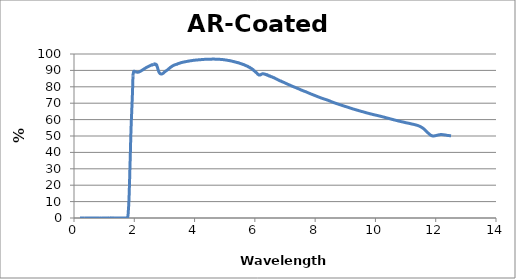
| Category | % Transmission |
|---|---|
| 0.2 | 0 |
| 0.201 | 0 |
| 0.202 | 0 |
| 0.203 | 0 |
| 0.204 | 0 |
| 0.205 | 0 |
| 0.206 | 0 |
| 0.207 | 0 |
| 0.208 | 0 |
| 0.209 | 0 |
| 0.21 | 0 |
| 0.211 | 0 |
| 0.212 | 0 |
| 0.213 | 0 |
| 0.214 | 0 |
| 0.215 | 0 |
| 0.216 | 0 |
| 0.217 | 0 |
| 0.218 | 0 |
| 0.219 | 0 |
| 0.22 | 0 |
| 0.221 | 0 |
| 0.222 | 0 |
| 0.223 | 0 |
| 0.224 | 0 |
| 0.225 | 0 |
| 0.226 | 0 |
| 0.227 | 0 |
| 0.228 | 0 |
| 0.229 | 0 |
| 0.23 | 0 |
| 0.231 | 0 |
| 0.232 | 0 |
| 0.233 | 0 |
| 0.234 | 0 |
| 0.235 | 0 |
| 0.236 | 0 |
| 0.237 | 0 |
| 0.238 | 0 |
| 0.239 | 0 |
| 0.24 | 0 |
| 0.241 | 0 |
| 0.242 | 0 |
| 0.243 | 0 |
| 0.244 | 0 |
| 0.245 | 0 |
| 0.246 | 0 |
| 0.247 | 0 |
| 0.248 | 0 |
| 0.249 | 0 |
| 0.25 | 0 |
| 0.251 | 0 |
| 0.252 | 0 |
| 0.253 | 0 |
| 0.254 | 0 |
| 0.255 | 0 |
| 0.256 | 0 |
| 0.257 | 0 |
| 0.258 | 0 |
| 0.259 | 0 |
| 0.26 | 0 |
| 0.261 | 0 |
| 0.262 | 0 |
| 0.263 | 0 |
| 0.264 | 0 |
| 0.265 | 0 |
| 0.266 | 0 |
| 0.267 | 0 |
| 0.268 | 0 |
| 0.269 | 0 |
| 0.27 | 0 |
| 0.271 | 0 |
| 0.272 | 0 |
| 0.273 | 0 |
| 0.274 | 0 |
| 0.275 | 0 |
| 0.276 | 0 |
| 0.277 | 0 |
| 0.278 | 0 |
| 0.279 | 0 |
| 0.28 | 0 |
| 0.281 | 0 |
| 0.282 | 0 |
| 0.283 | 0 |
| 0.284 | 0 |
| 0.285 | 0 |
| 0.286 | 0 |
| 0.287 | 0 |
| 0.288 | 0 |
| 0.289 | 0 |
| 0.29 | 0 |
| 0.291 | 0 |
| 0.292 | 0 |
| 0.293 | 0 |
| 0.294 | 0 |
| 0.295 | 0 |
| 0.296 | 0 |
| 0.297 | 0 |
| 0.298 | 0 |
| 0.299 | 0 |
| 0.3 | 0 |
| 0.301 | 0 |
| 0.302 | 0 |
| 0.303 | 0 |
| 0.304 | 0 |
| 0.305 | 0 |
| 0.306 | 0 |
| 0.307 | 0 |
| 0.308 | 0 |
| 0.309 | 0 |
| 0.31 | 0 |
| 0.311 | 0 |
| 0.312 | 0 |
| 0.313 | 0 |
| 0.314 | 0 |
| 0.315 | 0 |
| 0.316 | 0 |
| 0.317 | 0 |
| 0.318 | 0 |
| 0.319 | 0 |
| 0.32 | 0 |
| 0.321 | 0 |
| 0.322 | 0 |
| 0.323 | 0 |
| 0.324 | 0 |
| 0.325 | 0 |
| 0.326 | 0 |
| 0.327 | 0 |
| 0.328 | 0 |
| 0.329 | 0 |
| 0.33 | 0 |
| 0.331 | 0 |
| 0.332 | 0 |
| 0.333 | 0 |
| 0.334 | 0 |
| 0.335 | 0 |
| 0.336 | 0 |
| 0.337 | 0 |
| 0.338 | 0 |
| 0.339 | 0 |
| 0.34 | 0 |
| 0.341 | 0 |
| 0.342 | 0 |
| 0.343 | 0 |
| 0.344 | 0 |
| 0.345 | 0 |
| 0.346 | 0 |
| 0.347 | 0 |
| 0.348 | 0 |
| 0.349 | 0 |
| 0.35 | 0 |
| 0.351 | 0 |
| 0.352 | 0 |
| 0.353 | 0 |
| 0.354 | 0 |
| 0.355 | 0 |
| 0.356 | 0 |
| 0.357 | 0 |
| 0.358 | 0 |
| 0.359 | 0 |
| 0.36 | 0 |
| 0.361 | 0 |
| 0.362 | 0 |
| 0.363 | 0 |
| 0.364 | 0 |
| 0.365 | 0 |
| 0.366 | 0 |
| 0.367 | 0 |
| 0.368 | 0 |
| 0.369 | 0 |
| 0.37 | 0 |
| 0.371 | 0 |
| 0.372 | 0 |
| 0.373 | 0 |
| 0.374 | 0 |
| 0.375 | 0 |
| 0.376 | 0 |
| 0.377 | 0 |
| 0.378 | 0 |
| 0.379 | 0 |
| 0.38 | 0 |
| 0.381 | 0 |
| 0.382 | 0 |
| 0.383 | 0 |
| 0.384 | 0 |
| 0.385 | 0 |
| 0.386 | 0 |
| 0.387 | 0 |
| 0.388 | 0 |
| 0.389 | 0 |
| 0.39 | 0 |
| 0.391 | 0 |
| 0.392 | 0 |
| 0.393 | 0 |
| 0.394 | 0 |
| 0.395 | 0 |
| 0.396 | 0 |
| 0.397 | 0 |
| 0.398 | 0 |
| 0.399 | 0 |
| 0.4 | 0 |
| 0.401 | 0 |
| 0.402 | 0 |
| 0.403 | 0 |
| 0.404 | 0 |
| 0.405 | 0 |
| 0.406 | 0 |
| 0.407 | 0 |
| 0.408 | 0 |
| 0.409 | 0 |
| 0.41 | 0 |
| 0.411 | 0 |
| 0.412 | 0 |
| 0.413 | 0 |
| 0.414 | 0 |
| 0.415 | 0 |
| 0.416 | 0 |
| 0.417 | 0 |
| 0.418 | 0 |
| 0.419 | 0 |
| 0.42 | 0 |
| 0.421 | 0 |
| 0.422 | 0 |
| 0.423 | 0 |
| 0.424 | 0 |
| 0.425 | 0 |
| 0.426 | 0 |
| 0.427 | 0 |
| 0.428 | 0 |
| 0.429 | 0 |
| 0.43 | 0 |
| 0.431 | 0 |
| 0.432 | 0 |
| 0.433 | 0 |
| 0.434 | 0 |
| 0.435 | 0 |
| 0.436 | 0 |
| 0.437 | 0 |
| 0.438 | 0 |
| 0.439 | 0 |
| 0.44 | 0 |
| 0.441 | 0 |
| 0.442 | 0 |
| 0.443 | 0 |
| 0.444 | 0 |
| 0.445 | 0 |
| 0.446 | 0 |
| 0.447 | 0 |
| 0.448 | 0 |
| 0.449 | 0 |
| 0.45 | 0 |
| 0.451 | 0 |
| 0.452 | 0 |
| 0.453 | 0 |
| 0.454 | 0 |
| 0.455 | 0 |
| 0.456 | 0 |
| 0.457 | 0 |
| 0.458 | 0 |
| 0.459 | 0 |
| 0.46 | 0 |
| 0.461 | 0 |
| 0.462 | 0 |
| 0.463 | 0 |
| 0.464 | 0 |
| 0.465 | 0 |
| 0.466 | 0 |
| 0.467 | 0 |
| 0.468 | 0 |
| 0.469 | 0 |
| 0.47 | 0 |
| 0.471 | 0 |
| 0.472 | 0 |
| 0.473 | 0 |
| 0.474 | 0 |
| 0.475 | 0 |
| 0.476 | 0 |
| 0.477 | 0 |
| 0.478 | 0 |
| 0.479 | 0 |
| 0.48 | 0 |
| 0.481 | 0 |
| 0.482 | 0 |
| 0.483 | 0 |
| 0.484 | 0 |
| 0.485 | 0 |
| 0.486 | 0 |
| 0.487 | 0 |
| 0.488 | 0 |
| 0.489 | 0 |
| 0.49 | 0 |
| 0.491 | 0 |
| 0.492 | 0 |
| 0.493 | 0 |
| 0.494 | 0 |
| 0.495 | 0 |
| 0.496 | 0 |
| 0.497 | 0 |
| 0.498 | 0 |
| 0.499 | 0 |
| 0.5 | 0 |
| 0.501 | 0 |
| 0.502 | 0 |
| 0.503 | 0 |
| 0.504 | 0 |
| 0.505 | 0 |
| 0.506 | 0 |
| 0.507 | 0 |
| 0.508 | 0 |
| 0.509 | 0 |
| 0.51 | 0 |
| 0.511 | 0 |
| 0.512 | 0 |
| 0.513 | 0 |
| 0.514 | 0 |
| 0.515 | 0 |
| 0.516 | 0 |
| 0.517 | 0 |
| 0.518 | 0 |
| 0.519 | 0 |
| 0.52 | 0 |
| 0.521 | 0 |
| 0.522 | 0 |
| 0.523 | 0 |
| 0.524 | 0 |
| 0.525 | 0 |
| 0.526 | 0 |
| 0.527 | 0 |
| 0.528 | 0 |
| 0.529 | 0 |
| 0.53 | 0 |
| 0.531 | 0 |
| 0.532 | 0 |
| 0.533 | 0 |
| 0.534 | 0 |
| 0.535 | 0 |
| 0.536 | 0 |
| 0.537 | 0 |
| 0.538 | 0 |
| 0.539 | 0 |
| 0.54 | 0 |
| 0.541 | 0 |
| 0.542 | 0 |
| 0.543 | 0 |
| 0.544 | 0 |
| 0.545 | 0 |
| 0.546 | 0 |
| 0.547 | 0 |
| 0.548 | 0 |
| 0.549 | 0 |
| 0.55 | 0 |
| 0.551 | 0 |
| 0.552 | 0 |
| 0.553 | 0 |
| 0.554 | 0 |
| 0.555 | 0 |
| 0.556 | 0 |
| 0.557 | 0 |
| 0.558 | 0 |
| 0.559 | 0 |
| 0.56 | 0 |
| 0.561 | 0 |
| 0.562 | 0 |
| 0.563 | 0 |
| 0.564 | 0 |
| 0.565 | 0 |
| 0.566 | 0 |
| 0.567 | 0 |
| 0.568 | 0 |
| 0.569 | 0 |
| 0.57 | 0 |
| 0.571 | 0 |
| 0.572 | 0 |
| 0.573 | 0 |
| 0.574 | 0 |
| 0.575 | 0 |
| 0.576 | 0 |
| 0.577 | 0 |
| 0.578 | 0 |
| 0.579 | 0 |
| 0.58 | 0 |
| 0.581 | 0 |
| 0.582 | 0 |
| 0.583 | 0 |
| 0.584 | 0 |
| 0.585 | 0 |
| 0.586 | 0 |
| 0.587 | 0 |
| 0.588 | 0 |
| 0.589 | 0 |
| 0.59 | 0 |
| 0.591 | 0 |
| 0.592 | 0 |
| 0.593 | 0 |
| 0.594 | 0 |
| 0.595 | 0 |
| 0.596 | 0 |
| 0.597 | 0 |
| 0.598 | 0 |
| 0.599 | 0 |
| 0.6 | 0 |
| 0.601 | 0 |
| 0.602 | 0 |
| 0.603 | 0 |
| 0.604 | 0 |
| 0.605 | 0 |
| 0.606 | 0 |
| 0.607 | 0 |
| 0.608 | 0 |
| 0.609 | 0 |
| 0.61 | 0 |
| 0.611 | 0 |
| 0.612 | 0 |
| 0.613 | 0 |
| 0.614 | 0 |
| 0.615 | 0 |
| 0.616 | 0 |
| 0.617 | 0 |
| 0.618 | 0 |
| 0.619 | 0 |
| 0.62 | 0 |
| 0.621 | 0 |
| 0.622 | 0 |
| 0.623 | 0 |
| 0.624 | 0 |
| 0.625 | 0 |
| 0.626 | 0 |
| 0.627 | 0 |
| 0.628 | 0 |
| 0.629 | 0 |
| 0.63 | 0 |
| 0.631 | 0 |
| 0.632 | 0 |
| 0.633 | 0 |
| 0.634 | 0 |
| 0.635 | 0 |
| 0.636 | 0 |
| 0.637 | 0 |
| 0.638 | 0 |
| 0.639 | 0 |
| 0.64 | 0 |
| 0.641 | 0 |
| 0.642 | 0 |
| 0.643 | 0 |
| 0.644 | 0 |
| 0.645 | 0 |
| 0.646 | 0 |
| 0.647 | 0 |
| 0.648 | 0 |
| 0.649 | 0 |
| 0.65 | 0 |
| 0.651 | 0 |
| 0.652 | 0 |
| 0.653 | 0 |
| 0.654 | 0 |
| 0.655 | 0 |
| 0.656 | 0 |
| 0.657 | 0 |
| 0.658 | 0 |
| 0.659 | 0 |
| 0.66 | 0 |
| 0.661 | 0 |
| 0.662 | 0 |
| 0.663 | 0 |
| 0.664 | 0 |
| 0.665 | 0 |
| 0.666 | 0 |
| 0.667 | 0 |
| 0.668 | 0 |
| 0.669 | 0 |
| 0.67 | 0 |
| 0.671 | 0 |
| 0.672 | 0 |
| 0.673 | 0 |
| 0.674 | 0 |
| 0.675 | 0 |
| 0.676 | 0 |
| 0.677 | 0 |
| 0.678 | 0 |
| 0.679 | 0 |
| 0.68 | 0 |
| 0.681 | 0 |
| 0.682 | 0 |
| 0.683 | 0 |
| 0.684 | 0 |
| 0.685 | 0 |
| 0.686 | 0 |
| 0.687 | 0 |
| 0.688 | 0 |
| 0.689 | 0 |
| 0.69 | 0 |
| 0.691 | 0 |
| 0.692 | 0 |
| 0.693 | 0 |
| 0.694 | 0 |
| 0.695 | 0 |
| 0.696 | 0 |
| 0.697 | 0 |
| 0.698 | 0 |
| 0.699 | 0 |
| 0.7 | 0 |
| 0.701 | 0 |
| 0.702 | 0 |
| 0.703 | 0 |
| 0.704 | 0 |
| 0.705 | 0 |
| 0.706 | 0 |
| 0.707 | 0 |
| 0.708 | 0 |
| 0.709 | 0 |
| 0.71 | 0 |
| 0.711 | 0 |
| 0.712 | 0 |
| 0.713 | 0 |
| 0.714 | 0 |
| 0.715 | 0 |
| 0.716 | 0 |
| 0.717 | 0 |
| 0.718 | 0 |
| 0.719 | 0 |
| 0.72 | 0 |
| 0.721 | 0 |
| 0.722 | 0 |
| 0.723 | 0 |
| 0.724 | 0 |
| 0.725 | 0 |
| 0.726 | 0 |
| 0.727 | 0 |
| 0.728 | 0 |
| 0.729 | 0 |
| 0.73 | 0 |
| 0.731 | 0 |
| 0.732 | 0 |
| 0.733 | 0 |
| 0.734 | 0 |
| 0.735 | 0 |
| 0.736 | 0 |
| 0.737 | 0 |
| 0.738 | 0 |
| 0.739 | 0 |
| 0.74 | 0 |
| 0.741 | 0 |
| 0.742 | 0 |
| 0.743 | 0 |
| 0.744 | 0 |
| 0.745 | 0 |
| 0.746 | 0 |
| 0.747 | 0 |
| 0.748 | 0 |
| 0.749 | 0 |
| 0.75 | 0 |
| 0.751 | 0 |
| 0.752 | 0 |
| 0.753 | 0 |
| 0.754 | 0 |
| 0.755 | 0 |
| 0.756 | 0 |
| 0.757 | 0 |
| 0.758 | 0 |
| 0.759 | 0 |
| 0.76 | 0 |
| 0.761 | 0 |
| 0.762 | 0 |
| 0.763 | 0 |
| 0.764 | 0 |
| 0.765 | 0 |
| 0.766 | 0 |
| 0.767 | 0 |
| 0.768 | 0 |
| 0.769 | 0 |
| 0.77 | 0 |
| 0.771 | 0 |
| 0.772 | 0 |
| 0.773 | 0 |
| 0.774 | 0 |
| 0.775 | 0 |
| 0.776 | 0 |
| 0.777 | 0 |
| 0.778 | 0 |
| 0.779 | 0 |
| 0.78 | 0 |
| 0.781 | 0 |
| 0.782 | 0 |
| 0.783 | 0 |
| 0.784 | 0 |
| 0.785 | 0 |
| 0.786 | 0 |
| 0.787 | 0 |
| 0.788 | 0 |
| 0.789 | 0 |
| 0.79 | 0 |
| 0.791 | 0 |
| 0.792 | 0 |
| 0.793 | 0 |
| 0.794 | 0 |
| 0.795 | 0 |
| 0.796 | 0 |
| 0.797 | 0 |
| 0.798 | 0 |
| 0.799 | 0 |
| 0.8 | 0 |
| 0.801 | 0 |
| 0.802 | 0 |
| 0.803 | 0 |
| 0.804 | 0 |
| 0.805 | 0 |
| 0.806 | 0 |
| 0.807 | 0 |
| 0.808 | 0 |
| 0.809 | 0 |
| 0.81 | 0 |
| 0.811 | 0 |
| 0.812 | 0 |
| 0.813 | 0 |
| 0.814 | 0 |
| 0.815 | 0 |
| 0.816 | 0 |
| 0.817 | 0 |
| 0.818 | 0 |
| 0.819 | 0 |
| 0.82 | 0 |
| 0.821 | 0 |
| 0.822 | 0 |
| 0.823 | 0 |
| 0.824 | 0 |
| 0.825 | 0 |
| 0.826 | 0 |
| 0.827 | 0 |
| 0.828 | 0 |
| 0.829 | 0 |
| 0.83 | 0 |
| 0.831 | 0 |
| 0.832 | 0 |
| 0.833 | 0 |
| 0.834 | 0 |
| 0.835 | 0 |
| 0.836 | 0 |
| 0.837 | 0 |
| 0.838 | 0 |
| 0.839 | 0 |
| 0.84 | 0 |
| 0.841 | 0 |
| 0.842 | 0 |
| 0.843 | 0 |
| 0.844 | 0 |
| 0.845 | 0 |
| 0.846 | 0 |
| 0.847 | 0 |
| 0.848 | 0 |
| 0.849 | 0 |
| 0.85 | 0 |
| 0.851 | 0 |
| 0.852 | 0 |
| 0.853 | 0 |
| 0.854 | 0 |
| 0.855 | 0 |
| 0.856 | 0 |
| 0.857 | 0 |
| 0.858 | 0 |
| 0.859 | 0 |
| 0.86 | 0.018 |
| 0.861 | 0.009 |
| 0.862 | 0.022 |
| 0.863 | 0.005 |
| 0.864 | 0.008 |
| 0.865 | 0.018 |
| 0.866 | 0.008 |
| 0.867 | 0.009 |
| 0.868 | 0.015 |
| 0.869 | 0.008 |
| 0.87 | 0.009 |
| 0.871 | 0.011 |
| 0.872 | 0 |
| 0.873 | 0 |
| 0.874 | 0.002 |
| 0.875 | 0.007 |
| 0.876 | 0.006 |
| 0.877 | 0.003 |
| 0.878 | 0.002 |
| 0.879 | 0.012 |
| 0.88 | 0.001 |
| 0.881 | 0.002 |
| 0.882 | 0.004 |
| 0.883 | 0 |
| 0.884 | 0.008 |
| 0.885 | 0.001 |
| 0.886 | 0 |
| 0.887 | 0 |
| 0.888 | 0 |
| 0.889 | 0.005 |
| 0.89 | 0.006 |
| 0.891 | 0.001 |
| 0.892 | 0.003 |
| 0.893 | 0.004 |
| 0.894 | 0.008 |
| 0.895 | 0.002 |
| 0.896 | 0 |
| 0.897 | 0.008 |
| 0.898 | 0.001 |
| 0.899 | 0.003 |
| 0.9 | 0.001 |
| 0.901 | 0.001 |
| 0.902 | 0.004 |
| 0.903 | 0 |
| 0.904 | 0.003 |
| 0.905 | 0.003 |
| 0.906 | 0.002 |
| 0.907 | 0.005 |
| 0.908 | 0.003 |
| 0.909 | 0.004 |
| 0.91 | 0.002 |
| 0.911 | 0.001 |
| 0.912 | 0.008 |
| 0.913 | 0.001 |
| 0.914 | 0.002 |
| 0.915 | 0 |
| 0.916 | 0 |
| 0.917 | 0.005 |
| 0.918 | 0 |
| 0.919 | 0.003 |
| 0.92 | 0.001 |
| 0.921 | 0.002 |
| 0.922 | 0.005 |
| 0.923 | 0.004 |
| 0.924 | 0.005 |
| 0.925 | 0.002 |
| 0.926 | 0.001 |
| 0.927 | 0.006 |
| 0.928 | 0.003 |
| 0.929 | 0.002 |
| 0.93 | 0.002 |
| 0.931 | 0.001 |
| 0.932 | 0.006 |
| 0.933 | 0 |
| 0.934 | 0.004 |
| 0.935 | 0.005 |
| 0.936 | 0.003 |
| 0.937 | 0.004 |
| 0.938 | 0.001 |
| 0.939 | 0.006 |
| 0.94 | 0.006 |
| 0.941 | 0.003 |
| 0.942 | 0.005 |
| 0.943 | 0 |
| 0.944 | 0.005 |
| 0.945 | 0.001 |
| 0.946 | 0.003 |
| 0.947 | 0 |
| 0.948 | 0 |
| 0.949 | 0.008 |
| 0.95 | 0.006 |
| 0.951 | 0.003 |
| 0.952 | 0.011 |
| 0.953 | 0.005 |
| 0.954 | 0 |
| 0.955 | 0.009 |
| 0.956 | 0.006 |
| 0.957 | 0 |
| 0.958 | 0.008 |
| 0.959 | 0.008 |
| 0.96 | 0 |
| 0.961 | 0.009 |
| 0.962 | 0.006 |
| 0.963 | 0 |
| 0.964 | 0.008 |
| 0.965 | 0.005 |
| 0.966 | 0 |
| 0.967 | 0.008 |
| 0.968 | 0.006 |
| 0.969 | 0.001 |
| 0.97 | 0.004 |
| 0.971 | 0.007 |
| 0.972 | 0.003 |
| 0.973 | 0.004 |
| 0.974 | 0.007 |
| 0.975 | 0.006 |
| 0.976 | 0.006 |
| 0.977 | 0.005 |
| 0.978 | 0.008 |
| 0.979 | 0.008 |
| 0.98 | 0.002 |
| 0.981 | 0.008 |
| 0.982 | 0.009 |
| 0.983 | 0.002 |
| 0.984 | 0.006 |
| 0.985 | 0.009 |
| 0.986 | 0.004 |
| 0.987 | 0.009 |
| 0.988 | 0.011 |
| 0.989 | 0.006 |
| 0.99 | 0.009 |
| 0.991 | 0.011 |
| 0.992 | 0.004 |
| 0.993 | 0.007 |
| 0.994 | 0.01 |
| 0.995 | 0.006 |
| 0.996 | 0.008 |
| 0.997 | 0.011 |
| 0.998 | 0.004 |
| 0.999 | 0.007 |
| 1.0 | 0.011 |
| 1.001 | 0.003 |
| 1.002 | 0.008 |
| 1.003 | 0.011 |
| 1.004 | 0.003 |
| 1.005 | 0.012 |
| 1.006 | 0.008 |
| 1.007 | 0.001 |
| 1.008 | 0.01 |
| 1.009 | 0.008 |
| 1.01 | 0 |
| 1.011 | 0.01 |
| 1.012 | 0.009 |
| 1.013 | 0.002 |
| 1.014 | 0.013 |
| 1.015 | 0.009 |
| 1.016 | 0.002 |
| 1.017 | 0.012 |
| 1.018 | 0.011 |
| 1.019 | 0.001 |
| 1.02 | 0.014 |
| 1.021 | 0.008 |
| 1.022 | 0.001 |
| 1.023 | 0.012 |
| 1.024 | 0.011 |
| 1.025 | 0 |
| 1.026 | 0.014 |
| 1.027 | 0.008 |
| 1.028 | 0.002 |
| 1.029 | 0.011 |
| 1.03 | 0.012 |
| 1.031 | 0.008 |
| 1.032 | 0.011 |
| 1.033 | 0.014 |
| 1.034 | 0.006 |
| 1.035 | 0.011 |
| 1.036 | 0.012 |
| 1.037 | 0.005 |
| 1.038 | 0.01 |
| 1.039 | 0.013 |
| 1.04 | 0.005 |
| 1.041 | 0.008 |
| 1.042 | 0.011 |
| 1.043 | 0.005 |
| 1.044 | 0.007 |
| 1.045 | 0.006 |
| 1.046 | 0.001 |
| 1.047 | 0.002 |
| 1.048 | 0 |
| 1.049 | 0.023 |
| 1.05 | 0.014 |
| 1.051 | 0.019 |
| 1.052 | 0.02 |
| 1.053 | 0.012 |
| 1.054 | 0.02 |
| 1.055 | 0.019 |
| 1.056 | 0.025 |
| 1.057 | 0.021 |
| 1.058 | 0.027 |
| 1.059 | 0.061 |
| 1.06 | 0.024 |
| 1.061 | 0.005 |
| 1.062 | 0.005 |
| 1.063 | 0.008 |
| 1.064 | 0.014 |
| 1.065 | 0.016 |
| 1.066 | 0.015 |
| 1.067 | 0.017 |
| 1.068 | 0.004 |
| 1.069 | 0.028 |
| 1.07 | 0.017 |
| 1.071 | 0.002 |
| 1.072 | 0.011 |
| 1.073 | 0.008 |
| 1.074 | 0.009 |
| 1.075 | 0.012 |
| 1.076 | 0.006 |
| 1.077 | 0.002 |
| 1.078 | 0.003 |
| 1.079 | 0.011 |
| 1.08 | 0.015 |
| 1.081 | 0.006 |
| 1.082 | 0.009 |
| 1.083 | 0.006 |
| 1.084 | 0.007 |
| 1.085 | 0.034 |
| 1.086 | 0.016 |
| 1.087 | 0.008 |
| 1.088 | 0.01 |
| 1.089 | 0.003 |
| 1.09 | 0.002 |
| 1.091 | 0.002 |
| 1.092 | 0 |
| 1.093 | 0.003 |
| 1.094 | 0.006 |
| 1.095 | 0.006 |
| 1.096 | 0.008 |
| 1.097 | 0.002 |
| 1.098 | 0.006 |
| 1.099 | 0.011 |
| 1.1 | 0.007 |
| 1.101 | 0.007 |
| 1.102 | 0.044 |
| 1.103 | 0.027 |
| 1.104 | 0.003 |
| 1.105 | 0.004 |
| 1.106 | 0.001 |
| 1.107 | 0.001 |
| 1.108 | 0.008 |
| 1.109 | 0 |
| 1.11 | 0.001 |
| 1.111 | 0.002 |
| 1.112 | 0.002 |
| 1.113 | 0.011 |
| 1.114 | 0.015 |
| 1.115 | 0.014 |
| 1.116 | 0.005 |
| 1.117 | 0.006 |
| 1.118 | 0.015 |
| 1.119 | 0.014 |
| 1.12 | 0.003 |
| 1.121 | 0.011 |
| 1.122 | 0.039 |
| 1.123 | 0.004 |
| 1.124 | 0.016 |
| 1.125 | 0.016 |
| 1.126 | 0.009 |
| 1.127 | 0.004 |
| 1.128 | 0.029 |
| 1.129 | 0.044 |
| 1.13 | 0.051 |
| 1.131 | 0.024 |
| 1.132 | 0.035 |
| 1.133 | 0.06 |
| 1.134 | 0.065 |
| 1.135 | 0.008 |
| 1.136 | 0.017 |
| 1.137 | 0.011 |
| 1.138 | 0.015 |
| 1.139 | 0.015 |
| 1.14 | 0.023 |
| 1.141 | 0.018 |
| 1.142 | 0.017 |
| 1.143 | 0.019 |
| 1.144 | 0.006 |
| 1.145 | 0.041 |
| 1.146 | 0.047 |
| 1.147 | 0 |
| 1.148 | 0.017 |
| 1.149 | 0.016 |
| 1.15 | 0.031 |
| 1.151 | 0.029 |
| 1.152 | 0.024 |
| 1.153 | 0.013 |
| 1.154 | 0.049 |
| 1.155 | 0.06 |
| 1.156 | 0.061 |
| 1.157 | 0.006 |
| 1.158 | 0.015 |
| 1.159 | 0.007 |
| 1.16 | 0.009 |
| 1.161 | 0.013 |
| 1.162 | 0.014 |
| 1.163 | 0.022 |
| 1.164 | 0.018 |
| 1.165 | 0.034 |
| 1.166 | 0.033 |
| 1.167 | 0.03 |
| 1.168 | 0.021 |
| 1.169 | 0.031 |
| 1.17 | 0.045 |
| 1.171 | 0.052 |
| 1.172 | 0.05 |
| 1.173 | 0.046 |
| 1.174 | 0.004 |
| 1.175 | 0.006 |
| 1.176 | 0.003 |
| 1.177 | 0.005 |
| 1.178 | 0.001 |
| 1.179 | 0.012 |
| 1.18 | 0.001 |
| 1.181 | 0.003 |
| 1.182 | 0.004 |
| 1.183 | 0.007 |
| 1.184 | 0.012 |
| 1.185 | 0.008 |
| 1.186 | 0.009 |
| 1.187 | 0.004 |
| 1.188 | 0.012 |
| 1.189 | 0.015 |
| 1.19 | 0.033 |
| 1.191 | 0.049 |
| 1.192 | 0.044 |
| 1.193 | 0.004 |
| 1.194 | 0.015 |
| 1.195 | 0.023 |
| 1.196 | 0.026 |
| 1.197 | 0.008 |
| 1.198 | 0.026 |
| 1.199 | 0.005 |
| 1.2 | 0.009 |
| 1.201 | 0.018 |
| 1.202 | 0.02 |
| 1.203 | 0.018 |
| 1.204 | 0.01 |
| 1.205 | 0.029 |
| 1.206 | 0.028 |
| 1.207 | 0.021 |
| 1.208 | 0.046 |
| 1.209 | 0.045 |
| 1.21 | 0.013 |
| 1.211 | 0.022 |
| 1.212 | 0.01 |
| 1.213 | 0.027 |
| 1.214 | 0.001 |
| 1.215 | 0.071 |
| 1.216 | 0.04 |
| 1.217 | 0.009 |
| 1.218 | 0.014 |
| 1.219 | 0.029 |
| 1.22 | 0.022 |
| 1.221 | 0.012 |
| 1.222 | 0.061 |
| 1.223 | 0.05 |
| 1.224 | 0.003 |
| 1.225 | 0.002 |
| 1.226 | 0.005 |
| 1.227 | 0.001 |
| 1.228 | 0.006 |
| 1.229 | 0.004 |
| 1.23 | 0.01 |
| 1.231 | 0.011 |
| 1.232 | 0.009 |
| 1.233 | 0.017 |
| 1.234 | 0.009 |
| 1.235 | 0.003 |
| 1.236 | 0.017 |
| 1.237 | 0.016 |
| 1.238 | 0.018 |
| 1.239 | 0.003 |
| 1.24 | 0.052 |
| 1.241 | 0.001 |
| 1.242 | 0.006 |
| 1.243 | 0.009 |
| 1.244 | 0.004 |
| 1.245 | 0.01 |
| 1.246 | 0.016 |
| 1.247 | 0.002 |
| 1.248 | 0.005 |
| 1.249 | 0.009 |
| 1.25 | 0.014 |
| 1.251 | 0.001 |
| 1.252 | 0.005 |
| 1.253 | 0 |
| 1.254 | 0.002 |
| 1.255 | 0.004 |
| 1.256 | 0.035 |
| 1.257 | 0.09 |
| 1.258 | 0.059 |
| 1.259 | 0.034 |
| 1.26 | 0.057 |
| 1.261 | 0.025 |
| 1.262 | 0.03 |
| 1.263 | 0.013 |
| 1.264 | 0.046 |
| 1.265 | 0.042 |
| 1.266 | 0.006 |
| 1.267 | 0.007 |
| 1.268 | 0.021 |
| 1.269 | 0.013 |
| 1.27 | 0.016 |
| 1.271 | 0.007 |
| 1.272 | 0.008 |
| 1.273 | 0.009 |
| 1.274 | 0.012 |
| 1.275 | 0.012 |
| 1.276 | 0.024 |
| 1.277 | 0.026 |
| 1.278 | 0.027 |
| 1.279 | 0.001 |
| 1.28 | 0.061 |
| 1.281 | 0.061 |
| 1.282 | 0.043 |
| 1.283 | 0.003 |
| 1.284 | 0.007 |
| 1.285 | 0.008 |
| 1.286 | 0.006 |
| 1.287 | 0.003 |
| 1.288 | 0.003 |
| 1.289 | 0.018 |
| 1.29 | 0.012 |
| 1.291 | 0.014 |
| 1.292 | 0.025 |
| 1.293 | 0.014 |
| 1.294 | 0.012 |
| 1.295 | 0.02 |
| 1.296 | 0.019 |
| 1.297 | 0.03 |
| 1.298 | 0.035 |
| 1.299 | 0.019 |
| 1.3 | 0.021 |
| 1.301 | 0.022 |
| 1.302 | 0.018 |
| 1.303 | 0.011 |
| 1.304 | 0.025 |
| 1.305 | 0.026 |
| 1.306 | 0 |
| 1.307 | 0.037 |
| 1.308 | 0.011 |
| 1.309 | 0.02 |
| 1.31 | 0.021 |
| 1.311 | 0.041 |
| 1.312 | 0.038 |
| 1.313 | 0.049 |
| 1.314 | 0.016 |
| 1.315 | 0.031 |
| 1.316 | 0.041 |
| 1.317 | 0.054 |
| 1.318 | 0.068 |
| 1.319 | 0.039 |
| 1.32 | 0.01 |
| 1.321 | 0.009 |
| 1.322 | 0.015 |
| 1.323 | 0.013 |
| 1.324 | 0.011 |
| 1.325 | 0.014 |
| 1.326 | 0.007 |
| 1.327 | 0.014 |
| 1.328 | 0.015 |
| 1.329 | 0.029 |
| 1.33 | 0.024 |
| 1.331 | 0.038 |
| 1.332 | 0.032 |
| 1.333 | 0.021 |
| 1.334 | 0.017 |
| 1.335 | 0.049 |
| 1.336 | 0.023 |
| 1.337 | 0.018 |
| 1.338 | 0.015 |
| 1.339 | 0.018 |
| 1.34 | 0.028 |
| 1.341 | 0.027 |
| 1.342 | 0.024 |
| 1.343 | 0.022 |
| 1.344 | 0.011 |
| 1.345 | 0.051 |
| 1.346 | 0.008 |
| 1.347 | 0.019 |
| 1.348 | 0.009 |
| 1.349 | 0.018 |
| 1.35 | 0.03 |
| 1.351 | 0.026 |
| 1.352 | 0.006 |
| 1.353 | 0.003 |
| 1.354 | 0.02 |
| 1.355 | 0.047 |
| 1.356 | 0.007 |
| 1.357 | 0.004 |
| 1.358 | 0.009 |
| 1.359 | 0.003 |
| 1.36 | 0.002 |
| 1.361 | 0.007 |
| 1.362 | 0.006 |
| 1.363 | 0.003 |
| 1.364 | 0.006 |
| 1.365 | 0.005 |
| 1.366 | 0.003 |
| 1.367 | 0.009 |
| 1.368 | 0.006 |
| 1.369 | 0.003 |
| 1.37 | 0.008 |
| 1.371 | 0.006 |
| 1.372 | 0.002 |
| 1.373 | 0.007 |
| 1.374 | 0.005 |
| 1.375 | 0.002 |
| 1.376 | 0.006 |
| 1.377 | 0.005 |
| 1.378 | 0.001 |
| 1.379 | 0.008 |
| 1.38 | 0.007 |
| 1.381 | 0 |
| 1.382 | 0.01 |
| 1.383 | 0.008 |
| 1.384 | 0.004 |
| 1.385 | 0.012 |
| 1.386 | 0.01 |
| 1.387 | 0.001 |
| 1.388 | 0.008 |
| 1.389 | 0.01 |
| 1.39 | 0.002 |
| 1.391 | 0.007 |
| 1.392 | 0.009 |
| 1.393 | 0.001 |
| 1.394 | 0.009 |
| 1.395 | 0.009 |
| 1.396 | 0.002 |
| 1.397 | 0.009 |
| 1.398 | 0.009 |
| 1.399 | 0.002 |
| 1.4 | 0.01 |
| 1.401 | 0.01 |
| 1.402 | 0.001 |
| 1.403 | 0.008 |
| 1.404 | 0.01 |
| 1.405 | 0 |
| 1.406 | 0.011 |
| 1.407 | 0.011 |
| 1.408 | 0.002 |
| 1.409 | 0.008 |
| 1.41 | 0.013 |
| 1.411 | 0 |
| 1.412 | 0.009 |
| 1.413 | 0.01 |
| 1.414 | 0.001 |
| 1.415 | 0.009 |
| 1.416 | 0.01 |
| 1.417 | 0.002 |
| 1.418 | 0.01 |
| 1.419 | 0.009 |
| 1.42 | 0.002 |
| 1.421 | 0.007 |
| 1.422 | 0.01 |
| 1.423 | 0.001 |
| 1.424 | 0.009 |
| 1.425 | 0.009 |
| 1.426 | 0.002 |
| 1.427 | 0.001 |
| 1.428 | 0.009 |
| 1.429 | 0.01 |
| 1.43 | 0.003 |
| 1.431 | 0.008 |
| 1.432 | 0.007 |
| 1.433 | 0.002 |
| 1.434 | 0.006 |
| 1.435 | 0.007 |
| 1.436 | 0.001 |
| 1.437 | 0.006 |
| 1.438 | 0.008 |
| 1.439 | 0.003 |
| 1.44 | 0.008 |
| 1.441 | 0.006 |
| 1.442 | 0.001 |
| 1.443 | 0.008 |
| 1.444 | 0.007 |
| 1.445 | 0.002 |
| 1.446 | 0.008 |
| 1.447 | 0.004 |
| 1.448 | 0.002 |
| 1.449 | 0.005 |
| 1.45 | 0.008 |
| 1.451 | 0.002 |
| 1.452 | 0.006 |
| 1.453 | 0.007 |
| 1.454 | 0 |
| 1.455 | 0.009 |
| 1.456 | 0.008 |
| 1.457 | 0.002 |
| 1.458 | 0.007 |
| 1.459 | 0.008 |
| 1.46 | 0 |
| 1.461 | 0.007 |
| 1.462 | 0.007 |
| 1.463 | 0.001 |
| 1.464 | 0.006 |
| 1.465 | 0.004 |
| 1.466 | 0.003 |
| 1.467 | 0.006 |
| 1.468 | 0.005 |
| 1.469 | 0.002 |
| 1.47 | 0.004 |
| 1.471 | 0.005 |
| 1.472 | 0.001 |
| 1.473 | 0.004 |
| 1.474 | 0.006 |
| 1.475 | 0.002 |
| 1.476 | 0.004 |
| 1.477 | 0.006 |
| 1.478 | 0.003 |
| 1.479 | 0.006 |
| 1.48 | 0.003 |
| 1.481 | 0.001 |
| 1.482 | 0.002 |
| 1.483 | 0.003 |
| 1.484 | 0.003 |
| 1.485 | 0.005 |
| 1.486 | 0.004 |
| 1.487 | 0 |
| 1.488 | 0.003 |
| 1.489 | 0.003 |
| 1.49 | 0 |
| 1.491 | 0.003 |
| 1.492 | 0.005 |
| 1.493 | 0 |
| 1.494 | 0.005 |
| 1.495 | 0.006 |
| 1.496 | 0.001 |
| 1.497 | 0.007 |
| 1.498 | 0.006 |
| 1.499 | 0 |
| 1.5 | 0.002 |
| 1.501 | 0.007 |
| 1.502 | 0.001 |
| 1.503 | 0.007 |
| 1.504 | 0.007 |
| 1.505 | 0.001 |
| 1.506 | 0.005 |
| 1.507 | 0.006 |
| 1.508 | 0.001 |
| 1.509 | 0.005 |
| 1.51 | 0.006 |
| 1.511 | 0.001 |
| 1.512 | 0.005 |
| 1.513 | 0.005 |
| 1.514 | 0.001 |
| 1.515 | 0.004 |
| 1.516 | 0.006 |
| 1.517 | 0.001 |
| 1.518 | 0.006 |
| 1.519 | 0.007 |
| 1.52 | 0 |
| 1.521 | 0.005 |
| 1.522 | 0.005 |
| 1.523 | 0 |
| 1.524 | 0.003 |
| 1.525 | 0.007 |
| 1.526 | 0.001 |
| 1.527 | 0.005 |
| 1.528 | 0.005 |
| 1.529 | 0 |
| 1.53 | 0.003 |
| 1.531 | 0.005 |
| 1.532 | 0 |
| 1.533 | 0.004 |
| 1.534 | 0.005 |
| 1.535 | 0.001 |
| 1.536 | 0.004 |
| 1.537 | 0.004 |
| 1.538 | 0.003 |
| 1.539 | 0.001 |
| 1.54 | 0.003 |
| 1.541 | 0.001 |
| 1.542 | 0.003 |
| 1.543 | 0.005 |
| 1.544 | 0 |
| 1.545 | 0.003 |
| 1.546 | 0.005 |
| 1.547 | 0.001 |
| 1.548 | 0.003 |
| 1.549 | 0.004 |
| 1.55 | 0 |
| 1.551 | 0.003 |
| 1.552 | 0.004 |
| 1.553 | 0.001 |
| 1.554 | 0.002 |
| 1.555 | 0.004 |
| 1.556 | 0.001 |
| 1.557 | 0.003 |
| 1.558 | 0.003 |
| 1.559 | 0.003 |
| 1.56 | 0.003 |
| 1.561 | 0.004 |
| 1.562 | 0 |
| 1.563 | 0 |
| 1.564 | 0.006 |
| 1.565 | 0 |
| 1.566 | 0.002 |
| 1.567 | 0.002 |
| 1.568 | 0.002 |
| 1.569 | 0.002 |
| 1.57 | 0.004 |
| 1.571 | 0.001 |
| 1.572 | 0.001 |
| 1.573 | 0.005 |
| 1.574 | 0.001 |
| 1.575 | 0.001 |
| 1.576 | 0.002 |
| 1.577 | 0.002 |
| 1.578 | 0.001 |
| 1.579 | 0.004 |
| 1.58 | 0 |
| 1.581 | 0.002 |
| 1.582 | 0.003 |
| 1.583 | 0 |
| 1.584 | 0.001 |
| 1.585 | 0.005 |
| 1.586 | 0.001 |
| 1.587 | 0 |
| 1.588 | 0.004 |
| 1.589 | 0.001 |
| 1.59 | 0.001 |
| 1.591 | 0.003 |
| 1.592 | 0 |
| 1.593 | 0.001 |
| 1.594 | 0.003 |
| 1.595 | 0.001 |
| 1.596 | 0.001 |
| 1.597 | 0.004 |
| 1.598 | 0.002 |
| 1.599 | 0.001 |
| 1.6 | 0.002 |
| 1.601 | 0.002 |
| 1.602 | 0 |
| 1.603 | 0.004 |
| 1.604 | 0.002 |
| 1.605 | 0.002 |
| 1.606 | 0.002 |
| 1.607 | 0 |
| 1.608 | 0.001 |
| 1.609 | 0.002 |
| 1.61 | 0.001 |
| 1.611 | 0 |
| 1.612 | 0.001 |
| 1.613 | 0.001 |
| 1.614 | 0.001 |
| 1.615 | 0.004 |
| 1.616 | 0.001 |
| 1.617 | 0 |
| 1.618 | 0.003 |
| 1.619 | 0.001 |
| 1.62 | 0 |
| 1.621 | 0.003 |
| 1.622 | 0 |
| 1.623 | 0.001 |
| 1.624 | 0.002 |
| 1.625 | 0 |
| 1.626 | 0.001 |
| 1.627 | 0.003 |
| 1.628 | 0.001 |
| 1.629 | 0.001 |
| 1.63 | 0.001 |
| 1.631 | 0.002 |
| 1.632 | 0.001 |
| 1.633 | 0.001 |
| 1.634 | 0 |
| 1.635 | 0.003 |
| 1.636 | 0.003 |
| 1.637 | 0.001 |
| 1.638 | 0.001 |
| 1.639 | 0.002 |
| 1.64 | 0 |
| 1.641 | 0 |
| 1.642 | 0.001 |
| 1.643 | 0.002 |
| 1.644 | 0.001 |
| 1.645 | 0.001 |
| 1.646 | 0.001 |
| 1.647 | 0 |
| 1.648 | 0.001 |
| 1.649 | 0.002 |
| 1.65 | 0 |
| 1.651 | 0 |
| 1.652 | 0.001 |
| 1.653 | 0.001 |
| 1.654 | 0.001 |
| 1.655 | 0 |
| 1.656 | 0.001 |
| 1.657 | 0.003 |
| 1.658 | 0.002 |
| 1.659 | 0.003 |
| 1.66 | 0.001 |
| 1.661 | 0.001 |
| 1.662 | 0.002 |
| 1.663 | 0.002 |
| 1.664 | 0.001 |
| 1.665 | 0.001 |
| 1.666 | 0.004 |
| 1.667 | 0 |
| 1.668 | 0 |
| 1.669 | 0.001 |
| 1.67 | 0 |
| 1.671 | 0.003 |
| 1.672 | 0.001 |
| 1.673 | 0.001 |
| 1.674 | 0.002 |
| 1.675 | 0 |
| 1.676 | 0 |
| 1.677 | 0.003 |
| 1.678 | 0 |
| 1.679 | 0.001 |
| 1.68 | 0.001 |
| 1.681 | 0.001 |
| 1.682 | 0.002 |
| 1.683 | 0.002 |
| 1.684 | 0.001 |
| 1.685 | 0.001 |
| 1.686 | 0.001 |
| 1.687 | 0.001 |
| 1.688 | 0.001 |
| 1.689 | 0.001 |
| 1.69 | 0.001 |
| 1.691 | 0.001 |
| 1.692 | 0 |
| 1.693 | 0.001 |
| 1.694 | 0.001 |
| 1.695 | 0.001 |
| 1.696 | 0 |
| 1.697 | 0.001 |
| 1.698 | 0.001 |
| 1.699 | 0 |
| 1.7 | 0.001 |
| 1.701 | 0 |
| 1.702 | 0 |
| 1.703 | 0.002 |
| 1.704 | 0.001 |
| 1.705 | 0.001 |
| 1.706 | 0.001 |
| 1.707 | 0.002 |
| 1.708 | 0.001 |
| 1.709 | 0 |
| 1.71 | 0.002 |
| 1.711 | 0.001 |
| 1.712 | 0.001 |
| 1.713 | 0.001 |
| 1.714 | 0.002 |
| 1.715 | 0.001 |
| 1.716 | 0.001 |
| 1.717 | 0.002 |
| 1.718 | 0.001 |
| 1.719 | 0.002 |
| 1.72 | 0 |
| 1.721 | 0 |
| 1.722 | 0.002 |
| 1.723 | 0.003 |
| 1.724 | 0.002 |
| 1.725 | 0.001 |
| 1.726 | 0.003 |
| 1.727 | 0.002 |
| 1.728 | 0 |
| 1.729 | 0.002 |
| 1.73 | 0.004 |
| 1.731 | 0.002 |
| 1.732 | 0.006 |
| 1.733 | 0.004 |
| 1.734 | 0.005 |
| 1.735 | 0.005 |
| 1.736 | 0.006 |
| 1.737 | 0.005 |
| 1.738 | 0.008 |
| 1.739 | 0.008 |
| 1.74 | 0.006 |
| 1.741 | 0.007 |
| 1.742 | 0.01 |
| 1.743 | 0.011 |
| 1.744 | 0.014 |
| 1.745 | 0.016 |
| 1.746 | 0.016 |
| 1.747 | 0.018 |
| 1.748 | 0.02 |
| 1.749 | 0.023 |
| 1.75 | 0.026 |
| 1.751 | 0.03 |
| 1.752 | 0.031 |
| 1.753 | 0.038 |
| 1.754 | 0.042 |
| 1.755 | 0.045 |
| 1.756 | 0.048 |
| 1.757 | 0.057 |
| 1.758 | 0.061 |
| 1.759 | 0.066 |
| 1.76 | 0.077 |
| 1.761 | 0.083 |
| 1.762 | 0.094 |
| 1.763 | 0.105 |
| 1.764 | 0.112 |
| 1.765 | 0.125 |
| 1.766 | 0.141 |
| 1.767 | 0.152 |
| 1.768 | 0.168 |
| 1.769 | 0.188 |
| 1.77 | 0.206 |
| 1.771 | 0.226 |
| 1.772 | 0.249 |
| 1.773 | 0.273 |
| 1.774 | 0.306 |
| 1.775 | 0.339 |
| 1.776 | 0.379 |
| 1.777 | 0.425 |
| 1.778 | 0.472 |
| 1.779 | 0.524 |
| 1.78 | 0.567 |
| 1.781 | 0.62 |
| 1.782 | 0.674 |
| 1.783 | 0.733 |
| 1.784 | 0.801 |
| 1.785 | 0.885 |
| 1.786 | 0.976 |
| 1.787 | 1.074 |
| 1.788 | 1.193 |
| 1.789 | 1.294 |
| 1.79 | 1.398 |
| 1.791 | 1.523 |
| 1.792 | 1.66 |
| 1.793 | 1.819 |
| 1.794 | 2.006 |
| 1.795 | 2.238 |
| 1.796 | 2.5 |
| 1.797 | 2.786 |
| 1.798 | 3.089 |
| 1.799 | 3.393 |
| 1.8 | 3.688 |
| 1.801 | 3.963 |
| 1.802 | 4.221 |
| 1.803 | 4.478 |
| 1.804 | 4.729 |
| 1.805 | 4.979 |
| 1.806 | 5.238 |
| 1.807 | 5.499 |
| 1.808 | 5.758 |
| 1.809 | 6.033 |
| 1.81 | 6.332 |
| 1.811 | 6.638 |
| 1.812 | 6.944 |
| 1.813 | 7.254 |
| 1.814 | 7.565 |
| 1.815 | 7.9 |
| 1.816 | 8.246 |
| 1.817 | 8.589 |
| 1.818 | 8.94 |
| 1.819 | 9.299 |
| 1.82 | 9.724 |
| 1.821 | 10.166 |
| 1.822 | 10.564 |
| 1.823 | 10.975 |
| 1.824 | 11.41 |
| 1.825 | 11.859 |
| 1.826 | 12.379 |
| 1.827 | 12.915 |
| 1.828 | 13.403 |
| 1.829 | 13.89 |
| 1.83 | 14.43 |
| 1.831 | 14.971 |
| 1.832 | 15.502 |
| 1.833 | 16.033 |
| 1.834 | 16.551 |
| 1.835 | 17.114 |
| 1.836 | 17.739 |
| 1.837 | 18.386 |
| 1.838 | 19.02 |
| 1.839 | 19.644 |
| 1.84 | 20.325 |
| 1.841 | 21.052 |
| 1.842 | 21.727 |
| 1.843 | 22.305 |
| 1.844 | 22.876 |
| 1.845 | 23.479 |
| 1.846 | 24.123 |
| 1.847 | 24.862 |
| 1.848 | 25.634 |
| 1.849 | 26.336 |
| 1.85 | 26.907 |
| 1.851 | 27.477 |
| 1.852 | 28.128 |
| 1.853 | 28.787 |
| 1.854 | 29.416 |
| 1.855 | 30.013 |
| 1.856 | 30.603 |
| 1.857 | 31.21 |
| 1.858 | 31.829 |
| 1.859 | 32.491 |
| 1.86 | 33.205 |
| 1.861 | 33.915 |
| 1.862 | 34.576 |
| 1.863 | 35.165 |
| 1.864 | 35.731 |
| 1.865 | 36.345 |
| 1.866 | 37.019 |
| 1.867 | 37.679 |
| 1.868 | 38.367 |
| 1.869 | 39.101 |
| 1.87 | 39.867 |
| 1.871 | 40.595 |
| 1.872 | 41.338 |
| 1.873 | 42.105 |
| 1.874 | 42.825 |
| 1.875 | 43.52 |
| 1.876 | 44.215 |
| 1.877 | 44.92 |
| 1.878 | 45.619 |
| 1.879 | 46.266 |
| 1.88 | 46.912 |
| 1.881 | 47.562 |
| 1.882 | 48.232 |
| 1.883 | 48.887 |
| 1.884 | 49.563 |
| 1.885 | 50.212 |
| 1.886 | 50.836 |
| 1.887 | 51.422 |
| 1.888 | 51.992 |
| 1.889 | 52.577 |
| 1.89 | 53.159 |
| 1.891 | 53.752 |
| 1.892 | 54.392 |
| 1.893 | 54.947 |
| 1.894 | 55.454 |
| 1.895 | 55.918 |
| 1.896 | 56.365 |
| 1.897 | 56.811 |
| 1.898 | 57.29 |
| 1.899 | 57.73 |
| 1.9 | 58.214 |
| 1.901 | 58.666 |
| 1.902 | 59.074 |
| 1.903 | 59.485 |
| 1.904 | 59.958 |
| 1.905 | 60.46 |
| 1.906 | 60.944 |
| 1.907 | 61.371 |
| 1.908 | 61.794 |
| 1.909 | 62.187 |
| 1.91 | 62.586 |
| 1.911 | 63.031 |
| 1.912 | 63.542 |
| 1.913 | 63.991 |
| 1.914 | 64.476 |
| 1.915 | 64.937 |
| 1.916 | 65.35 |
| 1.917 | 65.756 |
| 1.918 | 66.163 |
| 1.919 | 66.652 |
| 1.92 | 67.126 |
| 1.921 | 67.615 |
| 1.922 | 68.112 |
| 1.923 | 68.591 |
| 1.924 | 69.037 |
| 1.925 | 69.441 |
| 1.926 | 69.91 |
| 1.927 | 70.381 |
| 1.928 | 70.832 |
| 1.929 | 71.313 |
| 1.93 | 71.78 |
| 1.931 | 72.236 |
| 1.932 | 72.696 |
| 1.933 | 73.16 |
| 1.934 | 73.639 |
| 1.935 | 74.092 |
| 1.936 | 74.586 |
| 1.937 | 75.028 |
| 1.938 | 75.539 |
| 1.939 | 76.055 |
| 1.94 | 76.523 |
| 1.941 | 77.049 |
| 1.942 | 77.554 |
| 1.943 | 78.042 |
| 1.944 | 78.561 |
| 1.945 | 79.089 |
| 1.946 | 79.673 |
| 1.947 | 80.256 |
| 1.948 | 80.844 |
| 1.949 | 81.424 |
| 1.95 | 82.085 |
| 1.951 | 82.807 |
| 1.952 | 83.605 |
| 1.953 | 84.373 |
| 1.954 | 85.137 |
| 1.955 | 85.786 |
| 1.956 | 86.392 |
| 1.957 | 86.759 |
| 1.958 | 87.087 |
| 1.959 | 87.301 |
| 1.96 | 87.494 |
| 1.961 | 87.632 |
| 1.962 | 87.77 |
| 1.963 | 87.911 |
| 1.964 | 88.038 |
| 1.965 | 88.13 |
| 1.966 | 88.217 |
| 1.967 | 88.322 |
| 1.968 | 88.387 |
| 1.969 | 88.459 |
| 1.97 | 88.531 |
| 1.971 | 88.625 |
| 1.972 | 88.694 |
| 1.973 | 88.763 |
| 1.974 | 88.883 |
| 1.975 | 88.955 |
| 1.976 | 89.028 |
| 1.977 | 89.1 |
| 1.978 | 89.179 |
| 1.979 | 89.274 |
| 1.98 | 89.333 |
| 1.981 | 89.373 |
| 1.982 | 89.435 |
| 1.983 | 89.465 |
| 1.984 | 89.48 |
| 1.985 | 89.477 |
| 1.986 | 89.484 |
| 1.987 | 89.505 |
| 1.988 | 89.486 |
| 1.989 | 89.505 |
| 1.99 | 89.504 |
| 1.991 | 89.493 |
| 1.992 | 89.493 |
| 1.993 | 89.502 |
| 1.994 | 89.491 |
| 1.995 | 89.514 |
| 1.996 | 89.472 |
| 1.997 | 89.519 |
| 1.998 | 89.477 |
| 1.999 | 89.485 |
| 2.0 | 89.49 |
| 2.0014000000000003 | 89.489 |
| 2.00333 | 89.479 |
| 2.00526 | 89.467 |
| 2.00719 | 89.44 |
| 2.00912 | 89.434 |
| 2.01105 | 89.414 |
| 2.01298 | 89.375 |
| 2.01491 | 89.383 |
| 2.0168399999999997 | 89.362 |
| 2.01877 | 89.342 |
| 2.0207 | 89.338 |
| 2.02263 | 89.309 |
| 2.02456 | 89.298 |
| 2.02649 | 89.265 |
| 2.02842 | 89.261 |
| 2.03035 | 89.243 |
| 2.03228 | 89.21 |
| 2.03421 | 89.224 |
| 2.03614 | 89.206 |
| 2.03807 | 89.181 |
| 2.04 | 89.157 |
| 2.0419300000000002 | 89.133 |
| 2.04386 | 89.136 |
| 2.0457899999999998 | 89.126 |
| 2.04772 | 89.106 |
| 2.04965 | 89.109 |
| 2.05158 | 89.077 |
| 2.05351 | 89.093 |
| 2.05544 | 89.067 |
| 2.0573699999999997 | 89.03 |
| 2.0593000000000004 | 89.014 |
| 2.06123 | 89.024 |
| 2.06316 | 89.009 |
| 2.06509 | 88.999 |
| 2.06702 | 89.003 |
| 2.0689499999999996 | 88.989 |
| 2.0708800000000003 | 88.993 |
| 2.0728 | 88.975 |
| 2.07473 | 88.971 |
| 2.07666 | 88.981 |
| 2.07859 | 88.952 |
| 2.08052 | 88.968 |
| 2.0824499999999997 | 88.944 |
| 2.08438 | 88.941 |
| 2.08631 | 88.941 |
| 2.08824 | 88.932 |
| 2.09017 | 88.938 |
| 2.0921 | 88.937 |
| 2.09403 | 88.897 |
| 2.09596 | 88.923 |
| 2.09789 | 88.93 |
| 2.0998200000000002 | 88.903 |
| 2.10175 | 88.91 |
| 2.1036799999999998 | 88.927 |
| 2.10561 | 88.914 |
| 2.1075399999999997 | 88.912 |
| 2.10947 | 88.887 |
| 2.1114 | 88.897 |
| 2.11333 | 88.915 |
| 2.11526 | 88.909 |
| 2.11719 | 88.915 |
| 2.1191199999999997 | 88.903 |
| 2.1210500000000003 | 88.915 |
| 2.12298 | 88.915 |
| 2.12491 | 88.938 |
| 2.12684 | 88.909 |
| 2.12877 | 88.941 |
| 2.1307 | 88.97 |
| 2.1326300000000002 | 88.968 |
| 2.13456 | 88.984 |
| 2.13649 | 88.978 |
| 2.13842 | 88.973 |
| 2.1403499999999998 | 88.997 |
| 2.1422800000000004 | 88.991 |
| 2.14421 | 88.989 |
| 2.14614 | 89.013 |
| 2.14807 | 89.034 |
| 2.15 | 89.048 |
| 2.1519299999999997 | 89.042 |
| 2.1538600000000003 | 89.052 |
| 2.15579 | 89.073 |
| 2.15772 | 89.086 |
| 2.15965 | 89.105 |
| 2.16158 | 89.093 |
| 2.16351 | 89.139 |
| 2.1654400000000003 | 89.137 |
| 2.16737 | 89.164 |
| 2.1693000000000002 | 89.167 |
| 2.17123 | 89.197 |
| 2.1731599999999998 | 89.213 |
| 2.17509 | 89.234 |
| 2.17702 | 89.236 |
| 2.17895 | 89.258 |
| 2.18088 | 89.272 |
| 2.18281 | 89.284 |
| 2.1847399999999997 | 89.294 |
| 2.18667 | 89.31 |
| 2.1886 | 89.343 |
| 2.1905300000000003 | 89.353 |
| 2.19246 | 89.372 |
| 2.19439 | 89.397 |
| 2.19632 | 89.416 |
| 2.19825 | 89.426 |
| 2.20018 | 89.455 |
| 2.2021100000000002 | 89.461 |
| 2.20404 | 89.467 |
| 2.2059699999999998 | 89.491 |
| 2.2079 | 89.533 |
| 2.2098299999999997 | 89.539 |
| 2.2117600000000004 | 89.549 |
| 2.21369 | 89.574 |
| 2.21562 | 89.604 |
| 2.21755 | 89.623 |
| 2.21948 | 89.642 |
| 2.2214099999999997 | 89.67 |
| 2.2233400000000003 | 89.681 |
| 2.22527 | 89.695 |
| 2.2272 | 89.735 |
| 2.22913 | 89.761 |
| 2.23106 | 89.788 |
| 2.2329899999999996 | 89.799 |
| 2.2349200000000002 | 89.805 |
| 2.23685 | 89.847 |
| 2.23878 | 89.863 |
| 2.24071 | 89.884 |
| 2.2426399999999997 | 89.919 |
| 2.24457 | 89.906 |
| 2.2465 | 89.941 |
| 2.24843 | 89.965 |
| 2.25036 | 89.98 |
| 2.25229 | 90.018 |
| 2.2542199999999997 | 90.037 |
| 2.25615 | 90.056 |
| 2.25808 | 90.071 |
| 2.2600100000000003 | 90.109 |
| 2.26194 | 90.136 |
| 2.26387 | 90.155 |
| 2.2658 | 90.168 |
| 2.26773 | 90.185 |
| 2.26966 | 90.212 |
| 2.27159 | 90.229 |
| 2.27352 | 90.263 |
| 2.2754499999999998 | 90.284 |
| 2.27738 | 90.319 |
| 2.2793099999999997 | 90.341 |
| 2.28124 | 90.371 |
| 2.28317 | 90.371 |
| 2.2851 | 90.403 |
| 2.28703 | 90.44 |
| 2.28896 | 90.432 |
| 2.29089 | 90.479 |
| 2.2928200000000003 | 90.505 |
| 2.29475 | 90.52 |
| 2.29668 | 90.532 |
| 2.29861 | 90.55 |
| 2.30054 | 90.583 |
| 2.30247 | 90.626 |
| 2.3044000000000002 | 90.637 |
| 2.30633 | 90.66 |
| 2.30826 | 90.673 |
| 2.31019 | 90.699 |
| 2.3121199999999997 | 90.745 |
| 2.3140500000000004 | 90.761 |
| 2.31598 | 90.779 |
| 2.31791 | 90.811 |
| 2.31984 | 90.824 |
| 2.32177 | 90.827 |
| 2.3236999999999997 | 90.861 |
| 2.3256300000000003 | 90.908 |
| 2.32756 | 90.93 |
| 2.32949 | 90.945 |
| 2.33142 | 90.979 |
| 2.33335 | 90.989 |
| 2.33528 | 91.002 |
| 2.3372100000000002 | 91.042 |
| 2.33914 | 91.036 |
| 2.34107 | 91.07 |
| 2.343 | 91.085 |
| 2.3449299999999997 | 91.121 |
| 2.34686 | 91.133 |
| 2.34879 | 91.167 |
| 2.35072 | 91.185 |
| 2.35265 | 91.199 |
| 2.35458 | 91.243 |
| 2.35651 | 91.259 |
| 2.35844 | 91.287 |
| 2.36037 | 91.311 |
| 2.3623000000000003 | 91.331 |
| 2.36423 | 91.353 |
| 2.36616 | 91.369 |
| 2.36809 | 91.385 |
| 2.37002 | 91.412 |
| 2.37195 | 91.435 |
| 2.37388 | 91.44 |
| 2.37581 | 91.479 |
| 2.3777399999999997 | 91.492 |
| 2.37967 | 91.521 |
| 2.3815999999999997 | 91.547 |
| 2.3835300000000004 | 91.563 |
| 2.38546 | 91.573 |
| 2.38739 | 91.612 |
| 2.38932 | 91.623 |
| 2.39125 | 91.635 |
| 2.3931799999999996 | 91.672 |
| 2.3951100000000003 | 91.687 |
| 2.39704 | 91.734 |
| 2.39897 | 91.74 |
| 2.4009 | 91.758 |
| 2.40283 | 91.79 |
| 2.40476 | 91.807 |
| 2.40669 | 91.814 |
| 2.40862 | 91.832 |
| 2.41055 | 91.855 |
| 2.41248 | 91.884 |
| 2.4144099999999997 | 91.887 |
| 2.41634 | 91.905 |
| 2.41827 | 91.923 |
| 2.4202 | 91.943 |
| 2.42213 | 91.964 |
| 2.42406 | 91.968 |
| 2.4259899999999996 | 92.004 |
| 2.42792 | 92.044 |
| 2.42985 | 92.061 |
| 2.4317800000000003 | 92.078 |
| 2.43371 | 92.103 |
| 2.43564 | 92.122 |
| 2.43757 | 92.141 |
| 2.4395 | 92.155 |
| 2.44143 | 92.159 |
| 2.44336 | 92.185 |
| 2.44529 | 92.198 |
| 2.4472199999999997 | 92.224 |
| 2.44915 | 92.237 |
| 2.45108 | 92.262 |
| 2.4530100000000004 | 92.286 |
| 2.45494 | 92.297 |
| 2.45687 | 92.306 |
| 2.4588 | 92.321 |
| 2.46073 | 92.334 |
| 2.46266 | 92.35 |
| 2.4645900000000003 | 92.381 |
| 2.46652 | 92.401 |
| 2.46845 | 92.41 |
| 2.47038 | 92.43 |
| 2.47231 | 92.438 |
| 2.47424 | 92.473 |
| 2.47617 | 92.478 |
| 2.4781 | 92.5 |
| 2.48003 | 92.515 |
| 2.48196 | 92.529 |
| 2.4838899999999997 | 92.548 |
| 2.4858200000000004 | 92.581 |
| 2.48775 | 92.585 |
| 2.48968 | 92.588 |
| 2.49161 | 92.608 |
| 2.49354 | 92.628 |
| 2.4954699999999996 | 92.649 |
| 2.4974000000000003 | 92.659 |
| 2.49933 | 92.671 |
| 2.5012600000000003 | 92.697 |
| 2.50319 | 92.708 |
| 2.50512 | 92.722 |
| 2.50705 | 92.745 |
| 2.50898 | 92.756 |
| 2.51091 | 92.775 |
| 2.51284 | 92.791 |
| 2.51477 | 92.791 |
| 2.5166999999999997 | 92.823 |
| 2.51863 | 92.843 |
| 2.52056 | 92.854 |
| 2.52249 | 92.846 |
| 2.52442 | 92.876 |
| 2.52635 | 92.9 |
| 2.52828 | 92.894 |
| 2.53021 | 92.911 |
| 2.53214 | 92.936 |
| 2.5340700000000003 | 92.981 |
| 2.536 | 92.944 |
| 2.53793 | 93.013 |
| 2.53986 | 93 |
| 2.5417899999999998 | 92.977 |
| 2.54372 | 93.056 |
| 2.54565 | 93.071 |
| 2.54758 | 93.021 |
| 2.54951 | 93.104 |
| 2.55144 | 93.072 |
| 2.5533699999999997 | 93.127 |
| 2.5553000000000003 | 93.119 |
| 2.55723 | 93.095 |
| 2.55916 | 93.089 |
| 2.56109 | 93.147 |
| 2.56302 | 93.258 |
| 2.5649499999999996 | 93.275 |
| 2.5668800000000003 | 93.213 |
| 2.56881 | 93.14 |
| 2.57074 | 93.303 |
| 2.57267 | 93.151 |
| 2.5745999999999998 | 93.354 |
| 2.57653 | 93.232 |
| 2.57846 | 93.374 |
| 2.58039 | 93.199 |
| 2.58232 | 93.382 |
| 2.58425 | 93.377 |
| 2.5861799999999997 | 93.385 |
| 2.58811 | 93.441 |
| 2.59004 | 93.432 |
| 2.59197 | 93.325 |
| 2.5939 | 93.264 |
| 2.59583 | 93.636 |
| 2.59776 | 93.532 |
| 2.59969 | 93.388 |
| 2.60162 | 93.369 |
| 2.6035500000000003 | 93.438 |
| 2.60548 | 93.53 |
| 2.60741 | 93.584 |
| 2.60934 | 93.483 |
| 2.61127 | 93.511 |
| 2.6132 | 93.457 |
| 2.61513 | 93.479 |
| 2.61706 | 93.483 |
| 2.6189899999999997 | 93.617 |
| 2.62092 | 93.565 |
| 2.62285 | 93.558 |
| 2.6247800000000003 | 93.475 |
| 2.62671 | 93.48 |
| 2.62864 | 93.592 |
| 2.63057 | 93.593 |
| 2.6325 | 93.702 |
| 2.63443 | 93.628 |
| 2.6363600000000003 | 93.574 |
| 2.63829 | 93.542 |
| 2.64022 | 93.543 |
| 2.64215 | 93.576 |
| 2.6440799999999998 | 93.594 |
| 2.6460100000000004 | 93.596 |
| 2.64794 | 93.636 |
| 2.64987 | 93.561 |
| 2.6518 | 93.544 |
| 2.65373 | 93.719 |
| 2.6556599999999997 | 93.637 |
| 2.6575900000000003 | 93.667 |
| 2.65952 | 93.61 |
| 2.66145 | 93.752 |
| 2.66338 | 93.698 |
| 2.66531 | 93.675 |
| 2.6672399999999996 | 93.909 |
| 2.6691700000000003 | 93.785 |
| 2.6711 | 93.858 |
| 2.6730300000000002 | 93.827 |
| 2.67496 | 93.726 |
| 2.6768899999999998 | 93.802 |
| 2.67882 | 93.955 |
| 2.68075 | 93.888 |
| 2.68268 | 93.703 |
| 2.68461 | 93.808 |
| 2.68654 | 93.783 |
| 2.6884699999999997 | 93.779 |
| 2.6904 | 93.74 |
| 2.69233 | 93.667 |
| 2.6942600000000003 | 93.787 |
| 2.69619 | 93.874 |
| 2.69812 | 93.762 |
| 2.70005 | 93.676 |
| 2.70198 | 93.717 |
| 2.70391 | 93.682 |
| 2.7058400000000002 | 93.642 |
| 2.70777 | 93.623 |
| 2.7096999999999998 | 93.673 |
| 2.71163 | 93.787 |
| 2.7135599999999998 | 93.67 |
| 2.71549 | 93.581 |
| 2.71742 | 93.535 |
| 2.71935 | 93.528 |
| 2.72128 | 93.734 |
| 2.72321 | 93.593 |
| 2.7251399999999997 | 93.615 |
| 2.7270700000000003 | 93.577 |
| 2.729 | 93.398 |
| 2.73093 | 93.349 |
| 2.73286 | 93.305 |
| 2.73479 | 93.239 |
| 2.7367199999999996 | 93.323 |
| 2.7386500000000003 | 93.105 |
| 2.74058 | 93.368 |
| 2.7425100000000002 | 93.326 |
| 2.74444 | 93.061 |
| 2.7463699999999998 | 92.931 |
| 2.7483 | 92.831 |
| 2.75023 | 92.761 |
| 2.75216 | 92.688 |
| 2.75409 | 92.569 |
| 2.75602 | 92.643 |
| 2.7579499999999997 | 92.539 |
| 2.75988 | 92.292 |
| 2.76181 | 92.139 |
| 2.76374 | 92.122 |
| 2.76567 | 91.959 |
| 2.7676 | 91.779 |
| 2.76953 | 91.691 |
| 2.7714600000000003 | 91.574 |
| 2.77339 | 91.509 |
| 2.7753200000000002 | 91.304 |
| 2.77725 | 91.225 |
| 2.7791799999999998 | 91.144 |
| 2.78111 | 90.986 |
| 2.78304 | 90.898 |
| 2.78497 | 90.724 |
| 2.7869 | 90.603 |
| 2.78883 | 90.615 |
| 2.79076 | 90.385 |
| 2.79269 | 90.234 |
| 2.79462 | 90.131 |
| 2.7965500000000003 | 90.034 |
| 2.79848 | 89.931 |
| 2.80041 | 89.811 |
| 2.80234 | 89.689 |
| 2.80427 | 89.793 |
| 2.8062 | 89.643 |
| 2.8081300000000002 | 89.471 |
| 2.81006 | 89.375 |
| 2.8119899999999998 | 89.273 |
| 2.81392 | 89.19 |
| 2.8158499999999997 | 89.155 |
| 2.8177800000000004 | 89.034 |
| 2.81971 | 88.971 |
| 2.82164 | 88.955 |
| 2.82357 | 88.853 |
| 2.8255 | 88.764 |
| 2.8274299999999997 | 88.692 |
| 2.8293600000000003 | 88.656 |
| 2.83129 | 88.581 |
| 2.83322 | 88.553 |
| 2.83515 | 88.523 |
| 2.83708 | 88.457 |
| 2.83901 | 88.42 |
| 2.8409400000000002 | 88.356 |
| 2.84287 | 88.298 |
| 2.8448 | 88.247 |
| 2.84673 | 88.201 |
| 2.8486599999999997 | 88.171 |
| 2.85059 | 88.179 |
| 2.85252 | 88.124 |
| 2.85445 | 88.103 |
| 2.85638 | 88.086 |
| 2.85831 | 88.032 |
| 2.8602399999999997 | 88.022 |
| 2.86217 | 88.027 |
| 2.8641 | 87.995 |
| 2.8660300000000003 | 87.972 |
| 2.86796 | 87.96 |
| 2.86989 | 87.939 |
| 2.87182 | 87.93 |
| 2.87375 | 87.933 |
| 2.87568 | 87.899 |
| 2.8776100000000002 | 87.894 |
| 2.87954 | 87.887 |
| 2.8814699999999998 | 87.875 |
| 2.8834 | 87.856 |
| 2.8853299999999997 | 87.852 |
| 2.8872600000000004 | 87.849 |
| 2.88919 | 87.855 |
| 2.89112 | 87.842 |
| 2.89305 | 87.833 |
| 2.89498 | 87.83 |
| 2.8969099999999997 | 87.826 |
| 2.8988400000000003 | 87.826 |
| 2.90077 | 87.834 |
| 2.9027 | 87.848 |
| 2.90463 | 87.828 |
| 2.90656 | 87.853 |
| 2.9084899999999996 | 87.823 |
| 2.9104200000000002 | 87.818 |
| 2.91235 | 87.831 |
| 2.91428 | 87.848 |
| 2.91621 | 87.855 |
| 2.9181399999999997 | 87.857 |
| 2.92007 | 87.867 |
| 2.922 | 87.888 |
| 2.92393 | 87.91 |
| 2.92586 | 87.922 |
| 2.92779 | 87.927 |
| 2.9297199999999997 | 87.933 |
| 2.9316500000000003 | 87.95 |
| 2.93358 | 87.965 |
| 2.9355100000000003 | 87.988 |
| 2.93744 | 88.006 |
| 2.93937 | 88.013 |
| 2.9413 | 88.034 |
| 2.9432300000000002 | 88.058 |
| 2.94516 | 88.084 |
| 2.94709 | 88.098 |
| 2.94902 | 88.13 |
| 2.9509499999999997 | 88.143 |
| 2.95288 | 88.165 |
| 2.95481 | 88.206 |
| 2.95674 | 88.242 |
| 2.95867 | 88.261 |
| 2.9606 | 88.288 |
| 2.96253 | 88.299 |
| 2.96446 | 88.335 |
| 2.96639 | 88.364 |
| 2.9683200000000003 | 88.383 |
| 2.97025 | 88.412 |
| 2.97218 | 88.45 |
| 2.97411 | 88.487 |
| 2.97604 | 88.518 |
| 2.97797 | 88.546 |
| 2.9799 | 88.581 |
| 2.98183 | 88.61 |
| 2.98376 | 88.647 |
| 2.98569 | 88.675 |
| 2.9876199999999997 | 88.71 |
| 2.9895500000000004 | 88.742 |
| 2.99148 | 88.764 |
| 2.99341 | 88.79 |
| 2.99534 | 88.821 |
| 2.99727 | 88.866 |
| 2.9991999999999996 | 88.913 |
| 3.0011300000000003 | 88.928 |
| 3.00306 | 88.956 |
| 3.00499 | 88.992 |
| 3.00692 | 89.029 |
| 3.00885 | 89.06 |
| 3.01078 | 89.083 |
| 3.01271 | 89.111 |
| 3.01464 | 89.15 |
| 3.01657 | 89.184 |
| 3.0185 | 89.22 |
| 3.0204299999999997 | 89.248 |
| 3.02236 | 89.282 |
| 3.02429 | 89.311 |
| 3.02622 | 89.324 |
| 3.02815 | 89.357 |
| 3.03008 | 89.395 |
| 3.03201 | 89.423 |
| 3.03394 | 89.448 |
| 3.03587 | 89.479 |
| 3.0378000000000003 | 89.513 |
| 3.03973 | 89.538 |
| 3.04166 | 89.563 |
| 3.04359 | 89.605 |
| 3.04552 | 89.638 |
| 3.04745 | 89.659 |
| 3.04938 | 89.684 |
| 3.05131 | 89.705 |
| 3.0532399999999997 | 89.732 |
| 3.05517 | 89.752 |
| 3.0570999999999997 | 89.772 |
| 3.0590300000000004 | 89.794 |
| 3.06096 | 89.82 |
| 3.06289 | 89.849 |
| 3.06482 | 89.872 |
| 3.06675 | 89.899 |
| 3.0686799999999996 | 89.927 |
| 3.0706100000000003 | 89.941 |
| 3.07254 | 89.955 |
| 3.07447 | 89.985 |
| 3.0764 | 90.009 |
| 3.07833 | 90.027 |
| 3.08026 | 90.051 |
| 3.08219 | 90.08 |
| 3.08412 | 90.096 |
| 3.08605 | 90.12 |
| 3.08798 | 90.141 |
| 3.0899099999999997 | 90.159 |
| 3.0918400000000004 | 90.177 |
| 3.09377 | 90.196 |
| 3.0957 | 90.242 |
| 3.09763 | 90.276 |
| 3.09956 | 90.297 |
| 3.1014899999999996 | 90.328 |
| 3.1034200000000003 | 90.351 |
| 3.10535 | 90.371 |
| 3.1072800000000003 | 90.403 |
| 3.10921 | 90.433 |
| 3.11114 | 90.459 |
| 3.11307 | 90.479 |
| 3.115 | 90.504 |
| 3.11693 | 90.543 |
| 3.11886 | 90.561 |
| 3.12079 | 90.587 |
| 3.1227199999999997 | 90.627 |
| 3.12465 | 90.669 |
| 3.12658 | 90.711 |
| 3.1285100000000003 | 90.741 |
| 3.13044 | 90.754 |
| 3.13237 | 90.793 |
| 3.1343 | 90.827 |
| 3.13623 | 90.858 |
| 3.13816 | 90.89 |
| 3.1400900000000003 | 90.919 |
| 3.14202 | 90.947 |
| 3.14395 | 90.979 |
| 3.14588 | 91.01 |
| 3.1478099999999998 | 91.043 |
| 3.14974 | 91.068 |
| 3.15167 | 91.097 |
| 3.1536 | 91.126 |
| 3.15553 | 91.16 |
| 3.15746 | 91.193 |
| 3.1593899999999997 | 91.221 |
| 3.1613200000000004 | 91.252 |
| 3.16325 | 91.294 |
| 3.16518 | 91.325 |
| 3.16711 | 91.353 |
| 3.16904 | 91.377 |
| 3.1709699999999996 | 91.399 |
| 3.1729000000000003 | 91.419 |
| 3.17483 | 91.459 |
| 3.1767600000000003 | 91.497 |
| 3.17869 | 91.534 |
| 3.18062 | 91.567 |
| 3.18255 | 91.587 |
| 3.18448 | 91.608 |
| 3.18641 | 91.638 |
| 3.18834 | 91.669 |
| 3.19027 | 91.704 |
| 3.1921999999999997 | 91.744 |
| 3.19413 | 91.772 |
| 3.19606 | 91.779 |
| 3.19799 | 91.811 |
| 3.19992 | 91.847 |
| 3.20185 | 91.877 |
| 3.20378 | 91.901 |
| 3.20571 | 91.913 |
| 3.20764 | 91.946 |
| 3.2095700000000003 | 91.976 |
| 3.2115 | 91.997 |
| 3.21343 | 92.02 |
| 3.21536 | 92.048 |
| 3.2172899999999998 | 92.067 |
| 3.21922 | 92.093 |
| 3.22115 | 92.115 |
| 3.22308 | 92.137 |
| 3.22501 | 92.172 |
| 3.22694 | 92.194 |
| 3.2288699999999997 | 92.214 |
| 3.2308000000000003 | 92.247 |
| 3.23273 | 92.263 |
| 3.23466 | 92.279 |
| 3.23659 | 92.306 |
| 3.23852 | 92.332 |
| 3.2404499999999996 | 92.349 |
| 3.2423800000000003 | 92.361 |
| 3.24431 | 92.387 |
| 3.24624 | 92.422 |
| 3.24817 | 92.444 |
| 3.2500999999999998 | 92.463 |
| 3.2520300000000004 | 92.479 |
| 3.25396 | 92.501 |
| 3.25589 | 92.533 |
| 3.25782 | 92.559 |
| 3.25975 | 92.585 |
| 3.2616799999999997 | 92.612 |
| 3.2636100000000003 | 92.641 |
| 3.26554 | 92.665 |
| 3.26747 | 92.686 |
| 3.2694 | 92.705 |
| 3.27133 | 92.716 |
| 3.27326 | 92.746 |
| 3.2751900000000003 | 92.765 |
| 3.27712 | 92.785 |
| 3.2790500000000002 | 92.804 |
| 3.28098 | 92.824 |
| 3.2829099999999998 | 92.841 |
| 3.28484 | 92.858 |
| 3.28677 | 92.874 |
| 3.2887 | 92.895 |
| 3.29063 | 92.917 |
| 3.29256 | 92.936 |
| 3.2944899999999997 | 92.959 |
| 3.29642 | 92.984 |
| 3.29835 | 93.002 |
| 3.3002800000000003 | 93.028 |
| 3.30221 | 93.042 |
| 3.30414 | 93.055 |
| 3.30607 | 93.066 |
| 3.308 | 93.08 |
| 3.30993 | 93.104 |
| 3.3118600000000002 | 93.122 |
| 3.31379 | 93.132 |
| 3.31572 | 93.152 |
| 3.31765 | 93.176 |
| 3.3195799999999998 | 93.195 |
| 3.3215100000000004 | 93.208 |
| 3.32344 | 93.22 |
| 3.32537 | 93.24 |
| 3.3273 | 93.267 |
| 3.32923 | 93.289 |
| 3.3311599999999997 | 93.291 |
| 3.3330900000000003 | 93.297 |
| 3.33502 | 93.314 |
| 3.33695 | 93.328 |
| 3.33888 | 93.347 |
| 3.34081 | 93.36 |
| 3.3427399999999996 | 93.363 |
| 3.3446700000000003 | 93.369 |
| 3.3466 | 93.383 |
| 3.3485300000000002 | 93.398 |
| 3.35046 | 93.404 |
| 3.3523899999999998 | 93.409 |
| 3.35432 | 93.421 |
| 3.35625 | 93.448 |
| 3.35818 | 93.465 |
| 3.36011 | 93.477 |
| 3.36204 | 93.486 |
| 3.3639699999999997 | 93.488 |
| 3.3659 | 93.491 |
| 3.36783 | 93.499 |
| 3.3697600000000003 | 93.512 |
| 3.37169 | 93.524 |
| 3.37362 | 93.533 |
| 3.37555 | 93.546 |
| 3.37748 | 93.564 |
| 3.37941 | 93.579 |
| 3.3813400000000002 | 93.59 |
| 3.38327 | 93.615 |
| 3.3851999999999998 | 93.638 |
| 3.38713 | 93.653 |
| 3.3890599999999997 | 93.667 |
| 3.39099 | 93.683 |
| 3.39292 | 93.694 |
| 3.39485 | 93.699 |
| 3.39678 | 93.703 |
| 3.39871 | 93.71 |
| 3.4006399999999997 | 93.715 |
| 3.4025700000000003 | 93.719 |
| 3.4045 | 93.718 |
| 3.40643 | 93.711 |
| 3.40836 | 93.71 |
| 3.41029 | 93.713 |
| 3.4122199999999996 | 93.722 |
| 3.4141500000000002 | 93.726 |
| 3.41608 | 93.726 |
| 3.41801 | 93.732 |
| 3.41994 | 93.754 |
| 3.4218699999999997 | 93.776 |
| 3.4238000000000004 | 93.798 |
| 3.42573 | 93.825 |
| 3.42766 | 93.851 |
| 3.42959 | 93.879 |
| 3.43152 | 93.905 |
| 3.4334499999999997 | 93.928 |
| 3.4353800000000003 | 93.957 |
| 3.43731 | 93.991 |
| 3.43924 | 94.013 |
| 3.44117 | 94.029 |
| 3.4431 | 94.048 |
| 3.44503 | 94.059 |
| 3.4469600000000002 | 94.07 |
| 3.44889 | 94.094 |
| 3.45082 | 94.112 |
| 3.45275 | 94.124 |
| 3.45467 | 94.141 |
| 3.4566 | 94.153 |
| 3.45853 | 94.166 |
| 3.46046 | 94.178 |
| 3.46239 | 94.194 |
| 3.4643200000000003 | 94.215 |
| 3.46625 | 94.225 |
| 3.46818 | 94.233 |
| 3.47011 | 94.244 |
| 3.47204 | 94.248 |
| 3.47397 | 94.251 |
| 3.4759 | 94.256 |
| 3.47783 | 94.264 |
| 3.47976 | 94.27 |
| 3.48169 | 94.271 |
| 3.4836199999999997 | 94.281 |
| 3.4855500000000004 | 94.296 |
| 3.48748 | 94.303 |
| 3.48941 | 94.312 |
| 3.49134 | 94.323 |
| 3.49327 | 94.321 |
| 3.4951999999999996 | 94.309 |
| 3.4971300000000003 | 94.311 |
| 3.49906 | 94.324 |
| 3.50099 | 94.335 |
| 3.50292 | 94.349 |
| 3.50485 | 94.362 |
| 3.50678 | 94.375 |
| 3.50871 | 94.398 |
| 3.51064 | 94.426 |
| 3.51257 | 94.441 |
| 3.5145 | 94.457 |
| 3.5164299999999997 | 94.483 |
| 3.51836 | 94.509 |
| 3.52029 | 94.526 |
| 3.52222 | 94.537 |
| 3.52415 | 94.553 |
| 3.52608 | 94.573 |
| 3.52801 | 94.587 |
| 3.52994 | 94.595 |
| 3.53187 | 94.6 |
| 3.5338000000000003 | 94.612 |
| 3.53573 | 94.629 |
| 3.53766 | 94.643 |
| 3.53959 | 94.654 |
| 3.54152 | 94.657 |
| 3.54345 | 94.667 |
| 3.54538 | 94.691 |
| 3.54731 | 94.704 |
| 3.5492399999999997 | 94.701 |
| 3.55117 | 94.71 |
| 3.5530999999999997 | 94.728 |
| 3.5550300000000004 | 94.739 |
| 3.55696 | 94.748 |
| 3.55889 | 94.756 |
| 3.56082 | 94.764 |
| 3.56275 | 94.775 |
| 3.5646799999999996 | 94.781 |
| 3.5666100000000003 | 94.785 |
| 3.56854 | 94.793 |
| 3.57047 | 94.803 |
| 3.5724 | 94.809 |
| 3.57433 | 94.819 |
| 3.5762600000000004 | 94.836 |
| 3.57819 | 94.845 |
| 3.58012 | 94.848 |
| 3.58205 | 94.85 |
| 3.58398 | 94.855 |
| 3.5859099999999997 | 94.869 |
| 3.5878400000000004 | 94.883 |
| 3.58977 | 94.889 |
| 3.5917 | 94.893 |
| 3.59363 | 94.903 |
| 3.59556 | 94.907 |
| 3.5974899999999996 | 94.909 |
| 3.5994200000000003 | 94.919 |
| 3.60135 | 94.926 |
| 3.6032800000000003 | 94.932 |
| 3.60521 | 94.94 |
| 3.60714 | 94.955 |
| 3.60907 | 94.967 |
| 3.611 | 94.972 |
| 3.61293 | 94.973 |
| 3.61486 | 94.977 |
| 3.61679 | 94.986 |
| 3.6187199999999997 | 94.996 |
| 3.62065 | 95.009 |
| 3.62258 | 95.024 |
| 3.6245100000000003 | 95.031 |
| 3.62644 | 95.036 |
| 3.62837 | 95.043 |
| 3.6303 | 95.047 |
| 3.63223 | 95.053 |
| 3.63416 | 95.064 |
| 3.6360900000000003 | 95.071 |
| 3.63802 | 95.078 |
| 3.63995 | 95.09 |
| 3.64188 | 95.096 |
| 3.6438099999999998 | 95.105 |
| 3.64574 | 95.114 |
| 3.64767 | 95.123 |
| 3.6496 | 95.134 |
| 3.65153 | 95.141 |
| 3.65346 | 95.145 |
| 3.6553899999999997 | 95.156 |
| 3.6573200000000003 | 95.17 |
| 3.65925 | 95.179 |
| 3.66118 | 95.187 |
| 3.66311 | 95.19 |
| 3.66504 | 95.193 |
| 3.6669699999999996 | 95.202 |
| 3.6689000000000003 | 95.206 |
| 3.67083 | 95.208 |
| 3.6727600000000002 | 95.215 |
| 3.67469 | 95.223 |
| 3.6766199999999998 | 95.233 |
| 3.67855 | 95.244 |
| 3.68048 | 95.25 |
| 3.68241 | 95.254 |
| 3.68434 | 95.257 |
| 3.68627 | 95.266 |
| 3.6881999999999997 | 95.281 |
| 3.69013 | 95.286 |
| 3.69206 | 95.286 |
| 3.69399 | 95.292 |
| 3.69592 | 95.301 |
| 3.69785 | 95.308 |
| 3.69978 | 95.314 |
| 3.70171 | 95.32 |
| 3.70364 | 95.326 |
| 3.7055700000000003 | 95.332 |
| 3.7075 | 95.338 |
| 3.70943 | 95.349 |
| 3.71136 | 95.359 |
| 3.7132899999999998 | 95.365 |
| 3.71522 | 95.368 |
| 3.71715 | 95.369 |
| 3.71908 | 95.374 |
| 3.72101 | 95.386 |
| 3.72294 | 95.399 |
| 3.7248699999999997 | 95.408 |
| 3.7268000000000003 | 95.415 |
| 3.72873 | 95.421 |
| 3.73066 | 95.421 |
| 3.73259 | 95.425 |
| 3.73452 | 95.438 |
| 3.7364499999999996 | 95.45 |
| 3.7383800000000003 | 95.457 |
| 3.74031 | 95.461 |
| 3.74224 | 95.466 |
| 3.74417 | 95.473 |
| 3.7460999999999998 | 95.48 |
| 3.7480300000000004 | 95.487 |
| 3.74996 | 95.496 |
| 3.75189 | 95.501 |
| 3.75382 | 95.506 |
| 3.75575 | 95.515 |
| 3.7576799999999997 | 95.523 |
| 3.7596100000000003 | 95.528 |
| 3.76154 | 95.533 |
| 3.76347 | 95.545 |
| 3.7654 | 95.557 |
| 3.76733 | 95.559 |
| 3.76926 | 95.56 |
| 3.7711900000000003 | 95.569 |
| 3.77312 | 95.573 |
| 3.7750500000000002 | 95.574 |
| 3.77698 | 95.585 |
| 3.7789099999999998 | 95.596 |
| 3.78084 | 95.602 |
| 3.78277 | 95.606 |
| 3.7847 | 95.61 |
| 3.78663 | 95.617 |
| 3.78856 | 95.625 |
| 3.7904899999999997 | 95.629 |
| 3.79242 | 95.627 |
| 3.79435 | 95.626 |
| 3.7962800000000003 | 95.631 |
| 3.79821 | 95.641 |
| 3.80014 | 95.652 |
| 3.80207 | 95.663 |
| 3.804 | 95.673 |
| 3.80593 | 95.678 |
| 3.8078600000000002 | 95.68 |
| 3.80979 | 95.683 |
| 3.8117199999999998 | 95.69 |
| 3.81365 | 95.698 |
| 3.8155799999999997 | 95.707 |
| 3.8175100000000004 | 95.715 |
| 3.81944 | 95.718 |
| 3.82137 | 95.717 |
| 3.8233 | 95.718 |
| 3.82523 | 95.731 |
| 3.8271599999999997 | 95.747 |
| 3.8290900000000003 | 95.754 |
| 3.83102 | 95.757 |
| 3.83295 | 95.759 |
| 3.83488 | 95.763 |
| 3.83681 | 95.771 |
| 3.8387399999999996 | 95.781 |
| 3.8406700000000003 | 95.787 |
| 3.8426 | 95.791 |
| 3.8445300000000002 | 95.795 |
| 3.84646 | 95.803 |
| 3.8483899999999998 | 95.813 |
| 3.85032 | 95.818 |
| 3.85225 | 95.82 |
| 3.85418 | 95.824 |
| 3.85611 | 95.835 |
| 3.85804 | 95.848 |
| 3.8599699999999997 | 95.856 |
| 3.8619 | 95.856 |
| 3.86383 | 95.854 |
| 3.8657600000000003 | 95.86 |
| 3.86769 | 95.871 |
| 3.86962 | 95.876 |
| 3.87155 | 95.875 |
| 3.87348 | 95.881 |
| 3.87541 | 95.89 |
| 3.8773400000000002 | 95.898 |
| 3.87927 | 95.908 |
| 3.8811999999999998 | 95.914 |
| 3.88313 | 95.913 |
| 3.8850599999999997 | 95.914 |
| 3.88699 | 95.919 |
| 3.88892 | 95.928 |
| 3.89085 | 95.936 |
| 3.89278 | 95.939 |
| 3.89471 | 95.944 |
| 3.8966399999999997 | 95.953 |
| 3.8985700000000003 | 95.958 |
| 3.9005 | 95.96 |
| 3.90243 | 95.963 |
| 3.90436 | 95.967 |
| 3.90629 | 95.969 |
| 3.9082199999999996 | 95.972 |
| 3.9101500000000002 | 95.978 |
| 3.91208 | 95.986 |
| 3.91401 | 95.992 |
| 3.91594 | 95.999 |
| 3.9178699999999997 | 96.009 |
| 3.9198000000000004 | 96.017 |
| 3.92173 | 96.019 |
| 3.92366 | 96.017 |
| 3.92559 | 96.02 |
| 3.92752 | 96.028 |
| 3.9294499999999997 | 96.035 |
| 3.9313800000000003 | 96.04 |
| 3.93331 | 96.046 |
| 3.93524 | 96.054 |
| 3.93717 | 96.064 |
| 3.9391 | 96.072 |
| 3.94103 | 96.078 |
| 3.9429600000000002 | 96.082 |
| 3.94489 | 96.085 |
| 3.94682 | 96.087 |
| 3.94875 | 96.091 |
| 3.9506799999999997 | 96.101 |
| 3.95261 | 96.108 |
| 3.95454 | 96.115 |
| 3.95647 | 96.123 |
| 3.9584 | 96.129 |
| 3.96033 | 96.133 |
| 3.96226 | 96.136 |
| 3.96419 | 96.136 |
| 3.96612 | 96.143 |
| 3.9680500000000003 | 96.152 |
| 3.96998 | 96.156 |
| 3.97191 | 96.161 |
| 3.97384 | 96.167 |
| 3.97577 | 96.168 |
| 3.9777 | 96.166 |
| 3.9796300000000002 | 96.168 |
| 3.98156 | 96.177 |
| 3.9834899999999998 | 96.186 |
| 3.98542 | 96.192 |
| 3.9873499999999997 | 96.195 |
| 3.9892800000000004 | 96.198 |
| 3.99121 | 96.202 |
| 3.99314 | 96.207 |
| 3.99507 | 96.213 |
| 3.997 | 96.217 |
| 3.9989299999999997 | 96.218 |
| 4.00086 | 96.219 |
| 4.00279 | 96.224 |
| 4.00472 | 96.233 |
| 4.0066500000000005 | 96.239 |
| 4.00858 | 96.24 |
| 4.01051 | 96.24 |
| 4.01244 | 96.243 |
| 4.0143699999999995 | 96.246 |
| 4.0163 | 96.247 |
| 4.01823 | 96.249 |
| 4.02016 | 96.256 |
| 4.02209 | 96.264 |
| 4.02402 | 96.268 |
| 4.02595 | 96.268 |
| 4.02788 | 96.27 |
| 4.02981 | 96.278 |
| 4.03174 | 96.287 |
| 4.03367 | 96.293 |
| 4.0356 | 96.298 |
| 4.03753 | 96.303 |
| 4.03946 | 96.305 |
| 4.04139 | 96.309 |
| 4.0433200000000005 | 96.316 |
| 4.04525 | 96.32 |
| 4.04718 | 96.321 |
| 4.04911 | 96.321 |
| 4.0510399999999995 | 96.326 |
| 4.05297 | 96.335 |
| 4.0549 | 96.345 |
| 4.05683 | 96.353 |
| 4.05876 | 96.359 |
| 4.06069 | 96.362 |
| 4.06262 | 96.363 |
| 4.0645500000000006 | 96.363 |
| 4.06648 | 96.364 |
| 4.06841 | 96.362 |
| 4.07034 | 96.361 |
| 4.07227 | 96.366 |
| 4.074199999999999 | 96.373 |
| 4.07613 | 96.378 |
| 4.07806 | 96.381 |
| 4.07999 | 96.386 |
| 4.08192 | 96.389 |
| 4.08385 | 96.39 |
| 4.085780000000001 | 96.392 |
| 4.08771 | 96.391 |
| 4.08964 | 96.387 |
| 4.09157 | 96.385 |
| 4.0935 | 96.389 |
| 4.0954299999999995 | 96.397 |
| 4.09736 | 96.403 |
| 4.09929 | 96.403 |
| 4.1012200000000005 | 96.399 |
| 4.103149999999999 | 96.394 |
| 4.10508 | 96.393 |
| 4.10701 | 96.399 |
| 4.10894 | 96.406 |
| 4.11087 | 96.408 |
| 4.1128 | 96.407 |
| 4.11473 | 96.41 |
| 4.1166599999999995 | 96.413 |
| 4.11859 | 96.414 |
| 4.120520000000001 | 96.416 |
| 4.12245 | 96.42 |
| 4.12438 | 96.424 |
| 4.12631 | 96.425 |
| 4.12824 | 96.426 |
| 4.13017 | 96.428 |
| 4.1321 | 96.43 |
| 4.13403 | 96.433 |
| 4.13596 | 96.436 |
| 4.1378900000000005 | 96.438 |
| 4.139819999999999 | 96.441 |
| 4.14175 | 96.445 |
| 4.143680000000001 | 96.451 |
| 4.14561 | 96.457 |
| 4.14754 | 96.462 |
| 4.14947 | 96.465 |
| 4.1514 | 96.468 |
| 4.1533299999999995 | 96.473 |
| 4.15526 | 96.478 |
| 4.15719 | 96.48 |
| 4.15912 | 96.482 |
| 4.16105 | 96.484 |
| 4.162979999999999 | 96.485 |
| 4.16491 | 96.49 |
| 4.1668400000000005 | 96.499 |
| 4.16877 | 96.508 |
| 4.1707 | 96.515 |
| 4.17263 | 96.517 |
| 4.1745600000000005 | 96.515 |
| 4.176489999999999 | 96.515 |
| 4.17842 | 96.521 |
| 4.180350000000001 | 96.527 |
| 4.1822799999999996 | 96.529 |
| 4.18421 | 96.53 |
| 4.18614 | 96.532 |
| 4.18807 | 96.526 |
| 4.19 | 96.529 |
| 4.19193 | 96.532 |
| 4.19386 | 96.534 |
| 4.19579 | 96.537 |
| 4.19772 | 96.54 |
| 4.199649999999999 | 96.543 |
| 4.20158 | 96.546 |
| 4.2035100000000005 | 96.549 |
| 4.205439999999999 | 96.552 |
| 4.20737 | 96.554 |
| 4.2093 | 96.557 |
| 4.21123 | 96.56 |
| 4.21316 | 96.563 |
| 4.21509 | 96.566 |
| 4.217020000000001 | 96.569 |
| 4.2189499999999995 | 96.571 |
| 4.22088 | 96.574 |
| 4.222810000000001 | 96.577 |
| 4.22474 | 96.58 |
| 4.22667 | 96.583 |
| 4.2286 | 96.586 |
| 4.23053 | 96.589 |
| 4.23246 | 96.591 |
| 4.23439 | 96.594 |
| 4.23632 | 96.597 |
| 4.23825 | 96.6 |
| 4.2401800000000005 | 96.603 |
| 4.242109999999999 | 96.606 |
| 4.24404 | 96.609 |
| 4.245970000000001 | 96.611 |
| 4.2479 | 96.614 |
| 4.24983 | 96.617 |
| 4.25176 | 96.62 |
| 4.25369 | 96.623 |
| 4.2556199999999995 | 96.626 |
| 4.25755 | 96.628 |
| 4.25948 | 96.631 |
| 4.26141 | 96.634 |
| 4.26334 | 96.637 |
| 4.26527 | 96.64 |
| 4.2672 | 96.643 |
| 4.2691300000000005 | 96.646 |
| 4.27106 | 96.648 |
| 4.27299 | 96.651 |
| 4.27492 | 96.654 |
| 4.2768500000000005 | 96.657 |
| 4.278779999999999 | 96.66 |
| 4.28071 | 96.663 |
| 4.282640000000001 | 96.666 |
| 4.2845699999999995 | 96.668 |
| 4.2865 | 96.671 |
| 4.28843 | 96.674 |
| 4.29036 | 96.677 |
| 4.29229 | 96.68 |
| 4.29422 | 96.683 |
| 4.29615 | 96.685 |
| 4.29808 | 96.688 |
| 4.30001 | 96.691 |
| 4.301939999999999 | 96.694 |
| 4.30387 | 96.697 |
| 4.3058000000000005 | 96.7 |
| 4.307729999999999 | 96.703 |
| 4.30966 | 96.705 |
| 4.31159 | 96.708 |
| 4.3135200000000005 | 96.711 |
| 4.31545 | 96.714 |
| 4.31738 | 96.717 |
| 4.319310000000001 | 96.72 |
| 4.3212399999999995 | 96.722 |
| 4.32317 | 96.725 |
| 4.3251 | 96.728 |
| 4.32703 | 96.731 |
| 4.32896 | 96.734 |
| 4.33089 | 96.737 |
| 4.33282 | 96.74 |
| 4.33475 | 96.742 |
| 4.33668 | 96.745 |
| 4.33861 | 96.748 |
| 4.34054 | 96.751 |
| 4.3424700000000005 | 96.754 |
| 4.344399999999999 | 96.757 |
| 4.34633 | 96.76 |
| 4.34826 | 96.762 |
| 4.35019 | 96.765 |
| 4.35212 | 96.768 |
| 4.35405 | 96.771 |
| 4.35598 | 96.774 |
| 4.3579099999999995 | 96.777 |
| 4.35984 | 96.779 |
| 4.361770000000001 | 96.782 |
| 4.3637 | 96.78 |
| 4.36563 | 96.782 |
| 4.36756 | 96.776 |
| 4.36949 | 96.772 |
| 4.37142 | 96.771 |
| 4.37335 | 96.768 |
| 4.37528 | 96.761 |
| 4.37721 | 96.754 |
| 4.3791400000000005 | 96.751 |
| 4.381069999999999 | 96.753 |
| 4.383 | 96.76 |
| 4.384930000000001 | 96.766 |
| 4.3868599999999995 | 96.768 |
| 4.38879 | 96.769 |
| 4.39072 | 96.773 |
| 4.39265 | 96.775 |
| 4.3945799999999995 | 96.773 |
| 4.39651 | 96.772 |
| 4.39844 | 96.777 |
| 4.40037 | 96.784 |
| 4.4023 | 96.788 |
| 4.404229999999999 | 96.788 |
| 4.40616 | 96.786 |
| 4.4080900000000005 | 96.786 |
| 4.41002 | 96.79 |
| 4.41195 | 96.796 |
| 4.41388 | 96.802 |
| 4.4158100000000005 | 96.807 |
| 4.41774 | 96.81 |
| 4.41967 | 96.81 |
| 4.421600000000001 | 96.81 |
| 4.4235299999999995 | 96.812 |
| 4.42546 | 96.818 |
| 4.42739 | 96.823 |
| 4.42932 | 96.825 |
| 4.43125 | 96.821 |
| 4.43318 | 96.817 |
| 4.43511 | 96.816 |
| 4.43704 | 96.815 |
| 4.43897 | 96.815 |
| 4.4409 | 96.816 |
| 4.44283 | 96.82 |
| 4.4447600000000005 | 96.825 |
| 4.446689999999999 | 96.828 |
| 4.44862 | 96.829 |
| 4.45055 | 96.827 |
| 4.4524799999999995 | 96.825 |
| 4.45441 | 96.824 |
| 4.45634 | 96.824 |
| 4.458270000000001 | 96.825 |
| 4.4601999999999995 | 96.828 |
| 4.46213 | 96.831 |
| 4.464060000000001 | 96.833 |
| 4.46599 | 96.837 |
| 4.46792 | 96.84 |
| 4.46985 | 96.84 |
| 4.47178 | 96.838 |
| 4.47371 | 96.838 |
| 4.47564 | 96.843 |
| 4.47757 | 96.848 |
| 4.4795 | 96.851 |
| 4.4814300000000005 | 96.849 |
| 4.483359999999999 | 96.846 |
| 4.48529 | 96.846 |
| 4.487220000000001 | 96.848 |
| 4.4891499999999995 | 96.848 |
| 4.49108 | 96.845 |
| 4.49301 | 96.843 |
| 4.49494 | 96.843 |
| 4.4968699999999995 | 96.845 |
| 4.4988 | 96.846 |
| 4.50073 | 96.845 |
| 4.50266 | 96.845 |
| 4.50459 | 96.845 |
| 4.50652 | 96.848 |
| 4.50845 | 96.851 |
| 4.5103800000000005 | 96.852 |
| 4.51231 | 96.847 |
| 4.51424 | 96.842 |
| 4.51617 | 96.84 |
| 4.5181000000000004 | 96.842 |
| 4.520029999999999 | 96.843 |
| 4.52196 | 96.843 |
| 4.523890000000001 | 96.843 |
| 4.5258199999999995 | 96.844 |
| 4.52775 | 96.843 |
| 4.52968 | 96.839 |
| 4.53161 | 96.837 |
| 4.53354 | 96.838 |
| 4.53547 | 96.841 |
| 4.5374 | 96.845 |
| 4.53933 | 96.848 |
| 4.54126 | 96.85 |
| 4.543189999999999 | 96.852 |
| 4.54512 | 96.855 |
| 4.5470500000000005 | 96.857 |
| 4.548979999999999 | 96.859 |
| 4.55091 | 96.861 |
| 4.55284 | 96.861 |
| 4.55477 | 96.86 |
| 4.5567 | 96.859 |
| 4.55863 | 96.861 |
| 4.560560000000001 | 96.864 |
| 4.5624899999999995 | 96.865 |
| 4.56442 | 96.863 |
| 4.566350000000001 | 96.86 |
| 4.56828 | 96.859 |
| 4.57021 | 96.858 |
| 4.57214 | 96.86 |
| 4.57407 | 96.867 |
| 4.576 | 96.875 |
| 4.57793 | 96.88 |
| 4.57986 | 96.88 |
| 4.58179 | 96.879 |
| 4.5837200000000005 | 96.879 |
| 4.585649999999999 | 96.881 |
| 4.58758 | 96.882 |
| 4.589510000000001 | 96.883 |
| 4.5914399999999995 | 96.881 |
| 4.59337 | 96.877 |
| 4.5953 | 96.873 |
| 4.59723 | 96.872 |
| 4.5991599999999995 | 96.873 |
| 4.60109 | 96.876 |
| 4.603020000000001 | 96.88 |
| 4.60495 | 96.882 |
| 4.60688 | 96.883 |
| 4.60881 | 96.884 |
| 4.61074 | 96.884 |
| 4.6126700000000005 | 96.884 |
| 4.6146 | 96.885 |
| 4.61653 | 96.888 |
| 4.61846 | 96.892 |
| 4.62039 | 96.894 |
| 4.622319999999999 | 96.894 |
| 4.62425 | 96.892 |
| 4.626180000000001 | 96.888 |
| 4.6281099999999995 | 96.886 |
| 4.63004 | 96.884 |
| 4.63197 | 96.884 |
| 4.6339 | 96.885 |
| 4.63583 | 96.886 |
| 4.63776 | 96.887 |
| 4.63969 | 96.886 |
| 4.64162 | 96.885 |
| 4.64355 | 96.886 |
| 4.645479999999999 | 96.888 |
| 4.64741 | 96.889 |
| 4.6493400000000005 | 96.887 |
| 4.65127 | 96.883 |
| 4.6532 | 96.879 |
| 4.65513 | 96.877 |
| 4.65706 | 96.877 |
| 4.65899 | 96.878 |
| 4.66092 | 96.879 |
| 4.662850000000001 | 96.877 |
| 4.6647799999999995 | 96.874 |
| 4.66671 | 96.872 |
| 4.66864 | 96.873 |
| 4.67057 | 96.874 |
| 4.6725 | 96.872 |
| 4.67443 | 96.869 |
| 4.67636 | 96.867 |
| 4.67829 | 96.869 |
| 4.68022 | 96.871 |
| 4.68215 | 96.87 |
| 4.68408 | 96.866 |
| 4.6860100000000005 | 96.863 |
| 4.687939999999999 | 96.86 |
| 4.68987 | 96.857 |
| 4.6918 | 96.856 |
| 4.6937299999999995 | 96.855 |
| 4.69566 | 96.856 |
| 4.69759 | 96.857 |
| 4.699520000000001 | 96.857 |
| 4.7014499999999995 | 96.856 |
| 4.70338 | 96.855 |
| 4.705310000000001 | 96.853 |
| 4.70724 | 96.847 |
| 4.70917 | 96.842 |
| 4.7111 | 96.838 |
| 4.71303 | 96.836 |
| 4.71496 | 96.837 |
| 4.71689 | 96.838 |
| 4.71882 | 96.84 |
| 4.72075 | 96.842 |
| 4.72268 | 96.84 |
| 4.724609999999999 | 96.835 |
| 4.72654 | 96.833 |
| 4.728470000000001 | 96.833 |
| 4.7303999999999995 | 96.833 |
| 4.73233 | 96.833 |
| 4.73426 | 96.831 |
| 4.73619 | 96.83 |
| 4.73812 | 96.828 |
| 4.74005 | 96.827 |
| 4.74198 | 96.825 |
| 4.74391 | 96.824 |
| 4.74584 | 96.826 |
| 4.74777 | 96.828 |
| 4.7497 | 96.826 |
| 4.7516300000000005 | 96.821 |
| 4.75356 | 96.816 |
| 4.75549 | 96.813 |
| 4.75742 | 96.814 |
| 4.75935 | 96.816 |
| 4.76128 | 96.817 |
| 4.76321 | 96.817 |
| 4.765140000000001 | 96.816 |
| 4.7670699999999995 | 96.815 |
| 4.769 | 96.814 |
| 4.77093 | 96.814 |
| 4.77286 | 96.815 |
| 4.77479 | 96.818 |
| 4.77672 | 96.817 |
| 4.77865 | 96.813 |
| 4.78058 | 96.809 |
| 4.78251 | 96.807 |
| 4.78444 | 96.807 |
| 4.78637 | 96.807 |
| 4.7883000000000004 | 96.807 |
| 4.790229999999999 | 96.806 |
| 4.79216 | 96.803 |
| 4.79409 | 96.801 |
| 4.79602 | 96.798 |
| 4.79795 | 96.797 |
| 4.79988 | 96.797 |
| 4.801810000000001 | 96.798 |
| 4.8037399999999995 | 96.801 |
| 4.80567 | 96.803 |
| 4.807600000000001 | 96.802 |
| 4.80953 | 96.8 |
| 4.81146 | 96.795 |
| 4.81339 | 96.789 |
| 4.81532 | 96.783 |
| 4.81725 | 96.778 |
| 4.81918 | 96.775 |
| 4.82111 | 96.774 |
| 4.82304 | 96.775 |
| 4.82497 | 96.777 |
| 4.826899999999999 | 96.778 |
| 4.82883 | 96.776 |
| 4.830760000000001 | 96.773 |
| 4.8326899999999995 | 96.769 |
| 4.83462 | 96.764 |
| 4.83654 | 96.759 |
| 4.83847 | 96.755 |
| 4.8404 | 96.752 |
| 4.84233 | 96.75 |
| 4.84426 | 96.745 |
| 4.84619 | 96.738 |
| 4.84812 | 96.73 |
| 4.85005 | 96.724 |
| 4.851979999999999 | 96.72 |
| 4.85391 | 96.718 |
| 4.85584 | 96.716 |
| 4.85777 | 96.715 |
| 4.8597 | 96.713 |
| 4.86163 | 96.708 |
| 4.8635600000000005 | 96.703 |
| 4.865489999999999 | 96.698 |
| 4.86742 | 96.694 |
| 4.869350000000001 | 96.691 |
| 4.87128 | 96.688 |
| 4.87321 | 96.685 |
| 4.87514 | 96.683 |
| 4.87707 | 96.679 |
| 4.879 | 96.674 |
| 4.88093 | 96.668 |
| 4.88286 | 96.663 |
| 4.88479 | 96.662 |
| 4.88672 | 96.662 |
| 4.888649999999999 | 96.661 |
| 4.89058 | 96.657 |
| 4.892510000000001 | 96.652 |
| 4.8944399999999995 | 96.647 |
| 4.89637 | 96.642 |
| 4.8983 | 96.64 |
| 4.90023 | 96.64 |
| 4.90216 | 96.638 |
| 4.90409 | 96.635 |
| 4.906020000000001 | 96.631 |
| 4.90795 | 96.626 |
| 4.90988 | 96.621 |
| 4.91181 | 96.617 |
| 4.91374 | 96.613 |
| 4.91567 | 96.609 |
| 4.9176 | 96.606 |
| 4.91953 | 96.602 |
| 4.92146 | 96.599 |
| 4.92339 | 96.596 |
| 4.92532 | 96.593 |
| 4.92725 | 96.588 |
| 4.929180000000001 | 96.581 |
| 4.931109999999999 | 96.578 |
| 4.93304 | 96.578 |
| 4.93497 | 96.58 |
| 4.9369 | 96.58 |
| 4.93883 | 96.578 |
| 4.94076 | 96.576 |
| 4.94269 | 96.575 |
| 4.94462 | 96.571 |
| 4.94655 | 96.564 |
| 4.94848 | 96.554 |
| 4.95041 | 96.544 |
| 4.95234 | 96.537 |
| 4.95427 | 96.533 |
| 4.9562 | 96.534 |
| 4.95813 | 96.539 |
| 4.96006 | 96.543 |
| 4.96199 | 96.541 |
| 4.96392 | 96.533 |
| 4.9658500000000005 | 96.526 |
| 4.967779999999999 | 96.52 |
| 4.96971 | 96.515 |
| 4.971640000000001 | 96.508 |
| 4.97357 | 96.497 |
| 4.9755 | 96.489 |
| 4.97743 | 96.485 |
| 4.97936 | 96.486 |
| 4.9812899999999996 | 96.487 |
| 4.98322 | 96.485 |
| 4.98515 | 96.481 |
| 4.98708 | 96.477 |
| 4.98901 | 96.472 |
| 4.990939999999999 | 96.467 |
| 4.99287 | 96.462 |
| 4.994800000000001 | 96.458 |
| 4.9967299999999994 | 96.453 |
| 4.99866 | 96.447 |
| 5.00059 | 96.44 |
| 5.0025200000000005 | 96.433 |
| 5.004449999999999 | 96.428 |
| 5.00638 | 96.424 |
| 5.008310000000001 | 96.42 |
| 5.01024 | 96.414 |
| 5.01217 | 96.406 |
| 5.0141 | 96.398 |
| 5.01603 | 96.395 |
| 5.01796 | 96.399 |
| 5.01989 | 96.411 |
| 5.02182 | 96.418 |
| 5.02375 | 96.411 |
| 5.02568 | 96.397 |
| 5.027609999999999 | 96.382 |
| 5.02954 | 96.372 |
| 5.0314700000000006 | 96.363 |
| 5.033399999999999 | 96.354 |
| 5.03533 | 96.346 |
| 5.03726 | 96.339 |
| 5.03919 | 96.335 |
| 5.04112 | 96.328 |
| 5.04305 | 96.32 |
| 5.04498 | 96.31 |
| 5.04691 | 96.3 |
| 5.04884 | 96.293 |
| 5.050770000000001 | 96.288 |
| 5.0527 | 96.284 |
| 5.05463 | 96.28 |
| 5.05656 | 96.274 |
| 5.05849 | 96.268 |
| 5.06042 | 96.262 |
| 5.06235 | 96.256 |
| 5.06428 | 96.249 |
| 5.06621 | 96.241 |
| 5.0681400000000005 | 96.234 |
| 5.070069999999999 | 96.228 |
| 5.072 | 96.222 |
| 5.073930000000001 | 96.217 |
| 5.07586 | 96.211 |
| 5.07779 | 96.207 |
| 5.07972 | 96.206 |
| 5.08165 | 96.21 |
| 5.0835799999999995 | 96.216 |
| 5.08551 | 96.214 |
| 5.08744 | 96.204 |
| 5.08937 | 96.188 |
| 5.0913 | 96.171 |
| 5.093229999999999 | 96.159 |
| 5.09516 | 96.15 |
| 5.097090000000001 | 96.143 |
| 5.09902 | 96.138 |
| 5.10095 | 96.132 |
| 5.10288 | 96.124 |
| 5.1048100000000005 | 96.115 |
| 5.106739999999999 | 96.107 |
| 5.10867 | 96.101 |
| 5.110600000000001 | 96.098 |
| 5.11253 | 96.096 |
| 5.11446 | 96.093 |
| 5.11639 | 96.088 |
| 5.11832 | 96.078 |
| 5.12025 | 96.065 |
| 5.12218 | 96.054 |
| 5.12411 | 96.044 |
| 5.12604 | 96.039 |
| 5.12797 | 96.034 |
| 5.129899999999999 | 96.03 |
| 5.13183 | 96.025 |
| 5.1337600000000005 | 96.02 |
| 5.135689999999999 | 96.017 |
| 5.13762 | 96.015 |
| 5.13955 | 96.014 |
| 5.14148 | 96.009 |
| 5.14341 | 95.999 |
| 5.14534 | 95.994 |
| 5.147270000000001 | 95.995 |
| 5.1491999999999996 | 96.003 |
| 5.15113 | 95.997 |
| 5.15306 | 95.981 |
| 5.15499 | 95.959 |
| 5.15692 | 95.94 |
| 5.15885 | 95.931 |
| 5.16078 | 95.924 |
| 5.16271 | 95.917 |
| 5.16464 | 95.909 |
| 5.16657 | 95.902 |
| 5.1685 | 95.895 |
| 5.1704300000000005 | 95.888 |
| 5.172359999999999 | 95.882 |
| 5.17429 | 95.875 |
| 5.17622 | 95.869 |
| 5.17815 | 95.863 |
| 5.18008 | 95.855 |
| 5.18201 | 95.847 |
| 5.18394 | 95.839 |
| 5.1858699999999995 | 95.833 |
| 5.1878 | 95.828 |
| 5.18973 | 95.824 |
| 5.19166 | 95.818 |
| 5.19359 | 95.81 |
| 5.19552 | 95.802 |
| 5.19745 | 95.801 |
| 5.19938 | 95.806 |
| 5.20131 | 95.814 |
| 5.20324 | 95.815 |
| 5.20517 | 95.801 |
| 5.2071000000000005 | 95.781 |
| 5.209029999999999 | 95.758 |
| 5.21096 | 95.747 |
| 5.212890000000001 | 95.751 |
| 5.21482 | 95.76 |
| 5.21675 | 95.767 |
| 5.21868 | 95.752 |
| 5.22061 | 95.731 |
| 5.22254 | 95.708 |
| 5.22447 | 95.69 |
| 5.2264 | 95.678 |
| 5.22833 | 95.669 |
| 5.23026 | 95.661 |
| 5.232189999999999 | 95.656 |
| 5.23412 | 95.656 |
| 5.2360500000000005 | 95.656 |
| 5.237979999999999 | 95.655 |
| 5.23991 | 95.648 |
| 5.24184 | 95.637 |
| 5.2437700000000005 | 95.625 |
| 5.2457 | 95.611 |
| 5.24763 | 95.597 |
| 5.249560000000001 | 95.584 |
| 5.2514899999999995 | 95.574 |
| 5.25342 | 95.566 |
| 5.25535 | 95.56 |
| 5.25728 | 95.554 |
| 5.25921 | 95.548 |
| 5.26114 | 95.54 |
| 5.26307 | 95.53 |
| 5.265 | 95.518 |
| 5.26693 | 95.506 |
| 5.26886 | 95.493 |
| 5.27079 | 95.482 |
| 5.2727200000000005 | 95.474 |
| 5.274649999999999 | 95.474 |
| 5.27658 | 95.476 |
| 5.27851 | 95.476 |
| 5.28044 | 95.471 |
| 5.28237 | 95.456 |
| 5.2843 | 95.439 |
| 5.28623 | 95.423 |
| 5.2881599999999995 | 95.411 |
| 5.29009 | 95.408 |
| 5.292020000000001 | 95.409 |
| 5.29395 | 95.413 |
| 5.29588 | 95.404 |
| 5.29781 | 95.388 |
| 5.29974 | 95.368 |
| 5.30167 | 95.351 |
| 5.3036 | 95.339 |
| 5.30553 | 95.329 |
| 5.30746 | 95.319 |
| 5.3093900000000005 | 95.308 |
| 5.311319999999999 | 95.296 |
| 5.31325 | 95.285 |
| 5.315180000000001 | 95.276 |
| 5.31711 | 95.267 |
| 5.31904 | 95.258 |
| 5.32097 | 95.25 |
| 5.3229 | 95.238 |
| 5.3248299999999995 | 95.226 |
| 5.32676 | 95.213 |
| 5.32869 | 95.2 |
| 5.33062 | 95.19 |
| 5.33255 | 95.18 |
| 5.334479999999999 | 95.17 |
| 5.33641 | 95.16 |
| 5.3383400000000005 | 95.151 |
| 5.34027 | 95.142 |
| 5.3422 | 95.134 |
| 5.34413 | 95.126 |
| 5.3460600000000005 | 95.121 |
| 5.347989999999999 | 95.127 |
| 5.34992 | 95.146 |
| 5.351850000000001 | 95.167 |
| 5.3537799999999995 | 95.181 |
| 5.35571 | 95.171 |
| 5.35764 | 95.151 |
| 5.35957 | 95.12 |
| 5.3615 | 95.088 |
| 5.36343 | 95.059 |
| 5.36536 | 95.034 |
| 5.36729 | 95.017 |
| 5.36922 | 95.005 |
| 5.371149999999999 | 94.996 |
| 5.37308 | 94.989 |
| 5.3750100000000005 | 94.982 |
| 5.376939999999999 | 94.975 |
| 5.37887 | 94.969 |
| 5.3808 | 94.963 |
| 5.38273 | 94.956 |
| 5.38466 | 94.946 |
| 5.38659 | 94.932 |
| 5.388520000000001 | 94.919 |
| 5.3904499999999995 | 94.905 |
| 5.39238 | 94.893 |
| 5.394310000000001 | 94.882 |
| 5.39624 | 94.871 |
| 5.39817 | 94.861 |
| 5.4001 | 94.852 |
| 5.40203 | 94.843 |
| 5.40396 | 94.834 |
| 5.40589 | 94.827 |
| 5.40782 | 94.821 |
| 5.40975 | 94.819 |
| 5.4116800000000005 | 94.82 |
| 5.413609999999999 | 94.816 |
| 5.41554 | 94.805 |
| 5.417470000000001 | 94.788 |
| 5.4193999999999996 | 94.783 |
| 5.42133 | 94.789 |
| 5.42326 | 94.818 |
| 5.42519 | 94.828 |
| 5.4271199999999995 | 94.821 |
| 5.42905 | 94.785 |
| 5.43098 | 94.749 |
| 5.43291 | 94.715 |
| 5.43484 | 94.692 |
| 5.43677 | 94.677 |
| 5.4387 | 94.668 |
| 5.4406300000000005 | 94.667 |
| 5.44256 | 94.668 |
| 5.44449 | 94.667 |
| 5.44642 | 94.66 |
| 5.4483500000000005 | 94.646 |
| 5.450279999999999 | 94.629 |
| 5.45221 | 94.612 |
| 5.454140000000001 | 94.598 |
| 5.4560699999999995 | 94.584 |
| 5.458 | 94.571 |
| 5.45993 | 94.563 |
| 5.46186 | 94.565 |
| 5.46379 | 94.587 |
| 5.46572 | 94.613 |
| 5.46765 | 94.625 |
| 5.46958 | 94.605 |
| 5.47151 | 94.562 |
| 5.473439999999999 | 94.518 |
| 5.47537 | 94.482 |
| 5.4773000000000005 | 94.473 |
| 5.479229999999999 | 94.472 |
| 5.48116 | 94.478 |
| 5.48309 | 94.465 |
| 5.4850200000000005 | 94.445 |
| 5.48695 | 94.42 |
| 5.48888 | 94.401 |
| 5.490810000000001 | 94.384 |
| 5.4927399999999995 | 94.371 |
| 5.49467 | 94.355 |
| 5.4966 | 94.341 |
| 5.49853 | 94.327 |
| 5.50046 | 94.317 |
| 5.50239 | 94.308 |
| 5.50432 | 94.3 |
| 5.50625 | 94.286 |
| 5.50818 | 94.27 |
| 5.51011 | 94.251 |
| 5.51204 | 94.233 |
| 5.5139700000000005 | 94.218 |
| 5.515899999999999 | 94.207 |
| 5.51783 | 94.202 |
| 5.51976 | 94.2 |
| 5.5216899999999995 | 94.204 |
| 5.52362 | 94.203 |
| 5.52555 | 94.198 |
| 5.52748 | 94.18 |
| 5.5294099999999995 | 94.16 |
| 5.53134 | 94.138 |
| 5.533270000000001 | 94.12 |
| 5.5352 | 94.102 |
| 5.53713 | 94.085 |
| 5.53906 | 94.066 |
| 5.54099 | 94.048 |
| 5.5429200000000005 | 94.031 |
| 5.54485 | 94.017 |
| 5.54678 | 94.007 |
| 5.54871 | 94.001 |
| 5.5506400000000005 | 94 |
| 5.552569999999999 | 94.001 |
| 5.5545 | 94.004 |
| 5.556430000000001 | 94.007 |
| 5.5583599999999995 | 94.005 |
| 5.56029 | 93.99 |
| 5.56222 | 93.966 |
| 5.56415 | 93.941 |
| 5.56608 | 93.922 |
| 5.56801 | 93.91 |
| 5.56994 | 93.9 |
| 5.57187 | 93.882 |
| 5.5738 | 93.865 |
| 5.575729999999999 | 93.849 |
| 5.57766 | 93.862 |
| 5.5795900000000005 | 93.879 |
| 5.58152 | 93.901 |
| 5.58345 | 93.889 |
| 5.58538 | 93.863 |
| 5.58731 | 93.819 |
| 5.58924 | 93.776 |
| 5.59117 | 93.735 |
| 5.593100000000001 | 93.704 |
| 5.5950299999999995 | 93.681 |
| 5.59696 | 93.663 |
| 5.59889 | 93.656 |
| 5.60082 | 93.653 |
| 5.60275 | 93.655 |
| 5.60468 | 93.651 |
| 5.60661 | 93.641 |
| 5.60854 | 93.621 |
| 5.61047 | 93.601 |
| 5.6124 | 93.585 |
| 5.61433 | 93.582 |
| 5.6162600000000005 | 93.585 |
| 5.618189999999999 | 93.589 |
| 5.62012 | 93.579 |
| 5.62205 | 93.561 |
| 5.6239799999999995 | 93.534 |
| 5.62591 | 93.508 |
| 5.62784 | 93.486 |
| 5.629770000000001 | 93.472 |
| 5.6316999999999995 | 93.463 |
| 5.63363 | 93.455 |
| 5.635560000000001 | 93.442 |
| 5.63749 | 93.432 |
| 5.63942 | 93.425 |
| 5.64135 | 93.454 |
| 5.64328 | 93.48 |
| 5.64521 | 93.503 |
| 5.64714 | 93.479 |
| 5.64907 | 93.44 |
| 5.651 | 93.39 |
| 5.6529300000000005 | 93.353 |
| 5.654859999999999 | 93.326 |
| 5.65679 | 93.319 |
| 5.658720000000001 | 93.307 |
| 5.6606499999999995 | 93.288 |
| 5.66258 | 93.258 |
| 5.66451 | 93.226 |
| 5.66644 | 93.196 |
| 5.6683699999999995 | 93.171 |
| 5.6703 | 93.15 |
| 5.67223 | 93.143 |
| 5.67416 | 93.144 |
| 5.67609 | 93.157 |
| 5.67802 | 93.158 |
| 5.67995 | 93.152 |
| 5.6818800000000005 | 93.122 |
| 5.68381 | 93.089 |
| 5.68574 | 93.056 |
| 5.68767 | 93.037 |
| 5.6896 | 93.024 |
| 5.691529999999999 | 93.021 |
| 5.69346 | 93.014 |
| 5.695390000000001 | 93.005 |
| 5.6973199999999995 | 92.978 |
| 5.69925 | 92.947 |
| 5.70118 | 92.913 |
| 5.70311 | 92.882 |
| 5.70504 | 92.857 |
| 5.70697 | 92.846 |
| 5.7089 | 92.851 |
| 5.71083 | 92.866 |
| 5.71276 | 92.881 |
| 5.714689999999999 | 92.887 |
| 5.71662 | 92.879 |
| 5.7185500000000005 | 92.868 |
| 5.720479999999999 | 92.854 |
| 5.72241 | 92.836 |
| 5.72434 | 92.813 |
| 5.72627 | 92.782 |
| 5.7282 | 92.749 |
| 5.73013 | 92.715 |
| 5.732060000000001 | 92.691 |
| 5.7339899999999995 | 92.674 |
| 5.73592 | 92.664 |
| 5.737850000000001 | 92.649 |
| 5.73978 | 92.629 |
| 5.74171 | 92.597 |
| 5.74364 | 92.57 |
| 5.74557 | 92.547 |
| 5.7475 | 92.548 |
| 5.74943 | 92.546 |
| 5.75136 | 92.537 |
| 5.75329 | 92.51 |
| 5.7552200000000004 | 92.474 |
| 5.757149999999999 | 92.433 |
| 5.75908 | 92.395 |
| 5.761010000000001 | 92.364 |
| 5.7629399999999995 | 92.359 |
| 5.76487 | 92.368 |
| 5.7668 | 92.428 |
| 5.76873 | 92.466 |
| 5.7706599999999995 | 92.468 |
| 5.77259 | 92.429 |
| 5.774520000000001 | 92.373 |
| 5.77645 | 92.321 |
| 5.77838 | 92.277 |
| 5.78031 | 92.248 |
| 5.78224 | 92.222 |
| 5.7841700000000005 | 92.198 |
| 5.7861 | 92.166 |
| 5.78803 | 92.134 |
| 5.78996 | 92.103 |
| 5.79189 | 92.076 |
| 5.793819999999999 | 92.051 |
| 5.79575 | 92.03 |
| 5.797680000000001 | 92.01 |
| 5.7996099999999995 | 91.993 |
| 5.80154 | 91.981 |
| 5.80347 | 91.971 |
| 5.8054 | 91.957 |
| 5.80733 | 91.939 |
| 5.80926 | 91.914 |
| 5.81119 | 91.884 |
| 5.81312 | 91.852 |
| 5.81505 | 91.828 |
| 5.816979999999999 | 91.813 |
| 5.81891 | 91.831 |
| 5.8208400000000005 | 91.863 |
| 5.82277 | 91.909 |
| 5.8247 | 91.914 |
| 5.82663 | 91.907 |
| 5.82856 | 91.876 |
| 5.83049 | 91.846 |
| 5.83242 | 91.817 |
| 5.834350000000001 | 91.78 |
| 5.8362799999999995 | 91.739 |
| 5.83821 | 91.686 |
| 5.84014 | 91.636 |
| 5.84207 | 91.59 |
| 5.844 | 91.556 |
| 5.84593 | 91.529 |
| 5.84786 | 91.51 |
| 5.84979 | 91.491 |
| 5.85172 | 91.469 |
| 5.85365 | 91.446 |
| 5.85558 | 91.423 |
| 5.85751 | 91.411 |
| 5.859439999999999 | 91.402 |
| 5.86137 | 91.403 |
| 5.863300000000001 | 91.402 |
| 5.8652299999999995 | 91.395 |
| 5.86716 | 91.377 |
| 5.86909 | 91.352 |
| 5.871020000000001 | 91.314 |
| 5.8729499999999994 | 91.273 |
| 5.87488 | 91.227 |
| 5.876810000000001 | 91.191 |
| 5.87874 | 91.168 |
| 5.88067 | 91.196 |
| 5.8826 | 91.239 |
| 5.88453 | 91.248 |
| 5.8864600000000005 | 91.239 |
| 5.88839 | 91.189 |
| 5.89032 | 91.141 |
| 5.89225 | 91.093 |
| 5.89418 | 91.072 |
| 5.896109999999999 | 91.058 |
| 5.89804 | 91.049 |
| 5.899970000000001 | 91.025 |
| 5.9018999999999995 | 90.974 |
| 5.90383 | 90.917 |
| 5.90576 | 90.855 |
| 5.90769 | 90.804 |
| 5.90962 | 90.757 |
| 5.91155 | 90.724 |
| 5.91348 | 90.696 |
| 5.91541 | 90.675 |
| 5.91734 | 90.657 |
| 5.91927 | 90.641 |
| 5.9212 | 90.621 |
| 5.9231300000000005 | 90.599 |
| 5.92506 | 90.568 |
| 5.92699 | 90.534 |
| 5.92892 | 90.495 |
| 5.93085 | 90.46 |
| 5.93278 | 90.428 |
| 5.93471 | 90.441 |
| 5.936640000000001 | 90.464 |
| 5.9385699999999995 | 90.503 |
| 5.9405 | 90.51 |
| 5.94243 | 90.457 |
| 5.94436 | 90.392 |
| 5.94629 | 90.317 |
| 5.94822 | 90.256 |
| 5.95015 | 90.2 |
| 5.95208 | 90.158 |
| 5.95401 | 90.116 |
| 5.95594 | 90.075 |
| 5.95787 | 90.032 |
| 5.9598 | 89.988 |
| 5.961729999999999 | 89.948 |
| 5.96366 | 89.911 |
| 5.96559 | 89.893 |
| 5.96752 | 89.88 |
| 5.96945 | 89.884 |
| 5.97138 | 89.878 |
| 5.973310000000001 | 89.858 |
| 5.975239999999999 | 89.822 |
| 5.97717 | 89.777 |
| 5.979100000000001 | 89.736 |
| 5.98103 | 89.697 |
| 5.98296 | 89.676 |
| 5.98489 | 89.659 |
| 5.98682 | 89.652 |
| 5.98875 | 89.644 |
| 5.99068 | 89.637 |
| 5.99261 | 89.612 |
| 5.99454 | 89.579 |
| 5.99647 | 89.526 |
| 5.998399999999999 | 89.471 |
| 6.00033 | 89.416 |
| 6.002260000000001 | 89.365 |
| 6.0041899999999995 | 89.321 |
| 6.00612 | 89.281 |
| 6.00805 | 89.246 |
| 6.00998 | 89.22 |
| 6.011909999999999 | 89.196 |
| 6.01384 | 89.181 |
| 6.015770000000001 | 89.165 |
| 6.0177 | 89.134 |
| 6.01963 | 89.099 |
| 6.02156 | 89.051 |
| 6.02349 | 89.003 |
| 6.02542 | 88.956 |
| 6.02735 | 88.915 |
| 6.02928 | 88.877 |
| 6.03121 | 88.845 |
| 6.03314 | 88.814 |
| 6.035069999999999 | 88.784 |
| 6.037 | 88.754 |
| 6.038930000000001 | 88.724 |
| 6.0408599999999995 | 88.696 |
| 6.04279 | 88.671 |
| 6.04472 | 88.662 |
| 6.04665 | 88.666 |
| 6.04858 | 88.691 |
| 6.05051 | 88.725 |
| 6.05244 | 88.687 |
| 6.05437 | 88.639 |
| 6.0563 | 88.564 |
| 6.05823 | 88.491 |
| 6.06016 | 88.425 |
| 6.06209 | 88.365 |
| 6.06402 | 88.317 |
| 6.06595 | 88.285 |
| 6.06788 | 88.267 |
| 6.06981 | 88.264 |
| 6.07174 | 88.268 |
| 6.07367 | 88.25 |
| 6.0756000000000006 | 88.227 |
| 6.077529999999999 | 88.166 |
| 6.07946 | 88.105 |
| 6.081390000000001 | 88.039 |
| 6.08332 | 87.977 |
| 6.08525 | 87.922 |
| 6.08718 | 87.872 |
| 6.08911 | 87.83 |
| 6.09104 | 87.792 |
| 6.09297 | 87.757 |
| 6.0949 | 87.724 |
| 6.09683 | 87.69 |
| 6.09876 | 87.658 |
| 6.100689999999999 | 87.626 |
| 6.10262 | 87.601 |
| 6.104550000000001 | 87.577 |
| 6.1064799999999995 | 87.562 |
| 6.10841 | 87.551 |
| 6.11034 | 87.547 |
| 6.1122700000000005 | 87.547 |
| 6.114199999999999 | 87.549 |
| 6.11613 | 87.534 |
| 6.118060000000001 | 87.509 |
| 6.11999 | 87.466 |
| 6.12192 | 87.415 |
| 6.12385 | 87.366 |
| 6.12578 | 87.318 |
| 6.12771 | 87.282 |
| 6.12964 | 87.248 |
| 6.13157 | 87.225 |
| 6.1335 | 87.204 |
| 6.13543 | 87.189 |
| 6.137359999999999 | 87.179 |
| 6.13929 | 87.177 |
| 6.141220000000001 | 87.18 |
| 6.1431499999999994 | 87.19 |
| 6.14508 | 87.193 |
| 6.14701 | 87.192 |
| 6.14894 | 87.177 |
| 6.15087 | 87.156 |
| 6.1528 | 87.138 |
| 6.15473 | 87.12 |
| 6.15666 | 87.132 |
| 6.15859 | 87.146 |
| 6.16052 | 87.182 |
| 6.16245 | 87.215 |
| 6.16438 | 87.224 |
| 6.16631 | 87.228 |
| 6.16824 | 87.214 |
| 6.17017 | 87.202 |
| 6.1721 | 87.192 |
| 6.17403 | 87.186 |
| 6.17596 | 87.185 |
| 6.1778900000000005 | 87.19 |
| 6.179819999999999 | 87.199 |
| 6.18175 | 87.232 |
| 6.183680000000001 | 87.28 |
| 6.18561 | 87.348 |
| 6.18754 | 87.423 |
| 6.18947 | 87.454 |
| 6.1914 | 87.474 |
| 6.19333 | 87.465 |
| 6.19526 | 87.452 |
| 6.19719 | 87.448 |
| 6.19912 | 87.446 |
| 6.20105 | 87.459 |
| 6.202979999999999 | 87.473 |
| 6.20491 | 87.494 |
| 6.206840000000001 | 87.516 |
| 6.20877 | 87.544 |
| 6.2107 | 87.573 |
| 6.21263 | 87.606 |
| 6.2145600000000005 | 87.637 |
| 6.21648 | 87.666 |
| 6.2184099999999995 | 87.691 |
| 6.22034 | 87.712 |
| 6.222270000000001 | 87.731 |
| 6.2242 | 87.748 |
| 6.22613 | 87.763 |
| 6.22806 | 87.776 |
| 6.22999 | 87.789 |
| 6.23192 | 87.8 |
| 6.23385 | 87.813 |
| 6.23578 | 87.827 |
| 6.23771 | 87.842 |
| 6.2396400000000005 | 87.857 |
| 6.241569999999999 | 87.869 |
| 6.2435 | 87.88 |
| 6.245430000000001 | 87.888 |
| 6.24736 | 87.895 |
| 6.24929 | 87.9 |
| 6.25122 | 87.904 |
| 6.25315 | 87.908 |
| 6.2550799999999995 | 87.912 |
| 6.25701 | 87.916 |
| 6.25894 | 87.92 |
| 6.26087 | 87.924 |
| 6.2628 | 87.928 |
| 6.264729999999999 | 87.931 |
| 6.26666 | 87.934 |
| 6.2685900000000006 | 87.936 |
| 6.27052 | 87.938 |
| 6.27245 | 87.938 |
| 6.27438 | 87.937 |
| 6.2763100000000005 | 87.932 |
| 6.278239999999999 | 87.928 |
| 6.28017 | 87.922 |
| 6.282100000000001 | 87.916 |
| 6.28403 | 87.911 |
| 6.28596 | 87.905 |
| 6.28789 | 87.898 |
| 6.28982 | 87.892 |
| 6.29175 | 87.884 |
| 6.29368 | 87.877 |
| 6.29561 | 87.869 |
| 6.29754 | 87.861 |
| 6.29947 | 87.854 |
| 6.301399999999999 | 87.847 |
| 6.30333 | 87.84 |
| 6.3052600000000005 | 87.832 |
| 6.307189999999999 | 87.823 |
| 6.30912 | 87.814 |
| 6.31105 | 87.804 |
| 6.31298 | 87.793 |
| 6.31491 | 87.783 |
| 6.31684 | 87.773 |
| 6.318770000000001 | 87.763 |
| 6.3206999999999995 | 87.752 |
| 6.32263 | 87.74 |
| 6.32456 | 87.727 |
| 6.32649 | 87.713 |
| 6.32842 | 87.699 |
| 6.33035 | 87.685 |
| 6.33228 | 87.67 |
| 6.33421 | 87.653 |
| 6.33614 | 87.639 |
| 6.33807 | 87.628 |
| 6.34 | 87.626 |
| 6.3419300000000005 | 87.639 |
| 6.343859999999999 | 87.657 |
| 6.34579 | 87.68 |
| 6.347720000000001 | 87.686 |
| 6.34965 | 87.666 |
| 6.35158 | 87.639 |
| 6.35351 | 87.6 |
| 6.35544 | 87.563 |
| 6.3573699999999995 | 87.53 |
| 6.3593 | 87.501 |
| 6.36123 | 87.479 |
| 6.36316 | 87.461 |
| 6.36509 | 87.453 |
| 6.36702 | 87.451 |
| 6.36895 | 87.467 |
| 6.3708800000000005 | 87.481 |
| 6.37281 | 87.493 |
| 6.37474 | 87.494 |
| 6.37667 | 87.466 |
| 6.3786000000000005 | 87.434 |
| 6.380529999999999 | 87.392 |
| 6.38246 | 87.352 |
| 6.384390000000001 | 87.322 |
| 6.3863199999999996 | 87.294 |
| 6.38825 | 87.281 |
| 6.39018 | 87.269 |
| 6.39211 | 87.26 |
| 6.39404 | 87.249 |
| 6.39597 | 87.229 |
| 6.3979 | 87.208 |
| 6.39983 | 87.178 |
| 6.40176 | 87.149 |
| 6.403689999999999 | 87.121 |
| 6.40562 | 87.092 |
| 6.4075500000000005 | 87.083 |
| 6.409479999999999 | 87.074 |
| 6.41141 | 87.127 |
| 6.41334 | 87.189 |
| 6.4152700000000005 | 87.253 |
| 6.4172 | 87.319 |
| 6.41913 | 87.299 |
| 6.421060000000001 | 87.254 |
| 6.4229899999999995 | 87.2 |
| 6.42492 | 87.142 |
| 6.42685 | 87.093 |
| 6.42878 | 87.051 |
| 6.43071 | 87.02 |
| 6.43264 | 86.997 |
| 6.43457 | 86.976 |
| 6.4365 | 86.956 |
| 6.43843 | 86.93 |
| 6.44036 | 86.896 |
| 6.44229 | 86.864 |
| 6.4442200000000005 | 86.832 |
| 6.446149999999999 | 86.806 |
| 6.44808 | 86.794 |
| 6.45001 | 86.785 |
| 6.45194 | 86.786 |
| 6.45387 | 86.785 |
| 6.4558 | 86.77 |
| 6.45773 | 86.754 |
| 6.4596599999999995 | 86.723 |
| 6.46159 | 86.692 |
| 6.463520000000001 | 86.663 |
| 6.46545 | 86.634 |
| 6.46738 | 86.62 |
| 6.46931 | 86.609 |
| 6.47124 | 86.614 |
| 6.47317 | 86.624 |
| 6.4751 | 86.633 |
| 6.47703 | 86.642 |
| 6.47896 | 86.645 |
| 6.4808900000000005 | 86.643 |
| 6.482819999999999 | 86.642 |
| 6.48475 | 86.642 |
| 6.486680000000001 | 86.645 |
| 6.4886099999999995 | 86.652 |
| 6.49054 | 86.663 |
| 6.49247 | 86.679 |
| 6.4944 | 86.691 |
| 6.4963299999999995 | 86.684 |
| 6.49826 | 86.674 |
| 6.50019 | 86.623 |
| 6.50212 | 86.572 |
| 6.50405 | 86.516 |
| 6.505979999999999 | 86.46 |
| 6.50791 | 86.415 |
| 6.5098400000000005 | 86.371 |
| 6.51177 | 86.339 |
| 6.5137 | 86.311 |
| 6.51563 | 86.296 |
| 6.5175600000000005 | 86.289 |
| 6.519489999999999 | 86.291 |
| 6.52142 | 86.301 |
| 6.523350000000001 | 86.306 |
| 6.5252799999999995 | 86.301 |
| 6.52721 | 86.29 |
| 6.52914 | 86.264 |
| 6.53107 | 86.237 |
| 6.533 | 86.206 |
| 6.53493 | 86.175 |
| 6.53686 | 86.152 |
| 6.53879 | 86.128 |
| 6.54072 | 86.117 |
| 6.54265 | 86.107 |
| 6.54458 | 86.103 |
| 6.5465100000000005 | 86.1 |
| 6.548439999999999 | 86.095 |
| 6.55037 | 86.088 |
| 6.5523 | 86.081 |
| 6.55423 | 86.073 |
| 6.55616 | 86.065 |
| 6.55809 | 86.057 |
| 6.560020000000001 | 86.047 |
| 6.5619499999999995 | 86.032 |
| 6.56388 | 86.017 |
| 6.565810000000001 | 86.009 |
| 6.56774 | 86.001 |
| 6.56967 | 86.015 |
| 6.5716 | 86.033 |
| 6.57353 | 86.045 |
| 6.57546 | 86.055 |
| 6.57739 | 86.04 |
| 6.57932 | 86.004 |
| 6.58125 | 85.965 |
| 6.5831800000000005 | 85.919 |
| 6.585109999999999 | 85.877 |
| 6.58704 | 85.849 |
| 6.588970000000001 | 85.821 |
| 6.5908999999999995 | 85.822 |
| 6.59283 | 85.823 |
| 6.59476 | 85.822 |
| 6.59669 | 85.821 |
| 6.5986199999999995 | 85.804 |
| 6.60055 | 85.779 |
| 6.60248 | 85.75 |
| 6.60441 | 85.718 |
| 6.60634 | 85.689 |
| 6.60827 | 85.664 |
| 6.6102 | 85.642 |
| 6.6121300000000005 | 85.629 |
| 6.61406 | 85.617 |
| 6.61599 | 85.608 |
| 6.61792 | 85.599 |
| 6.6198500000000005 | 85.586 |
| 6.621779999999999 | 85.572 |
| 6.62371 | 85.558 |
| 6.625640000000001 | 85.544 |
| 6.6275699999999995 | 85.533 |
| 6.6295 | 85.526 |
| 6.63143 | 85.523 |
| 6.63336 | 85.534 |
| 6.63529 | 85.545 |
| 6.63722 | 85.562 |
| 6.63915 | 85.58 |
| 6.64108 | 85.561 |
| 6.64301 | 85.533 |
| 6.644939999999999 | 85.493 |
| 6.64687 | 85.446 |
| 6.6488000000000005 | 85.399 |
| 6.650729999999999 | 85.356 |
| 6.65266 | 85.314 |
| 6.65459 | 85.282 |
| 6.65652 | 85.25 |
| 6.65845 | 85.229 |
| 6.66038 | 85.207 |
| 6.662310000000001 | 85.189 |
| 6.6642399999999995 | 85.172 |
| 6.66617 | 85.157 |
| 6.668100000000001 | 85.145 |
| 6.67003 | 85.135 |
| 6.67196 | 85.13 |
| 6.67389 | 85.124 |
| 6.67582 | 85.114 |
| 6.67775 | 85.105 |
| 6.67968 | 85.092 |
| 6.68161 | 85.078 |
| 6.68354 | 85.065 |
| 6.6854700000000005 | 85.053 |
| 6.687399999999999 | 85.036 |
| 6.68933 | 85.014 |
| 6.691260000000001 | 84.99 |
| 6.6931899999999995 | 84.961 |
| 6.69512 | 84.931 |
| 6.69705 | 84.903 |
| 6.69898 | 84.875 |
| 6.7009099999999995 | 84.852 |
| 6.70284 | 84.831 |
| 6.704770000000001 | 84.819 |
| 6.7067 | 84.815 |
| 6.70863 | 84.814 |
| 6.71056 | 84.823 |
| 6.71249 | 84.832 |
| 6.7144200000000005 | 84.825 |
| 6.71635 | 84.817 |
| 6.71828 | 84.798 |
| 6.72021 | 84.774 |
| 6.7221400000000004 | 84.749 |
| 6.724069999999999 | 84.724 |
| 6.726 | 84.698 |
| 6.727930000000001 | 84.67 |
| 6.7298599999999995 | 84.641 |
| 6.73179 | 84.61 |
| 6.73372 | 84.578 |
| 6.73565 | 84.549 |
| 6.73758 | 84.522 |
| 6.73951 | 84.498 |
| 6.74144 | 84.478 |
| 6.74337 | 84.459 |
| 6.7453 | 84.446 |
| 6.747229999999999 | 84.432 |
| 6.74916 | 84.42 |
| 6.7510900000000005 | 84.407 |
| 6.75302 | 84.392 |
| 6.75495 | 84.375 |
| 6.75688 | 84.356 |
| 6.75881 | 84.332 |
| 6.76074 | 84.308 |
| 6.76267 | 84.282 |
| 6.764600000000001 | 84.257 |
| 6.7665299999999995 | 84.237 |
| 6.76846 | 84.219 |
| 6.77039 | 84.205 |
| 6.77232 | 84.198 |
| 6.77425 | 84.19 |
| 6.77618 | 84.178 |
| 6.77811 | 84.166 |
| 6.78004 | 84.144 |
| 6.78197 | 84.121 |
| 6.7839 | 84.102 |
| 6.78583 | 84.088 |
| 6.7877600000000005 | 84.08 |
| 6.789689999999999 | 84.087 |
| 6.79162 | 84.095 |
| 6.79355 | 84.088 |
| 6.7954799999999995 | 84.08 |
| 6.79741 | 84.055 |
| 6.79934 | 84.02 |
| 6.801270000000001 | 83.984 |
| 6.8031999999999995 | 83.945 |
| 6.80513 | 83.905 |
| 6.807060000000001 | 83.872 |
| 6.80899 | 83.839 |
| 6.81092 | 83.812 |
| 6.81285 | 83.787 |
| 6.81478 | 83.766 |
| 6.81671 | 83.751 |
| 6.81864 | 83.736 |
| 6.82057 | 83.731 |
| 6.8225 | 83.726 |
| 6.82443 | 83.728 |
| 6.826359999999999 | 83.731 |
| 6.82829 | 83.728 |
| 6.830220000000001 | 83.718 |
| 6.8321499999999995 | 83.706 |
| 6.83408 | 83.679 |
| 6.83601 | 83.652 |
| 6.83794 | 83.624 |
| 6.8398699999999995 | 83.595 |
| 6.8418 | 83.57 |
| 6.84373 | 83.549 |
| 6.84566 | 83.528 |
| 6.84759 | 83.514 |
| 6.84952 | 83.501 |
| 6.85145 | 83.493 |
| 6.8533800000000005 | 83.488 |
| 6.85531 | 83.487 |
| 6.85724 | 83.492 |
| 6.85917 | 83.497 |
| 6.8611 | 83.506 |
| 6.86303 | 83.516 |
| 6.86496 | 83.515 |
| 6.866890000000001 | 83.508 |
| 6.8688199999999995 | 83.495 |
| 6.87075 | 83.469 |
| 6.87268 | 83.442 |
| 6.87461 | 83.409 |
| 6.87654 | 83.377 |
| 6.87847 | 83.347 |
| 6.8804 | 83.318 |
| 6.88233 | 83.292 |
| 6.88426 | 83.272 |
| 6.88619 | 83.252 |
| 6.88812 | 83.236 |
| 6.8900500000000005 | 83.22 |
| 6.891979999999999 | 83.202 |
| 6.89391 | 83.184 |
| 6.89584 | 83.165 |
| 6.89777 | 83.147 |
| 6.8997 | 83.129 |
| 6.90163 | 83.117 |
| 6.903560000000001 | 83.108 |
| 6.9054899999999995 | 83.1 |
| 6.90742 | 83.096 |
| 6.909350000000001 | 83.091 |
| 6.91128 | 83.077 |
| 6.91321 | 83.063 |
| 6.91514 | 83.045 |
| 6.91707 | 83.024 |
| 6.919 | 83.004 |
| 6.92093 | 82.985 |
| 6.92286 | 82.966 |
| 6.92479 | 82.951 |
| 6.92672 | 82.936 |
| 6.928649999999999 | 82.922 |
| 6.93058 | 82.908 |
| 6.932510000000001 | 82.894 |
| 6.9344399999999995 | 82.878 |
| 6.93637 | 82.863 |
| 6.9383 | 82.846 |
| 6.94023 | 82.83 |
| 6.942159999999999 | 82.813 |
| 6.94409 | 82.795 |
| 6.946020000000001 | 82.777 |
| 6.94795 | 82.757 |
| 6.94988 | 82.738 |
| 6.95181 | 82.719 |
| 6.95374 | 82.703 |
| 6.9556700000000005 | 82.687 |
| 6.9576 | 82.685 |
| 6.95953 | 82.683 |
| 6.96146 | 82.681 |
| 6.96339 | 82.68 |
| 6.965319999999999 | 82.676 |
| 6.96725 | 82.655 |
| 6.969180000000001 | 82.633 |
| 6.9711099999999995 | 82.608 |
| 6.97304 | 82.581 |
| 6.97497 | 82.555 |
| 6.9769 | 82.534 |
| 6.97883 | 82.512 |
| 6.98076 | 82.494 |
| 6.98269 | 82.477 |
| 6.98462 | 82.462 |
| 6.98655 | 82.448 |
| 6.988479999999999 | 82.435 |
| 6.99041 | 82.426 |
| 6.99234 | 82.417 |
| 6.99427 | 82.407 |
| 6.9962 | 82.394 |
| 6.99813 | 82.381 |
| 7.00006 | 82.359 |
| 7.00199 | 82.336 |
| 7.00392 | 82.313 |
| 7.005850000000001 | 82.288 |
| 7.0077799999999995 | 82.264 |
| 7.00971 | 82.243 |
| 7.011640000000001 | 82.221 |
| 7.01357 | 82.203 |
| 7.0155 | 82.186 |
| 7.01743 | 82.172 |
| 7.01936 | 82.163 |
| 7.02129 | 82.155 |
| 7.02322 | 82.148 |
| 7.02515 | 82.142 |
| 7.02708 | 82.131 |
| 7.02901 | 82.113 |
| 7.030939999999999 | 82.095 |
| 7.03287 | 82.068 |
| 7.034800000000001 | 82.041 |
| 7.0367299999999995 | 82.015 |
| 7.03866 | 81.993 |
| 7.04059 | 81.97 |
| 7.042520000000001 | 81.965 |
| 7.044449999999999 | 81.961 |
| 7.04638 | 81.959 |
| 7.048310000000001 | 81.961 |
| 7.05024 | 81.962 |
| 7.05217 | 81.945 |
| 7.0541 | 81.929 |
| 7.05603 | 81.91 |
| 7.0579600000000005 | 81.887 |
| 7.05989 | 81.864 |
| 7.06182 | 81.842 |
| 7.06375 | 81.82 |
| 7.06568 | 81.798 |
| 7.067609999999999 | 81.777 |
| 7.06954 | 81.755 |
| 7.071470000000001 | 81.734 |
| 7.0733999999999995 | 81.712 |
| 7.07533 | 81.693 |
| 7.07726 | 81.675 |
| 7.07919 | 81.657 |
| 7.08112 | 81.642 |
| 7.08305 | 81.627 |
| 7.08498 | 81.612 |
| 7.08691 | 81.597 |
| 7.08884 | 81.582 |
| 7.09077 | 81.565 |
| 7.0927 | 81.548 |
| 7.09463 | 81.531 |
| 7.09656 | 81.513 |
| 7.09849 | 81.496 |
| 7.10042 | 81.48 |
| 7.10235 | 81.463 |
| 7.10428 | 81.448 |
| 7.10621 | 81.433 |
| 7.108140000000001 | 81.418 |
| 7.1100699999999994 | 81.407 |
| 7.112 | 81.396 |
| 7.11393 | 81.386 |
| 7.11586 | 81.376 |
| 7.11779 | 81.367 |
| 7.11972 | 81.352 |
| 7.12165 | 81.336 |
| 7.12358 | 81.318 |
| 7.12551 | 81.296 |
| 7.12744 | 81.273 |
| 7.12937 | 81.252 |
| 7.1313 | 81.23 |
| 7.133229999999999 | 81.209 |
| 7.13516 | 81.192 |
| 7.13709 | 81.174 |
| 7.13902 | 81.162 |
| 7.14095 | 81.151 |
| 7.14288 | 81.142 |
| 7.1448100000000005 | 81.138 |
| 7.146739999999999 | 81.135 |
| 7.14867 | 81.129 |
| 7.150600000000001 | 81.122 |
| 7.15253 | 81.114 |
| 7.15446 | 81.094 |
| 7.15639 | 81.075 |
| 7.15832 | 81.054 |
| 7.16025 | 81.032 |
| 7.16218 | 81.01 |
| 7.16411 | 80.997 |
| 7.16604 | 80.983 |
| 7.16797 | 80.973 |
| 7.169899999999999 | 80.967 |
| 7.17183 | 80.961 |
| 7.173760000000001 | 80.949 |
| 7.1756899999999995 | 80.936 |
| 7.17762 | 80.921 |
| 7.17955 | 80.899 |
| 7.18148 | 80.877 |
| 7.18341 | 80.855 |
| 7.18534 | 80.832 |
| 7.187270000000001 | 80.81 |
| 7.1892 | 80.789 |
| 7.19113 | 80.768 |
| 7.19306 | 80.747 |
| 7.19499 | 80.725 |
| 7.19692 | 80.703 |
| 7.19885 | 80.682 |
| 7.20078 | 80.661 |
| 7.20271 | 80.642 |
| 7.20464 | 80.627 |
| 7.20657 | 80.612 |
| 7.2085 | 80.6 |
| 7.210430000000001 | 80.589 |
| 7.212359999999999 | 80.576 |
| 7.21429 | 80.559 |
| 7.21622 | 80.541 |
| 7.21815 | 80.52 |
| 7.22008 | 80.498 |
| 7.22201 | 80.476 |
| 7.22394 | 80.456 |
| 7.22587 | 80.437 |
| 7.2278 | 80.42 |
| 7.22973 | 80.406 |
| 7.23166 | 80.392 |
| 7.23359 | 80.379 |
| 7.23552 | 80.368 |
| 7.23745 | 80.356 |
| 7.23938 | 80.345 |
| 7.24131 | 80.333 |
| 7.24324 | 80.321 |
| 7.24517 | 80.31 |
| 7.2471000000000005 | 80.297 |
| 7.249029999999999 | 80.285 |
| 7.25096 | 80.273 |
| 7.252890000000001 | 80.261 |
| 7.25482 | 80.248 |
| 7.25675 | 80.236 |
| 7.25868 | 80.223 |
| 7.26061 | 80.209 |
| 7.2625399999999996 | 80.195 |
| 7.26447 | 80.181 |
| 7.2664 | 80.166 |
| 7.26833 | 80.152 |
| 7.27026 | 80.14 |
| 7.272189999999999 | 80.128 |
| 7.27412 | 80.116 |
| 7.276050000000001 | 80.105 |
| 7.2779799999999994 | 80.093 |
| 7.27991 | 80.077 |
| 7.28184 | 80.061 |
| 7.2837700000000005 | 80.043 |
| 7.285699999999999 | 80.025 |
| 7.28763 | 80.006 |
| 7.289560000000001 | 79.988 |
| 7.29149 | 79.971 |
| 7.29342 | 79.954 |
| 7.29535 | 79.939 |
| 7.29728 | 79.924 |
| 7.29921 | 79.91 |
| 7.30114 | 79.898 |
| 7.30307 | 79.886 |
| 7.305 | 79.875 |
| 7.30693 | 79.864 |
| 7.308859999999999 | 79.854 |
| 7.31079 | 79.842 |
| 7.3127200000000006 | 79.829 |
| 7.314649999999999 | 79.815 |
| 7.31658 | 79.799 |
| 7.31851 | 79.784 |
| 7.32044 | 79.766 |
| 7.32237 | 79.747 |
| 7.3243 | 79.729 |
| 7.32623 | 79.712 |
| 7.32816 | 79.696 |
| 7.33009 | 79.681 |
| 7.332020000000001 | 79.67 |
| 7.33395 | 79.66 |
| 7.33588 | 79.652 |
| 7.33781 | 79.646 |
| 7.33974 | 79.639 |
| 7.34167 | 79.626 |
| 7.3436 | 79.613 |
| 7.34553 | 79.598 |
| 7.34746 | 79.578 |
| 7.3493900000000005 | 79.557 |
| 7.351319999999999 | 79.538 |
| 7.35325 | 79.518 |
| 7.355180000000001 | 79.499 |
| 7.35711 | 79.483 |
| 7.35904 | 79.467 |
| 7.36097 | 79.452 |
| 7.3629 | 79.437 |
| 7.3648299999999995 | 79.422 |
| 7.36676 | 79.407 |
| 7.36869 | 79.39 |
| 7.37062 | 79.374 |
| 7.37255 | 79.358 |
| 7.374479999999999 | 79.341 |
| 7.37641 | 79.326 |
| 7.378340000000001 | 79.311 |
| 7.38027 | 79.297 |
| 7.3822 | 79.282 |
| 7.38413 | 79.266 |
| 7.3860600000000005 | 79.251 |
| 7.387989999999999 | 79.235 |
| 7.38992 | 79.219 |
| 7.391850000000001 | 79.202 |
| 7.39378 | 79.187 |
| 7.39571 | 79.172 |
| 7.39764 | 79.158 |
| 7.39957 | 79.144 |
| 7.4015 | 79.131 |
| 7.40343 | 79.119 |
| 7.40536 | 79.107 |
| 7.40729 | 79.096 |
| 7.40922 | 79.085 |
| 7.411149999999999 | 79.074 |
| 7.41308 | 79.063 |
| 7.4150100000000005 | 79.051 |
| 7.416939999999999 | 79.038 |
| 7.41887 | 79.025 |
| 7.4208 | 79.01 |
| 7.42273 | 78.994 |
| 7.42466 | 78.978 |
| 7.42659 | 78.961 |
| 7.428520000000001 | 78.944 |
| 7.4304499999999996 | 78.927 |
| 7.43238 | 78.91 |
| 7.43431 | 78.892 |
| 7.43624 | 78.874 |
| 7.43817 | 78.856 |
| 7.4401 | 78.837 |
| 7.44203 | 78.819 |
| 7.44396 | 78.8 |
| 7.44589 | 78.782 |
| 7.44782 | 78.765 |
| 7.44975 | 78.749 |
| 7.4516800000000005 | 78.735 |
| 7.453609999999999 | 78.723 |
| 7.45554 | 78.71 |
| 7.45747 | 78.703 |
| 7.4594 | 78.696 |
| 7.46133 | 78.689 |
| 7.46326 | 78.681 |
| 7.46519 | 78.672 |
| 7.4671199999999995 | 78.662 |
| 7.46905 | 78.645 |
| 7.47098 | 78.629 |
| 7.47291 | 78.612 |
| 7.47484 | 78.593 |
| 7.47677 | 78.575 |
| 7.4787 | 78.558 |
| 7.48063 | 78.541 |
| 7.48256 | 78.525 |
| 7.48449 | 78.508 |
| 7.48642 | 78.492 |
| 7.4883500000000005 | 78.475 |
| 7.490279999999999 | 78.456 |
| 7.49221 | 78.437 |
| 7.494140000000001 | 78.418 |
| 7.49607 | 78.399 |
| 7.498 | 78.379 |
| 7.49993 | 78.36 |
| 7.50186 | 78.342 |
| 7.50379 | 78.323 |
| 7.50572 | 78.307 |
| 7.50765 | 78.292 |
| 7.50958 | 78.276 |
| 7.51151 | 78.263 |
| 7.513439999999999 | 78.25 |
| 7.51537 | 78.236 |
| 7.5173000000000005 | 78.223 |
| 7.519229999999999 | 78.209 |
| 7.52116 | 78.194 |
| 7.52309 | 78.179 |
| 7.5250200000000005 | 78.163 |
| 7.52695 | 78.146 |
| 7.52888 | 78.128 |
| 7.530810000000001 | 78.11 |
| 7.5327399999999995 | 78.093 |
| 7.53467 | 78.076 |
| 7.5366 | 78.058 |
| 7.53853 | 78.043 |
| 7.54046 | 78.027 |
| 7.54239 | 78.012 |
| 7.54432 | 77.998 |
| 7.54625 | 77.984 |
| 7.54818 | 77.97 |
| 7.55011 | 77.957 |
| 7.55204 | 77.943 |
| 7.5539700000000005 | 77.93 |
| 7.555899999999999 | 77.917 |
| 7.55783 | 77.904 |
| 7.55976 | 77.89 |
| 7.56169 | 77.877 |
| 7.56362 | 77.863 |
| 7.56555 | 77.849 |
| 7.56748 | 77.834 |
| 7.5694099999999995 | 77.819 |
| 7.57134 | 77.804 |
| 7.573270000000001 | 77.789 |
| 7.5752 | 77.774 |
| 7.57713 | 77.76 |
| 7.57906 | 77.746 |
| 7.58099 | 77.733 |
| 7.58292 | 77.719 |
| 7.58485 | 77.705 |
| 7.58678 | 77.691 |
| 7.58871 | 77.677 |
| 7.5906400000000005 | 77.663 |
| 7.592569999999999 | 77.649 |
| 7.5945 | 77.635 |
| 7.596430000000001 | 77.622 |
| 7.59835 | 77.608 |
| 7.60028 | 77.594 |
| 7.60221 | 77.58 |
| 7.60414 | 77.565 |
| 7.60607 | 77.549 |
| 7.608 | 77.533 |
| 7.60993 | 77.517 |
| 7.61186 | 77.5 |
| 7.61379 | 77.484 |
| 7.6157200000000005 | 77.468 |
| 7.617649999999999 | 77.454 |
| 7.61958 | 77.439 |
| 7.62151 | 77.426 |
| 7.6234399999999996 | 77.414 |
| 7.62537 | 77.401 |
| 7.6273 | 77.388 |
| 7.62923 | 77.375 |
| 7.6311599999999995 | 77.362 |
| 7.63309 | 77.348 |
| 7.635020000000001 | 77.335 |
| 7.63695 | 77.322 |
| 7.63888 | 77.31 |
| 7.64081 | 77.299 |
| 7.64274 | 77.288 |
| 7.64467 | 77.278 |
| 7.6466 | 77.268 |
| 7.64853 | 77.258 |
| 7.65046 | 77.247 |
| 7.6523900000000005 | 77.236 |
| 7.654319999999999 | 77.225 |
| 7.65625 | 77.212 |
| 7.658180000000001 | 77.198 |
| 7.6601099999999995 | 77.184 |
| 7.66204 | 77.169 |
| 7.66397 | 77.154 |
| 7.6659 | 77.139 |
| 7.66783 | 77.123 |
| 7.66976 | 77.108 |
| 7.67169 | 77.093 |
| 7.67362 | 77.08 |
| 7.67555 | 77.066 |
| 7.677479999999999 | 77.055 |
| 7.67941 | 77.045 |
| 7.6813400000000005 | 77.035 |
| 7.68327 | 77.025 |
| 7.6852 | 77.015 |
| 7.68713 | 77.005 |
| 7.6890600000000004 | 76.992 |
| 7.69099 | 76.977 |
| 7.69292 | 76.961 |
| 7.694850000000001 | 76.943 |
| 7.6967799999999995 | 76.924 |
| 7.69871 | 76.904 |
| 7.70064 | 76.886 |
| 7.70257 | 76.869 |
| 7.7045 | 76.852 |
| 7.70643 | 76.839 |
| 7.70836 | 76.826 |
| 7.71029 | 76.814 |
| 7.71222 | 76.801 |
| 7.71415 | 76.789 |
| 7.71608 | 76.776 |
| 7.7180100000000005 | 76.762 |
| 7.719939999999999 | 76.747 |
| 7.72187 | 76.731 |
| 7.7238 | 76.716 |
| 7.7257299999999995 | 76.699 |
| 7.72766 | 76.683 |
| 7.72959 | 76.668 |
| 7.731520000000001 | 76.652 |
| 7.7334499999999995 | 76.636 |
| 7.73538 | 76.621 |
| 7.737310000000001 | 76.605 |
| 7.73924 | 76.589 |
| 7.74117 | 76.573 |
| 7.7431 | 76.557 |
| 7.74503 | 76.541 |
| 7.74696 | 76.526 |
| 7.74889 | 76.51 |
| 7.75082 | 76.494 |
| 7.75275 | 76.479 |
| 7.7546800000000005 | 76.464 |
| 7.756609999999999 | 76.448 |
| 7.75854 | 76.433 |
| 7.760470000000001 | 76.418 |
| 7.7623999999999995 | 76.404 |
| 7.76433 | 76.389 |
| 7.76626 | 76.374 |
| 7.76819 | 76.36 |
| 7.7701199999999995 | 76.345 |
| 7.77205 | 76.33 |
| 7.77398 | 76.315 |
| 7.77591 | 76.299 |
| 7.77784 | 76.283 |
| 7.77977 | 76.267 |
| 7.7817 | 76.25 |
| 7.7836300000000005 | 76.233 |
| 7.78556 | 76.216 |
| 7.78749 | 76.199 |
| 7.78942 | 76.183 |
| 7.79135 | 76.166 |
| 7.793279999999999 | 76.15 |
| 7.79521 | 76.134 |
| 7.797140000000001 | 76.118 |
| 7.7990699999999995 | 76.103 |
| 7.801 | 76.088 |
| 7.80293 | 76.073 |
| 7.80486 | 76.058 |
| 7.80679 | 76.043 |
| 7.80872 | 76.028 |
| 7.81065 | 76.014 |
| 7.81258 | 76 |
| 7.81451 | 75.985 |
| 7.816439999999999 | 75.971 |
| 7.81837 | 75.956 |
| 7.8203000000000005 | 75.941 |
| 7.822229999999999 | 75.925 |
| 7.82416 | 75.908 |
| 7.82609 | 75.892 |
| 7.82802 | 75.875 |
| 7.82995 | 75.859 |
| 7.83188 | 75.842 |
| 7.833810000000001 | 75.827 |
| 7.8357399999999995 | 75.812 |
| 7.83767 | 75.798 |
| 7.839600000000001 | 75.783 |
| 7.84153 | 75.77 |
| 7.84346 | 75.757 |
| 7.84539 | 75.743 |
| 7.84732 | 75.729 |
| 7.84925 | 75.715 |
| 7.85118 | 75.7 |
| 7.85311 | 75.685 |
| 7.85504 | 75.671 |
| 7.8569700000000005 | 75.656 |
| 7.858899999999999 | 75.641 |
| 7.86083 | 75.626 |
| 7.862760000000001 | 75.611 |
| 7.8646899999999995 | 75.597 |
| 7.86662 | 75.584 |
| 7.86855 | 75.57 |
| 7.87048 | 75.557 |
| 7.8724099999999995 | 75.545 |
| 7.87434 | 75.532 |
| 7.876270000000001 | 75.519 |
| 7.8782 | 75.506 |
| 7.88013 | 75.492 |
| 7.88206 | 75.478 |
| 7.88399 | 75.463 |
| 7.8859200000000005 | 75.448 |
| 7.88785 | 75.433 |
| 7.88978 | 75.419 |
| 7.89171 | 75.404 |
| 7.89364 | 75.39 |
| 7.895569999999999 | 75.376 |
| 7.8975 | 75.362 |
| 7.899430000000001 | 75.349 |
| 7.9013599999999995 | 75.336 |
| 7.90329 | 75.323 |
| 7.90522 | 75.309 |
| 7.90715 | 75.296 |
| 7.90908 | 75.282 |
| 7.91101 | 75.268 |
| 7.91294 | 75.253 |
| 7.91487 | 75.238 |
| 7.9168 | 75.223 |
| 7.918729999999999 | 75.208 |
| 7.92066 | 75.192 |
| 7.9225900000000005 | 75.177 |
| 7.92452 | 75.162 |
| 7.92645 | 75.146 |
| 7.92838 | 75.131 |
| 7.93031 | 75.117 |
| 7.93224 | 75.102 |
| 7.93417 | 75.088 |
| 7.936100000000001 | 75.074 |
| 7.9380299999999995 | 75.061 |
| 7.93996 | 75.047 |
| 7.94189 | 75.034 |
| 7.94382 | 75.02 |
| 7.94575 | 75.007 |
| 7.94768 | 74.993 |
| 7.94961 | 74.98 |
| 7.95154 | 74.967 |
| 7.95347 | 74.954 |
| 7.9554 | 74.94 |
| 7.95733 | 74.927 |
| 7.9592600000000004 | 74.913 |
| 7.961189999999999 | 74.898 |
| 7.96312 | 74.883 |
| 7.96505 | 74.868 |
| 7.9669799999999995 | 74.853 |
| 7.96891 | 74.837 |
| 7.97084 | 74.821 |
| 7.972770000000001 | 74.806 |
| 7.9746999999999995 | 74.791 |
| 7.97663 | 74.776 |
| 7.978560000000001 | 74.762 |
| 7.98049 | 74.748 |
| 7.98242 | 74.734 |
| 7.98435 | 74.721 |
| 7.98628 | 74.707 |
| 7.9882100000000005 | 74.694 |
| 7.99014 | 74.681 |
| 7.99207 | 74.667 |
| 7.994 | 74.653 |
| 7.99593 | 74.64 |
| 7.997859999999999 | 74.626 |
| 7.99979 | 74.612 |
| 8.00172 | 74.599 |
| 8.00365 | 74.585 |
| 8.00558 | 74.572 |
| 8.00751 | 74.559 |
| 8.00944 | 74.545 |
| 8.01137 | 74.532 |
| 8.013300000000001 | 74.518 |
| 8.015229999999999 | 74.504 |
| 8.01716 | 74.49 |
| 8.01909 | 74.476 |
| 8.02102 | 74.462 |
| 8.02295 | 74.448 |
| 8.02488 | 74.433 |
| 8.026810000000001 | 74.419 |
| 8.028739999999999 | 74.404 |
| 8.03067 | 74.39 |
| 8.0326 | 74.375 |
| 8.03453 | 74.361 |
| 8.03646 | 74.347 |
| 8.03839 | 74.332 |
| 8.04032 | 74.318 |
| 8.04225 | 74.305 |
| 8.04418 | 74.291 |
| 8.04611 | 74.277 |
| 8.04804 | 74.263 |
| 8.04997 | 74.25 |
| 8.0519 | 74.236 |
| 8.05383 | 74.221 |
| 8.05576 | 74.207 |
| 8.05769 | 74.192 |
| 8.05962 | 74.178 |
| 8.06155 | 74.163 |
| 8.06348 | 74.149 |
| 8.06541 | 74.134 |
| 8.06734 | 74.12 |
| 8.069270000000001 | 74.106 |
| 8.0712 | 74.091 |
| 8.07313 | 74.077 |
| 8.07506 | 74.063 |
| 8.07699 | 74.048 |
| 8.07892 | 74.035 |
| 8.08085 | 74.021 |
| 8.08278 | 74.007 |
| 8.08471 | 73.994 |
| 8.086640000000001 | 73.981 |
| 8.088569999999999 | 73.969 |
| 8.0905 | 73.956 |
| 8.09243 | 73.942 |
| 8.09436 | 73.929 |
| 8.09629 | 73.915 |
| 8.09822 | 73.9 |
| 8.10015 | 73.885 |
| 8.102079999999999 | 73.869 |
| 8.10401 | 73.853 |
| 8.10594 | 73.838 |
| 8.10787 | 73.822 |
| 8.1098 | 73.807 |
| 8.11173 | 73.793 |
| 8.11366 | 73.779 |
| 8.115590000000001 | 73.765 |
| 8.11752 | 73.753 |
| 8.11945 | 73.741 |
| 8.12138 | 73.728 |
| 8.12331 | 73.715 |
| 8.12524 | 73.703 |
| 8.12717 | 73.69 |
| 8.129100000000001 | 73.676 |
| 8.131029999999999 | 73.662 |
| 8.13296 | 73.648 |
| 8.13489 | 73.633 |
| 8.13682 | 73.619 |
| 8.13875 | 73.605 |
| 8.14068 | 73.59 |
| 8.14261 | 73.577 |
| 8.14454 | 73.563 |
| 8.14647 | 73.55 |
| 8.148399999999999 | 73.537 |
| 8.15033 | 73.524 |
| 8.15226 | 73.511 |
| 8.15419 | 73.498 |
| 8.15612 | 73.484 |
| 8.15805 | 73.471 |
| 8.15998 | 73.457 |
| 8.16191 | 73.443 |
| 8.16384 | 73.429 |
| 8.16577 | 73.415 |
| 8.1677 | 73.401 |
| 8.16963 | 73.388 |
| 8.171560000000001 | 73.374 |
| 8.17349 | 73.361 |
| 8.17542 | 73.348 |
| 8.17735 | 73.335 |
| 8.17928 | 73.322 |
| 8.18121 | 73.309 |
| 8.18314 | 73.296 |
| 8.18507 | 73.283 |
| 8.187 | 73.269 |
| 8.188930000000001 | 73.256 |
| 8.190859999999999 | 73.243 |
| 8.19279 | 73.23 |
| 8.19472 | 73.216 |
| 8.19665 | 73.202 |
| 8.19858 | 73.188 |
| 8.20051 | 73.174 |
| 8.202440000000001 | 73.159 |
| 8.20437 | 73.144 |
| 8.206299999999999 | 73.13 |
| 8.20823 | 73.115 |
| 8.21016 | 73.101 |
| 8.21209 | 73.088 |
| 8.21402 | 73.076 |
| 8.215950000000001 | 73.063 |
| 8.21788 | 73.051 |
| 8.219809999999999 | 73.04 |
| 8.22174 | 73.029 |
| 8.22367 | 73.018 |
| 8.2256 | 73.007 |
| 8.22753 | 72.995 |
| 8.22946 | 72.983 |
| 8.23139 | 72.971 |
| 8.233319999999999 | 72.958 |
| 8.23525 | 72.945 |
| 8.23718 | 72.932 |
| 8.23911 | 72.919 |
| 8.241040000000002 | 72.907 |
| 8.24297 | 72.894 |
| 8.2449 | 72.882 |
| 8.24683 | 72.87 |
| 8.24876 | 72.859 |
| 8.25069 | 72.847 |
| 8.25262 | 72.836 |
| 8.25455 | 72.825 |
| 8.25648 | 72.814 |
| 8.25841 | 72.802 |
| 8.26034 | 72.79 |
| 8.262270000000001 | 72.778 |
| 8.2642 | 72.766 |
| 8.266129999999999 | 72.753 |
| 8.26806 | 72.741 |
| 8.26999 | 72.729 |
| 8.27192 | 72.717 |
| 8.27385 | 72.705 |
| 8.275780000000001 | 72.694 |
| 8.277709999999999 | 72.682 |
| 8.279639999999999 | 72.67 |
| 8.28157 | 72.659 |
| 8.2835 | 72.647 |
| 8.28543 | 72.635 |
| 8.287360000000001 | 72.624 |
| 8.289290000000001 | 72.613 |
| 8.29122 | 72.602 |
| 8.293149999999999 | 72.591 |
| 8.29508 | 72.58 |
| 8.29701 | 72.569 |
| 8.29894 | 72.557 |
| 8.300870000000002 | 72.546 |
| 8.3028 | 72.535 |
| 8.30473 | 72.523 |
| 8.306659999999999 | 72.51 |
| 8.30859 | 72.498 |
| 8.31052 | 72.485 |
| 8.31245 | 72.473 |
| 8.31438 | 72.46 |
| 8.31631 | 72.448 |
| 8.31824 | 72.436 |
| 8.320170000000001 | 72.424 |
| 8.3221 | 72.413 |
| 8.32403 | 72.401 |
| 8.325959999999998 | 72.39 |
| 8.32789 | 72.379 |
| 8.32982 | 72.368 |
| 8.33175 | 72.357 |
| 8.333680000000001 | 72.345 |
| 8.33561 | 72.334 |
| 8.33754 | 72.323 |
| 8.339469999999999 | 72.312 |
| 8.3414 | 72.301 |
| 8.34333 | 72.289 |
| 8.34526 | 72.278 |
| 8.347190000000001 | 72.267 |
| 8.349120000000001 | 72.256 |
| 8.351049999999999 | 72.245 |
| 8.352979999999999 | 72.235 |
| 8.35491 | 72.225 |
| 8.35684 | 72.214 |
| 8.35877 | 72.205 |
| 8.360700000000001 | 72.195 |
| 8.36263 | 72.186 |
| 8.364559999999999 | 72.177 |
| 8.36649 | 72.167 |
| 8.36842 | 72.158 |
| 8.37035 | 72.148 |
| 8.37228 | 72.137 |
| 8.37421 | 72.127 |
| 8.37614 | 72.116 |
| 8.37807 | 72.104 |
| 8.38 | 72.092 |
| 8.38193 | 72.08 |
| 8.38386 | 72.067 |
| 8.38579 | 72.054 |
| 8.38772 | 72.041 |
| 8.38965 | 72.027 |
| 8.39158 | 72.014 |
| 8.393510000000001 | 72.001 |
| 8.39544 | 71.988 |
| 8.39737 | 71.974 |
| 8.399299999999998 | 71.961 |
| 8.40123 | 71.947 |
| 8.40316 | 71.934 |
| 8.40509 | 71.92 |
| 8.407020000000001 | 71.907 |
| 8.40895 | 71.893 |
| 8.410879999999999 | 71.879 |
| 8.41281 | 71.866 |
| 8.41474 | 71.852 |
| 8.41667 | 71.839 |
| 8.4186 | 71.827 |
| 8.420530000000001 | 71.815 |
| 8.42246 | 71.804 |
| 8.424389999999999 | 71.793 |
| 8.42632 | 71.782 |
| 8.42825 | 71.772 |
| 8.43018 | 71.761 |
| 8.43211 | 71.75 |
| 8.434040000000001 | 71.738 |
| 8.43597 | 71.726 |
| 8.437899999999999 | 71.714 |
| 8.43983 | 71.701 |
| 8.44176 | 71.687 |
| 8.44369 | 71.673 |
| 8.445620000000002 | 71.659 |
| 8.44755 | 71.644 |
| 8.44948 | 71.629 |
| 8.45141 | 71.614 |
| 8.45334 | 71.599 |
| 8.45527 | 71.582 |
| 8.4572 | 71.565 |
| 8.45913 | 71.549 |
| 8.46106 | 71.53 |
| 8.46299 | 71.512 |
| 8.46492 | 71.494 |
| 8.46685 | 71.477 |
| 8.46878 | 71.461 |
| 8.470709999999999 | 71.445 |
| 8.47264 | 71.429 |
| 8.47457 | 71.415 |
| 8.4765 | 71.403 |
| 8.47843 | 71.39 |
| 8.480360000000001 | 71.378 |
| 8.48229 | 71.366 |
| 8.484219999999999 | 71.354 |
| 8.48615 | 71.342 |
| 8.48808 | 71.329 |
| 8.49001 | 71.315 |
| 8.491940000000001 | 71.301 |
| 8.493870000000001 | 71.287 |
| 8.4958 | 71.272 |
| 8.497729999999999 | 71.257 |
| 8.49966 | 71.242 |
| 8.50159 | 71.227 |
| 8.50352 | 71.212 |
| 8.505450000000002 | 71.197 |
| 8.50738 | 71.182 |
| 8.50931 | 71.167 |
| 8.511239999999999 | 71.152 |
| 8.51317 | 71.137 |
| 8.5151 | 71.122 |
| 8.51703 | 71.106 |
| 8.51896 | 71.091 |
| 8.52089 | 71.076 |
| 8.52282 | 71.061 |
| 8.52475 | 71.046 |
| 8.52668 | 71.031 |
| 8.52861 | 71.017 |
| 8.53054 | 71.002 |
| 8.53247 | 70.988 |
| 8.5344 | 70.974 |
| 8.53633 | 70.96 |
| 8.538260000000001 | 70.946 |
| 8.54019 | 70.932 |
| 8.54212 | 70.918 |
| 8.544049999999999 | 70.903 |
| 8.54598 | 70.889 |
| 8.54791 | 70.875 |
| 8.54984 | 70.86 |
| 8.551770000000001 | 70.846 |
| 8.553700000000001 | 70.831 |
| 8.555629999999999 | 70.816 |
| 8.557559999999999 | 70.802 |
| 8.55949 | 70.788 |
| 8.56142 | 70.774 |
| 8.56335 | 70.759 |
| 8.565280000000001 | 70.745 |
| 8.56721 | 70.731 |
| 8.569139999999999 | 70.718 |
| 8.571069999999999 | 70.704 |
| 8.573 | 70.69 |
| 8.57493 | 70.677 |
| 8.57686 | 70.664 |
| 8.578790000000001 | 70.651 |
| 8.58072 | 70.638 |
| 8.58265 | 70.625 |
| 8.58458 | 70.612 |
| 8.58651 | 70.6 |
| 8.58844 | 70.587 |
| 8.59037 | 70.574 |
| 8.5923 | 70.561 |
| 8.59423 | 70.548 |
| 8.59616 | 70.534 |
| 8.598090000000001 | 70.521 |
| 8.60002 | 70.507 |
| 8.60195 | 70.493 |
| 8.603879999999998 | 70.479 |
| 8.60581 | 70.465 |
| 8.60774 | 70.451 |
| 8.60967 | 70.438 |
| 8.611600000000001 | 70.424 |
| 8.61353 | 70.411 |
| 8.615459999999999 | 70.397 |
| 8.617389999999999 | 70.384 |
| 8.61932 | 70.37 |
| 8.62125 | 70.357 |
| 8.62318 | 70.343 |
| 8.625110000000001 | 70.329 |
| 8.627040000000001 | 70.315 |
| 8.628969999999999 | 70.301 |
| 8.6309 | 70.288 |
| 8.63283 | 70.274 |
| 8.63476 | 70.261 |
| 8.63669 | 70.248 |
| 8.638620000000001 | 70.235 |
| 8.64055 | 70.223 |
| 8.642479999999999 | 70.21 |
| 8.64441 | 70.198 |
| 8.64634 | 70.186 |
| 8.64827 | 70.174 |
| 8.6502 | 70.162 |
| 8.65213 | 70.149 |
| 8.65406 | 70.136 |
| 8.65599 | 70.123 |
| 8.65792 | 70.11 |
| 8.65985 | 70.098 |
| 8.66178 | 70.085 |
| 8.663709999999998 | 70.072 |
| 8.66564 | 70.06 |
| 8.66757 | 70.049 |
| 8.6695 | 70.037 |
| 8.67143 | 70.026 |
| 8.67336 | 70.015 |
| 8.67529 | 70.004 |
| 8.67722 | 69.994 |
| 8.67915 | 69.983 |
| 8.68108 | 69.972 |
| 8.68301 | 69.96 |
| 8.684940000000001 | 69.949 |
| 8.68687 | 69.936 |
| 8.688799999999999 | 69.924 |
| 8.69073 | 69.911 |
| 8.69266 | 69.898 |
| 8.69459 | 69.886 |
| 8.69652 | 69.873 |
| 8.698450000000001 | 69.86 |
| 8.70038 | 69.848 |
| 8.702309999999999 | 69.836 |
| 8.70424 | 69.824 |
| 8.70617 | 69.813 |
| 8.7081 | 69.801 |
| 8.710030000000001 | 69.79 |
| 8.71196 | 69.779 |
| 8.71389 | 69.768 |
| 8.715819999999999 | 69.757 |
| 8.71775 | 69.746 |
| 8.71968 | 69.735 |
| 8.72161 | 69.723 |
| 8.723540000000002 | 69.712 |
| 8.72547 | 69.701 |
| 8.7274 | 69.69 |
| 8.72933 | 69.679 |
| 8.73126 | 69.668 |
| 8.73319 | 69.657 |
| 8.73512 | 69.646 |
| 8.73705 | 69.635 |
| 8.73898 | 69.623 |
| 8.74091 | 69.612 |
| 8.74284 | 69.6 |
| 8.74477 | 69.589 |
| 8.7467 | 69.575 |
| 8.748629999999999 | 69.562 |
| 8.75056 | 69.549 |
| 8.75249 | 69.536 |
| 8.75442 | 69.522 |
| 8.756350000000001 | 69.508 |
| 8.758280000000001 | 69.495 |
| 8.760209999999999 | 69.481 |
| 8.762139999999999 | 69.468 |
| 8.76407 | 69.455 |
| 8.766 | 69.441 |
| 8.76793 | 69.428 |
| 8.769860000000001 | 69.415 |
| 8.771790000000001 | 69.402 |
| 8.773719999999999 | 69.389 |
| 8.775649999999999 | 69.375 |
| 8.77758 | 69.361 |
| 8.77951 | 69.348 |
| 8.78144 | 69.334 |
| 8.783370000000001 | 69.321 |
| 8.7853 | 69.308 |
| 8.78723 | 69.295 |
| 8.789159999999999 | 69.282 |
| 8.79109 | 69.271 |
| 8.79302 | 69.26 |
| 8.79495 | 69.249 |
| 8.79688 | 69.239 |
| 8.79881 | 69.229 |
| 8.80074 | 69.218 |
| 8.80267 | 69.208 |
| 8.8046 | 69.198 |
| 8.80653 | 69.186 |
| 8.808459999999998 | 69.173 |
| 8.81039 | 69.161 |
| 8.81232 | 69.149 |
| 8.81425 | 69.135 |
| 8.816180000000001 | 69.122 |
| 8.81811 | 69.108 |
| 8.82004 | 69.095 |
| 8.821969999999999 | 69.082 |
| 8.8239 | 69.07 |
| 8.82583 | 69.057 |
| 8.82776 | 69.045 |
| 8.829690000000001 | 69.034 |
| 8.831620000000001 | 69.023 |
| 8.833549999999999 | 69.011 |
| 8.83548 | 69.001 |
| 8.83741 | 68.99 |
| 8.83934 | 68.98 |
| 8.84127 | 68.969 |
| 8.843200000000001 | 68.959 |
| 8.84513 | 68.95 |
| 8.847059999999999 | 68.94 |
| 8.84899 | 68.931 |
| 8.85092 | 68.922 |
| 8.85285 | 68.913 |
| 8.85478 | 68.904 |
| 8.85671 | 68.895 |
| 8.85864 | 68.886 |
| 8.86057 | 68.876 |
| 8.8625 | 68.866 |
| 8.86443 | 68.856 |
| 8.86636 | 68.843 |
| 8.86829 | 68.83 |
| 8.87022 | 68.817 |
| 8.87215 | 68.803 |
| 8.87408 | 68.787 |
| 8.87601 | 68.772 |
| 8.87794 | 68.756 |
| 8.87987 | 68.74 |
| 8.8818 | 68.725 |
| 8.88373 | 68.71 |
| 8.88566 | 68.694 |
| 8.88759 | 68.68 |
| 8.889520000000001 | 68.668 |
| 8.89145 | 68.655 |
| 8.893379999999999 | 68.643 |
| 8.89531 | 68.631 |
| 8.89724 | 68.62 |
| 8.89917 | 68.61 |
| 8.9011 | 68.599 |
| 8.903030000000001 | 68.588 |
| 8.904959999999999 | 68.578 |
| 8.906889999999999 | 68.568 |
| 8.90882 | 68.557 |
| 8.91075 | 68.547 |
| 8.91268 | 68.536 |
| 8.91461 | 68.525 |
| 8.916540000000001 | 68.514 |
| 8.91847 | 68.502 |
| 8.920399999999999 | 68.49 |
| 8.92233 | 68.478 |
| 8.92426 | 68.466 |
| 8.92619 | 68.454 |
| 8.928120000000002 | 68.442 |
| 8.93005 | 68.43 |
| 8.93198 | 68.418 |
| 8.93391 | 68.407 |
| 8.93584 | 68.396 |
| 8.93777 | 68.384 |
| 8.9397 | 68.373 |
| 8.94163 | 68.362 |
| 8.94356 | 68.351 |
| 8.94549 | 68.34 |
| 8.94742 | 68.328 |
| 8.94935 | 68.317 |
| 8.95128 | 68.305 |
| 8.953209999999999 | 68.293 |
| 8.95514 | 68.282 |
| 8.95707 | 68.27 |
| 8.959 | 68.26 |
| 8.960930000000001 | 68.249 |
| 8.962860000000001 | 68.238 |
| 8.96479 | 68.228 |
| 8.966719999999999 | 68.218 |
| 8.96865 | 68.209 |
| 8.97058 | 68.199 |
| 8.97251 | 68.189 |
| 8.974440000000001 | 68.18 |
| 8.976370000000001 | 68.17 |
| 8.978299999999999 | 68.16 |
| 8.98022 | 68.15 |
| 8.982149999999999 | 68.139 |
| 8.98408 | 68.128 |
| 8.98601 | 68.117 |
| 8.98794 | 68.105 |
| 8.989870000000002 | 68.093 |
| 8.9918 | 68.08 |
| 8.99373 | 68.068 |
| 8.995659999999999 | 68.055 |
| 8.99759 | 68.042 |
| 8.99952 | 68.029 |
| 9.00145 | 68.016 |
| 9.00338 | 68.004 |
| 9.00531 | 67.993 |
| 9.00724 | 67.981 |
| 9.00917 | 67.97 |
| 9.0111 | 67.959 |
| 9.01303 | 67.949 |
| 9.014959999999999 | 67.939 |
| 9.01689 | 67.929 |
| 9.01882 | 67.919 |
| 9.02075 | 67.908 |
| 9.022680000000001 | 67.897 |
| 9.024610000000001 | 67.887 |
| 9.02654 | 67.876 |
| 9.028469999999999 | 67.864 |
| 9.0304 | 67.852 |
| 9.03233 | 67.84 |
| 9.03426 | 67.828 |
| 9.036190000000001 | 67.816 |
| 9.038120000000001 | 67.804 |
| 9.040049999999999 | 67.792 |
| 9.041979999999999 | 67.78 |
| 9.04391 | 67.769 |
| 9.04584 | 67.757 |
| 9.04777 | 67.746 |
| 9.049700000000001 | 67.735 |
| 9.05163 | 67.724 |
| 9.05356 | 67.714 |
| 9.055489999999999 | 67.703 |
| 9.05742 | 67.693 |
| 9.05935 | 67.682 |
| 9.06128 | 67.671 |
| 9.06321 | 67.661 |
| 9.06514 | 67.65 |
| 9.06707 | 67.638 |
| 9.069 | 67.627 |
| 9.07093 | 67.615 |
| 9.07286 | 67.603 |
| 9.07479 | 67.591 |
| 9.07672 | 67.578 |
| 9.07865 | 67.566 |
| 9.08058 | 67.554 |
| 9.082510000000001 | 67.542 |
| 9.08444 | 67.531 |
| 9.08637 | 67.52 |
| 9.088299999999998 | 67.509 |
| 9.09023 | 67.498 |
| 9.09216 | 67.487 |
| 9.09409 | 67.477 |
| 9.096020000000001 | 67.466 |
| 9.09795 | 67.455 |
| 9.099879999999999 | 67.444 |
| 9.101809999999999 | 67.432 |
| 9.10374 | 67.42 |
| 9.10567 | 67.408 |
| 9.1076 | 67.396 |
| 9.109530000000001 | 67.383 |
| 9.11146 | 67.371 |
| 9.113389999999999 | 67.359 |
| 9.11532 | 67.348 |
| 9.11725 | 67.336 |
| 9.11918 | 67.325 |
| 9.12111 | 67.314 |
| 9.123040000000001 | 67.304 |
| 9.12497 | 67.294 |
| 9.1269 | 67.283 |
| 9.12883 | 67.273 |
| 9.13076 | 67.262 |
| 9.13269 | 67.251 |
| 9.13462 | 67.24 |
| 9.13655 | 67.229 |
| 9.13848 | 67.218 |
| 9.14041 | 67.206 |
| 9.14234 | 67.195 |
| 9.14427 | 67.183 |
| 9.1462 | 67.172 |
| 9.148129999999998 | 67.16 |
| 9.15006 | 67.148 |
| 9.15199 | 67.136 |
| 9.15392 | 67.124 |
| 9.155850000000001 | 67.112 |
| 9.15778 | 67.099 |
| 9.159709999999999 | 67.086 |
| 9.16164 | 67.074 |
| 9.16357 | 67.061 |
| 9.1655 | 67.049 |
| 9.16743 | 67.036 |
| 9.169360000000001 | 67.024 |
| 9.17129 | 67.011 |
| 9.173219999999999 | 66.999 |
| 9.17515 | 66.987 |
| 9.17708 | 66.975 |
| 9.17901 | 66.963 |
| 9.18094 | 66.952 |
| 9.182870000000001 | 66.94 |
| 9.1848 | 66.928 |
| 9.186729999999999 | 66.917 |
| 9.18866 | 66.905 |
| 9.19059 | 66.894 |
| 9.19252 | 66.882 |
| 9.194450000000002 | 66.871 |
| 9.19638 | 66.859 |
| 9.19831 | 66.846 |
| 9.200239999999999 | 66.834 |
| 9.20217 | 66.822 |
| 9.2041 | 66.809 |
| 9.20603 | 66.797 |
| 9.20796 | 66.784 |
| 9.20989 | 66.771 |
| 9.21182 | 66.76 |
| 9.21375 | 66.748 |
| 9.21568 | 66.737 |
| 9.21761 | 66.725 |
| 9.21954 | 66.714 |
| 9.22147 | 66.704 |
| 9.2234 | 66.693 |
| 9.22533 | 66.683 |
| 9.22726 | 66.672 |
| 9.229190000000001 | 66.66 |
| 9.23112 | 66.649 |
| 9.233049999999999 | 66.637 |
| 9.23498 | 66.626 |
| 9.23691 | 66.613 |
| 9.23884 | 66.601 |
| 9.240770000000001 | 66.589 |
| 9.242700000000001 | 66.577 |
| 9.244629999999999 | 66.566 |
| 9.246559999999999 | 66.554 |
| 9.24849 | 66.543 |
| 9.25042 | 66.532 |
| 9.25235 | 66.521 |
| 9.254280000000001 | 66.51 |
| 9.25621 | 66.499 |
| 9.25814 | 66.489 |
| 9.260069999999999 | 66.478 |
| 9.262 | 66.467 |
| 9.26393 | 66.456 |
| 9.26586 | 66.446 |
| 9.267790000000002 | 66.435 |
| 9.26972 | 66.424 |
| 9.27165 | 66.413 |
| 9.273579999999999 | 66.402 |
| 9.27551 | 66.391 |
| 9.27744 | 66.38 |
| 9.27937 | 66.368 |
| 9.2813 | 66.357 |
| 9.28323 | 66.346 |
| 9.28516 | 66.334 |
| 9.287090000000001 | 66.323 |
| 9.28902 | 66.312 |
| 9.29095 | 66.301 |
| 9.292879999999998 | 66.29 |
| 9.29481 | 66.279 |
| 9.29674 | 66.269 |
| 9.29867 | 66.259 |
| 9.300600000000001 | 66.248 |
| 9.30253 | 66.239 |
| 9.304459999999999 | 66.229 |
| 9.306389999999999 | 66.22 |
| 9.30832 | 66.21 |
| 9.31025 | 66.201 |
| 9.31218 | 66.191 |
| 9.314110000000001 | 66.182 |
| 9.316040000000001 | 66.173 |
| 9.317969999999999 | 66.164 |
| 9.3199 | 66.154 |
| 9.32183 | 66.145 |
| 9.32376 | 66.135 |
| 9.32569 | 66.126 |
| 9.327620000000001 | 66.115 |
| 9.32955 | 66.105 |
| 9.331479999999999 | 66.094 |
| 9.33341 | 66.083 |
| 9.33534 | 66.073 |
| 9.33727 | 66.061 |
| 9.3392 | 66.05 |
| 9.34113 | 66.039 |
| 9.34306 | 66.028 |
| 9.34499 | 66.018 |
| 9.34692 | 66.007 |
| 9.34885 | 65.997 |
| 9.35078 | 65.987 |
| 9.352709999999998 | 65.977 |
| 9.35464 | 65.967 |
| 9.35657 | 65.958 |
| 9.3585 | 65.948 |
| 9.360430000000001 | 65.938 |
| 9.36236 | 65.928 |
| 9.36429 | 65.919 |
| 9.36622 | 65.909 |
| 9.36815 | 65.899 |
| 9.37008 | 65.888 |
| 9.37201 | 65.878 |
| 9.373940000000001 | 65.868 |
| 9.37587 | 65.857 |
| 9.377799999999999 | 65.847 |
| 9.37973 | 65.836 |
| 9.38166 | 65.826 |
| 9.38359 | 65.815 |
| 9.38552 | 65.805 |
| 9.387450000000001 | 65.795 |
| 9.38938 | 65.784 |
| 9.391309999999999 | 65.774 |
| 9.39324 | 65.763 |
| 9.39517 | 65.753 |
| 9.3971 | 65.743 |
| 9.39903 | 65.733 |
| 9.40096 | 65.724 |
| 9.40289 | 65.714 |
| 9.404819999999999 | 65.704 |
| 9.40675 | 65.695 |
| 9.40868 | 65.686 |
| 9.41061 | 65.676 |
| 9.412540000000002 | 65.667 |
| 9.41447 | 65.657 |
| 9.4164 | 65.647 |
| 9.41833 | 65.638 |
| 9.42026 | 65.628 |
| 9.42219 | 65.617 |
| 9.42412 | 65.606 |
| 9.42605 | 65.596 |
| 9.42798 | 65.585 |
| 9.42991 | 65.574 |
| 9.43184 | 65.563 |
| 9.43377 | 65.552 |
| 9.4357 | 65.541 |
| 9.437629999999999 | 65.53 |
| 9.43956 | 65.519 |
| 9.44149 | 65.509 |
| 9.44342 | 65.498 |
| 9.445350000000001 | 65.487 |
| 9.447280000000001 | 65.476 |
| 9.449209999999999 | 65.465 |
| 9.451139999999999 | 65.453 |
| 9.45307 | 65.442 |
| 9.455 | 65.431 |
| 9.45693 | 65.419 |
| 9.458860000000001 | 65.408 |
| 9.460790000000001 | 65.396 |
| 9.46272 | 65.384 |
| 9.464649999999999 | 65.374 |
| 9.46658 | 65.363 |
| 9.46851 | 65.352 |
| 9.47044 | 65.341 |
| 9.472370000000002 | 65.332 |
| 9.4743 | 65.323 |
| 9.47623 | 65.313 |
| 9.478159999999999 | 65.304 |
| 9.48009 | 65.295 |
| 9.48202 | 65.287 |
| 9.48395 | 65.278 |
| 9.48588 | 65.27 |
| 9.48781 | 65.261 |
| 9.48974 | 65.252 |
| 9.491670000000001 | 65.243 |
| 9.4936 | 65.233 |
| 9.49553 | 65.223 |
| 9.497459999999998 | 65.214 |
| 9.49939 | 65.203 |
| 9.50132 | 65.193 |
| 9.50325 | 65.182 |
| 9.505180000000001 | 65.172 |
| 9.50711 | 65.162 |
| 9.50904 | 65.151 |
| 9.510969999999999 | 65.14 |
| 9.5129 | 65.13 |
| 9.51483 | 65.119 |
| 9.51676 | 65.108 |
| 9.518690000000001 | 65.097 |
| 9.520620000000001 | 65.086 |
| 9.522549999999999 | 65.075 |
| 9.524479999999999 | 65.064 |
| 9.52641 | 65.052 |
| 9.52834 | 65.04 |
| 9.53027 | 65.029 |
| 9.532200000000001 | 65.017 |
| 9.53413 | 65.006 |
| 9.536059999999999 | 64.995 |
| 9.53799 | 64.984 |
| 9.53992 | 64.973 |
| 9.54185 | 64.963 |
| 9.54378 | 64.955 |
| 9.54571 | 64.946 |
| 9.54764 | 64.937 |
| 9.54957 | 64.929 |
| 9.5515 | 64.921 |
| 9.55343 | 64.914 |
| 9.55536 | 64.907 |
| 9.55729 | 64.9 |
| 9.55922 | 64.893 |
| 9.56115 | 64.886 |
| 9.56308 | 64.879 |
| 9.565010000000001 | 64.872 |
| 9.56694 | 64.865 |
| 9.56887 | 64.856 |
| 9.570799999999998 | 64.847 |
| 9.57273 | 64.838 |
| 9.57466 | 64.829 |
| 9.57659 | 64.819 |
| 9.578520000000001 | 64.808 |
| 9.58045 | 64.796 |
| 9.582379999999999 | 64.785 |
| 9.58431 | 64.773 |
| 9.58624 | 64.762 |
| 9.58817 | 64.751 |
| 9.5901 | 64.74 |
| 9.592030000000001 | 64.729 |
| 9.59396 | 64.718 |
| 9.595889999999999 | 64.709 |
| 9.59782 | 64.7 |
| 9.59975 | 64.691 |
| 9.60168 | 64.682 |
| 9.60361 | 64.673 |
| 9.605540000000001 | 64.664 |
| 9.60747 | 64.655 |
| 9.609399999999999 | 64.645 |
| 9.61133 | 64.636 |
| 9.61326 | 64.625 |
| 9.61519 | 64.614 |
| 9.617120000000002 | 64.602 |
| 9.61905 | 64.591 |
| 9.62098 | 64.579 |
| 9.62291 | 64.568 |
| 9.62484 | 64.557 |
| 9.62677 | 64.546 |
| 9.6287 | 64.534 |
| 9.63063 | 64.524 |
| 9.63256 | 64.515 |
| 9.63449 | 64.506 |
| 9.63642 | 64.497 |
| 9.63835 | 64.488 |
| 9.64028 | 64.479 |
| 9.642209999999999 | 64.471 |
| 9.64414 | 64.463 |
| 9.64607 | 64.454 |
| 9.648 | 64.445 |
| 9.64993 | 64.433 |
| 9.651860000000001 | 64.422 |
| 9.65379 | 64.41 |
| 9.655719999999999 | 64.399 |
| 9.65765 | 64.385 |
| 9.65958 | 64.37 |
| 9.66151 | 64.354 |
| 9.663440000000001 | 64.339 |
| 9.665370000000001 | 64.324 |
| 9.6673 | 64.309 |
| 9.669229999999999 | 64.294 |
| 9.67116 | 64.279 |
| 9.67309 | 64.265 |
| 9.67502 | 64.251 |
| 9.676950000000001 | 64.241 |
| 9.67888 | 64.231 |
| 9.68081 | 64.221 |
| 9.682739999999999 | 64.21 |
| 9.68467 | 64.202 |
| 9.6866 | 64.196 |
| 9.68853 | 64.189 |
| 9.69046 | 64.182 |
| 9.69239 | 64.175 |
| 9.69432 | 64.168 |
| 9.69625 | 64.161 |
| 9.69818 | 64.154 |
| 9.70011 | 64.147 |
| 9.70204 | 64.139 |
| 9.70397 | 64.13 |
| 9.7059 | 64.122 |
| 9.70783 | 64.113 |
| 9.709760000000001 | 64.105 |
| 9.71169 | 64.095 |
| 9.71362 | 64.086 |
| 9.715549999999999 | 64.076 |
| 9.71748 | 64.067 |
| 9.71941 | 64.057 |
| 9.72134 | 64.047 |
| 9.723270000000001 | 64.036 |
| 9.725200000000001 | 64.026 |
| 9.727129999999999 | 64.016 |
| 9.729059999999999 | 64.005 |
| 9.73099 | 63.995 |
| 9.73292 | 63.985 |
| 9.73485 | 63.975 |
| 9.736780000000001 | 63.965 |
| 9.73871 | 63.956 |
| 9.740639999999999 | 63.946 |
| 9.742569999999999 | 63.937 |
| 9.7445 | 63.928 |
| 9.74643 | 63.919 |
| 9.74836 | 63.91 |
| 9.750290000000001 | 63.901 |
| 9.75222 | 63.892 |
| 9.75415 | 63.883 |
| 9.75608 | 63.874 |
| 9.75801 | 63.865 |
| 9.75994 | 63.857 |
| 9.76187 | 63.848 |
| 9.7638 | 63.839 |
| 9.76573 | 63.83 |
| 9.76766 | 63.822 |
| 9.76959 | 63.814 |
| 9.77152 | 63.806 |
| 9.77345 | 63.798 |
| 9.775379999999998 | 63.79 |
| 9.77731 | 63.781 |
| 9.77924 | 63.771 |
| 9.78117 | 63.762 |
| 9.783100000000001 | 63.753 |
| 9.78503 | 63.743 |
| 9.786959999999999 | 63.732 |
| 9.788889999999999 | 63.721 |
| 9.79082 | 63.71 |
| 9.79275 | 63.699 |
| 9.79468 | 63.689 |
| 9.796610000000001 | 63.678 |
| 9.798540000000001 | 63.667 |
| 9.800469999999999 | 63.657 |
| 9.8024 | 63.646 |
| 9.80433 | 63.637 |
| 9.80626 | 63.627 |
| 9.80819 | 63.618 |
| 9.810120000000001 | 63.609 |
| 9.81205 | 63.6 |
| 9.813979999999999 | 63.591 |
| 9.81591 | 63.582 |
| 9.81784 | 63.574 |
| 9.81977 | 63.565 |
| 9.8217 | 63.556 |
| 9.82363 | 63.548 |
| 9.82556 | 63.54 |
| 9.82749 | 63.532 |
| 9.82942 | 63.523 |
| 9.83135 | 63.515 |
| 9.83328 | 63.507 |
| 9.83521 | 63.499 |
| 9.83714 | 63.491 |
| 9.83907 | 63.483 |
| 9.841 | 63.474 |
| 9.84293 | 63.465 |
| 9.84486 | 63.456 |
| 9.84679 | 63.447 |
| 9.84872 | 63.439 |
| 9.85065 | 63.429 |
| 9.85258 | 63.42 |
| 9.85451 | 63.411 |
| 9.856440000000001 | 63.402 |
| 9.85837 | 63.393 |
| 9.860299999999999 | 63.384 |
| 9.86223 | 63.376 |
| 9.86416 | 63.367 |
| 9.86609 | 63.359 |
| 9.86802 | 63.351 |
| 9.869950000000001 | 63.343 |
| 9.871879999999999 | 63.335 |
| 9.873809999999999 | 63.327 |
| 9.87574 | 63.319 |
| 9.87767 | 63.31 |
| 9.8796 | 63.301 |
| 9.881530000000001 | 63.292 |
| 9.88346 | 63.283 |
| 9.88539 | 63.274 |
| 9.887319999999999 | 63.265 |
| 9.88925 | 63.254 |
| 9.89118 | 63.243 |
| 9.89311 | 63.233 |
| 9.895040000000002 | 63.222 |
| 9.89697 | 63.211 |
| 9.8989 | 63.201 |
| 9.90083 | 63.19 |
| 9.90276 | 63.179 |
| 9.90469 | 63.169 |
| 9.90662 | 63.159 |
| 9.90855 | 63.151 |
| 9.91048 | 63.142 |
| 9.91241 | 63.133 |
| 9.91434 | 63.125 |
| 9.91627 | 63.117 |
| 9.9182 | 63.11 |
| 9.920129999999999 | 63.102 |
| 9.92206 | 63.095 |
| 9.92399 | 63.087 |
| 9.92592 | 63.079 |
| 9.927850000000001 | 63.071 |
| 9.929780000000001 | 63.063 |
| 9.931709999999999 | 63.054 |
| 9.933639999999999 | 63.046 |
| 9.93557 | 63.037 |
| 9.9375 | 63.028 |
| 9.93943 | 63.019 |
| 9.941360000000001 | 63.01 |
| 9.943290000000001 | 63 |
| 9.945219999999999 | 62.992 |
| 9.947149999999999 | 62.984 |
| 9.94908 | 62.975 |
| 9.95101 | 62.967 |
| 9.95294 | 62.959 |
| 9.954870000000001 | 62.951 |
| 9.9568 | 62.943 |
| 9.95873 | 62.936 |
| 9.96066 | 62.928 |
| 9.96259 | 62.921 |
| 9.96452 | 62.913 |
| 9.96645 | 62.905 |
| 9.96838 | 62.897 |
| 9.97031 | 62.889 |
| 9.97224 | 62.881 |
| 9.97417 | 62.873 |
| 9.9761 | 62.865 |
| 9.97803 | 62.857 |
| 9.979959999999998 | 62.848 |
| 9.98189 | 62.84 |
| 9.98382 | 62.832 |
| 9.98575 | 62.823 |
| 9.987680000000001 | 62.815 |
| 9.98961 | 62.807 |
| 9.99154 | 62.798 |
| 9.993469999999999 | 62.79 |
| 9.9954 | 62.781 |
| 9.99733 | 62.773 |
| 9.99926 | 62.765 |
| 10.0012 | 62.756 |
| 10.0031 | 62.749 |
| 10.005 | 62.741 |
| 10.007 | 62.733 |
| 10.008899999999999 | 62.725 |
| 10.0108 | 62.717 |
| 10.012799999999999 | 62.71 |
| 10.014700000000001 | 62.702 |
| 10.0166 | 62.695 |
| 10.018600000000001 | 62.688 |
| 10.0205 | 62.68 |
| 10.0224 | 62.672 |
| 10.024299999999998 | 62.665 |
| 10.026299999999999 | 62.657 |
| 10.0282 | 62.649 |
| 10.030100000000001 | 62.641 |
| 10.0321 | 62.633 |
| 10.034 | 62.625 |
| 10.0359 | 62.617 |
| 10.0379 | 62.609 |
| 10.0398 | 62.602 |
| 10.0417 | 62.594 |
| 10.0436 | 62.586 |
| 10.0456 | 62.579 |
| 10.0475 | 62.571 |
| 10.0494 | 62.564 |
| 10.0514 | 62.556 |
| 10.0533 | 62.548 |
| 10.055200000000001 | 62.54 |
| 10.0572 | 62.533 |
| 10.0591 | 62.525 |
| 10.061 | 62.516 |
| 10.062899999999999 | 62.507 |
| 10.0649 | 62.499 |
| 10.066799999999999 | 62.49 |
| 10.068700000000002 | 62.481 |
| 10.0707 | 62.472 |
| 10.0726 | 62.462 |
| 10.0745 | 62.453 |
| 10.0765 | 62.444 |
| 10.0784 | 62.434 |
| 10.0803 | 62.425 |
| 10.0822 | 62.415 |
| 10.084200000000001 | 62.406 |
| 10.0861 | 62.397 |
| 10.088 | 62.387 |
| 10.09 | 62.378 |
| 10.091899999999999 | 62.369 |
| 10.0938 | 62.36 |
| 10.095799999999999 | 62.351 |
| 10.097700000000001 | 62.343 |
| 10.0996 | 62.334 |
| 10.1015 | 62.325 |
| 10.1035 | 62.317 |
| 10.1054 | 62.308 |
| 10.107299999999999 | 62.299 |
| 10.1093 | 62.291 |
| 10.1112 | 62.283 |
| 10.113100000000001 | 62.275 |
| 10.1151 | 62.267 |
| 10.117 | 62.259 |
| 10.1189 | 62.251 |
| 10.1208 | 62.244 |
| 10.1228 | 62.237 |
| 10.1247 | 62.23 |
| 10.1266 | 62.222 |
| 10.1286 | 62.215 |
| 10.1305 | 62.208 |
| 10.1324 | 62.2 |
| 10.1344 | 62.193 |
| 10.136299999999999 | 62.186 |
| 10.138200000000001 | 62.178 |
| 10.1401 | 62.17 |
| 10.142100000000001 | 62.162 |
| 10.144 | 62.153 |
| 10.1459 | 62.145 |
| 10.1479 | 62.137 |
| 10.149799999999999 | 62.128 |
| 10.1517 | 62.119 |
| 10.1537 | 62.111 |
| 10.1556 | 62.102 |
| 10.1575 | 62.093 |
| 10.1594 | 62.084 |
| 10.1614 | 62.075 |
| 10.1633 | 62.066 |
| 10.1652 | 62.056 |
| 10.167200000000001 | 62.047 |
| 10.1691 | 62.037 |
| 10.171 | 62.028 |
| 10.173 | 62.018 |
| 10.1749 | 62.008 |
| 10.1768 | 61.998 |
| 10.178700000000001 | 61.988 |
| 10.1807 | 61.977 |
| 10.1826 | 61.967 |
| 10.1845 | 61.957 |
| 10.1865 | 61.947 |
| 10.1884 | 61.936 |
| 10.190299999999999 | 61.927 |
| 10.1923 | 61.917 |
| 10.1942 | 61.907 |
| 10.1961 | 61.897 |
| 10.198 | 61.888 |
| 10.2 | 61.879 |
| 10.2019 | 61.87 |
| 10.2038 | 61.86 |
| 10.2058 | 61.851 |
| 10.2077 | 61.842 |
| 10.2096 | 61.833 |
| 10.2116 | 61.824 |
| 10.2135 | 61.815 |
| 10.215399999999999 | 61.806 |
| 10.2173 | 61.797 |
| 10.219299999999999 | 61.788 |
| 10.221200000000001 | 61.779 |
| 10.2231 | 61.77 |
| 10.225100000000001 | 61.761 |
| 10.227 | 61.752 |
| 10.2289 | 61.743 |
| 10.2309 | 61.734 |
| 10.2328 | 61.726 |
| 10.2347 | 61.717 |
| 10.236600000000001 | 61.708 |
| 10.2386 | 61.699 |
| 10.2405 | 61.69 |
| 10.2424 | 61.682 |
| 10.244399999999999 | 61.673 |
| 10.2463 | 61.664 |
| 10.2482 | 61.656 |
| 10.250200000000001 | 61.648 |
| 10.2521 | 61.64 |
| 10.254 | 61.633 |
| 10.2559 | 61.625 |
| 10.2579 | 61.617 |
| 10.259799999999998 | 61.61 |
| 10.261700000000001 | 61.602 |
| 10.2637 | 61.595 |
| 10.265600000000001 | 61.588 |
| 10.2675 | 61.58 |
| 10.2695 | 61.572 |
| 10.2714 | 61.563 |
| 10.273299999999999 | 61.555 |
| 10.2752 | 61.546 |
| 10.2772 | 61.537 |
| 10.2791 | 61.528 |
| 10.281 | 61.517 |
| 10.283 | 61.507 |
| 10.2849 | 61.496 |
| 10.2868 | 61.486 |
| 10.288799999999998 | 61.475 |
| 10.290700000000001 | 61.465 |
| 10.2926 | 61.454 |
| 10.2945 | 61.444 |
| 10.2965 | 61.433 |
| 10.298399999999999 | 61.422 |
| 10.3003 | 61.412 |
| 10.302299999999999 | 61.402 |
| 10.304200000000002 | 61.392 |
| 10.3061 | 61.382 |
| 10.3081 | 61.372 |
| 10.31 | 61.362 |
| 10.3119 | 61.352 |
| 10.313799999999999 | 61.342 |
| 10.3158 | 61.331 |
| 10.3177 | 61.321 |
| 10.319600000000001 | 61.311 |
| 10.3216 | 61.3 |
| 10.3235 | 61.29 |
| 10.3254 | 61.28 |
| 10.327399999999999 | 61.27 |
| 10.3293 | 61.259 |
| 10.3312 | 61.25 |
| 10.3331 | 61.24 |
| 10.3351 | 61.231 |
| 10.337 | 61.222 |
| 10.338899999999999 | 61.212 |
| 10.3409 | 61.203 |
| 10.342799999999999 | 61.194 |
| 10.344700000000001 | 61.185 |
| 10.3467 | 61.176 |
| 10.348600000000001 | 61.167 |
| 10.3505 | 61.158 |
| 10.3524 | 61.148 |
| 10.3544 | 61.138 |
| 10.3563 | 61.128 |
| 10.3582 | 61.118 |
| 10.3602 | 61.108 |
| 10.3621 | 61.097 |
| 10.364 | 61.086 |
| 10.366 | 61.076 |
| 10.367899999999999 | 61.065 |
| 10.3698 | 61.054 |
| 10.3717 | 61.043 |
| 10.373700000000001 | 61.033 |
| 10.3756 | 61.022 |
| 10.3775 | 61.012 |
| 10.3795 | 61.001 |
| 10.3814 | 60.991 |
| 10.383299999999998 | 60.982 |
| 10.385299999999999 | 60.973 |
| 10.3872 | 60.963 |
| 10.389100000000001 | 60.954 |
| 10.391 | 60.945 |
| 10.393 | 60.936 |
| 10.3949 | 60.927 |
| 10.396799999999999 | 60.918 |
| 10.3988 | 60.909 |
| 10.4007 | 60.9 |
| 10.4026 | 60.891 |
| 10.4046 | 60.881 |
| 10.4065 | 60.872 |
| 10.4084 | 60.862 |
| 10.4103 | 60.852 |
| 10.4123 | 60.842 |
| 10.414200000000001 | 60.833 |
| 10.4161 | 60.823 |
| 10.4181 | 60.813 |
| 10.42 | 60.804 |
| 10.421899999999999 | 60.794 |
| 10.4239 | 60.785 |
| 10.425799999999999 | 60.776 |
| 10.427700000000002 | 60.768 |
| 10.4296 | 60.759 |
| 10.4316 | 60.75 |
| 10.4335 | 60.742 |
| 10.4354 | 60.733 |
| 10.4374 | 60.725 |
| 10.4393 | 60.717 |
| 10.4412 | 60.708 |
| 10.443200000000001 | 60.7 |
| 10.4451 | 60.692 |
| 10.447 | 60.683 |
| 10.4489 | 60.674 |
| 10.450899999999999 | 60.665 |
| 10.4528 | 60.656 |
| 10.4547 | 60.647 |
| 10.456700000000001 | 60.638 |
| 10.4586 | 60.628 |
| 10.4605 | 60.619 |
| 10.4625 | 60.61 |
| 10.4644 | 60.6 |
| 10.466299999999999 | 60.591 |
| 10.468200000000001 | 60.581 |
| 10.4702 | 60.571 |
| 10.472100000000001 | 60.561 |
| 10.474 | 60.552 |
| 10.476 | 60.542 |
| 10.4779 | 60.532 |
| 10.4798 | 60.522 |
| 10.4818 | 60.512 |
| 10.4837 | 60.502 |
| 10.4856 | 60.492 |
| 10.4875 | 60.482 |
| 10.4895 | 60.472 |
| 10.4914 | 60.462 |
| 10.4933 | 60.452 |
| 10.495299999999999 | 60.442 |
| 10.497200000000001 | 60.432 |
| 10.4991 | 60.422 |
| 10.501100000000001 | 60.412 |
| 10.503 | 60.402 |
| 10.5049 | 60.392 |
| 10.5068 | 60.383 |
| 10.508799999999999 | 60.373 |
| 10.5107 | 60.363 |
| 10.5126 | 60.354 |
| 10.5146 | 60.344 |
| 10.5165 | 60.334 |
| 10.5184 | 60.325 |
| 10.5204 | 60.315 |
| 10.5223 | 60.305 |
| 10.5242 | 60.296 |
| 10.5261 | 60.286 |
| 10.5281 | 60.276 |
| 10.53 | 60.266 |
| 10.5319 | 60.256 |
| 10.5339 | 60.246 |
| 10.5358 | 60.236 |
| 10.537700000000001 | 60.226 |
| 10.5397 | 60.216 |
| 10.5416 | 60.207 |
| 10.5435 | 60.197 |
| 10.545399999999999 | 60.188 |
| 10.5474 | 60.179 |
| 10.549299999999999 | 60.169 |
| 10.551200000000001 | 60.16 |
| 10.5532 | 60.152 |
| 10.5551 | 60.144 |
| 10.557 | 60.136 |
| 10.559 | 60.128 |
| 10.5609 | 60.12 |
| 10.5628 | 60.113 |
| 10.5647 | 60.105 |
| 10.5667 | 60.098 |
| 10.5686 | 60.09 |
| 10.5705 | 60.082 |
| 10.5725 | 60.074 |
| 10.574399999999999 | 60.065 |
| 10.5763 | 60.056 |
| 10.578299999999999 | 60.047 |
| 10.580200000000001 | 60.038 |
| 10.5821 | 60.029 |
| 10.584 | 60.018 |
| 10.586 | 60.007 |
| 10.5879 | 59.996 |
| 10.589799999999999 | 59.985 |
| 10.5918 | 59.974 |
| 10.5937 | 59.962 |
| 10.595600000000001 | 59.951 |
| 10.5976 | 59.939 |
| 10.5995 | 59.927 |
| 10.6014 | 59.915 |
| 10.603299999999999 | 59.903 |
| 10.6053 | 59.892 |
| 10.6072 | 59.882 |
| 10.6091 | 59.872 |
| 10.6111 | 59.862 |
| 10.613 | 59.852 |
| 10.6149 | 59.842 |
| 10.6169 | 59.834 |
| 10.618799999999998 | 59.826 |
| 10.620700000000001 | 59.818 |
| 10.6226 | 59.81 |
| 10.624600000000001 | 59.803 |
| 10.6265 | 59.795 |
| 10.6284 | 59.788 |
| 10.6304 | 59.78 |
| 10.632299999999999 | 59.773 |
| 10.6342 | 59.765 |
| 10.6362 | 59.758 |
| 10.6381 | 59.75 |
| 10.64 | 59.741 |
| 10.6419 | 59.733 |
| 10.6439 | 59.724 |
| 10.6458 | 59.716 |
| 10.6477 | 59.707 |
| 10.649700000000001 | 59.698 |
| 10.6516 | 59.69 |
| 10.6535 | 59.681 |
| 10.6555 | 59.672 |
| 10.657399999999999 | 59.663 |
| 10.6593 | 59.655 |
| 10.661200000000001 | 59.646 |
| 10.663200000000002 | 59.638 |
| 10.6651 | 59.63 |
| 10.667 | 59.621 |
| 10.669 | 59.613 |
| 10.6709 | 59.604 |
| 10.672799999999999 | 59.595 |
| 10.6748 | 59.586 |
| 10.6767 | 59.577 |
| 10.678600000000001 | 59.568 |
| 10.6805 | 59.559 |
| 10.6825 | 59.551 |
| 10.6844 | 59.542 |
| 10.6863 | 59.533 |
| 10.6883 | 59.524 |
| 10.6902 | 59.516 |
| 10.6921 | 59.507 |
| 10.6941 | 59.5 |
| 10.696 | 59.493 |
| 10.697899999999999 | 59.486 |
| 10.6998 | 59.479 |
| 10.701799999999999 | 59.473 |
| 10.703700000000001 | 59.466 |
| 10.7056 | 59.459 |
| 10.707600000000001 | 59.453 |
| 10.7095 | 59.446 |
| 10.7114 | 59.439 |
| 10.7134 | 59.433 |
| 10.7153 | 59.424 |
| 10.7172 | 59.415 |
| 10.719100000000001 | 59.406 |
| 10.7211 | 59.397 |
| 10.723 | 59.388 |
| 10.7249 | 59.379 |
| 10.726899999999999 | 59.368 |
| 10.7288 | 59.356 |
| 10.7307 | 59.345 |
| 10.732700000000001 | 59.334 |
| 10.7346 | 59.323 |
| 10.7365 | 59.311 |
| 10.7384 | 59.3 |
| 10.7404 | 59.289 |
| 10.742299999999998 | 59.277 |
| 10.744200000000001 | 59.266 |
| 10.7462 | 59.255 |
| 10.7481 | 59.244 |
| 10.75 | 59.233 |
| 10.752 | 59.222 |
| 10.7539 | 59.211 |
| 10.755799999999999 | 59.2 |
| 10.757700000000002 | 59.189 |
| 10.7597 | 59.179 |
| 10.7616 | 59.169 |
| 10.7635 | 59.158 |
| 10.7655 | 59.148 |
| 10.7674 | 59.138 |
| 10.7693 | 59.127 |
| 10.7713 | 59.119 |
| 10.773200000000001 | 59.11 |
| 10.7751 | 59.101 |
| 10.777 | 59.092 |
| 10.779 | 59.083 |
| 10.780899999999999 | 59.075 |
| 10.7828 | 59.068 |
| 10.784799999999999 | 59.06 |
| 10.786700000000002 | 59.053 |
| 10.7886 | 59.046 |
| 10.7906 | 59.039 |
| 10.7925 | 59.032 |
| 10.7944 | 59.024 |
| 10.796299999999999 | 59.017 |
| 10.7983 | 59.01 |
| 10.8002 | 59.003 |
| 10.802100000000001 | 58.995 |
| 10.8041 | 58.987 |
| 10.806 | 58.979 |
| 10.8079 | 58.97 |
| 10.809899999999999 | 58.961 |
| 10.8118 | 58.953 |
| 10.8137 | 58.944 |
| 10.8156 | 58.935 |
| 10.8176 | 58.925 |
| 10.8195 | 58.916 |
| 10.821399999999999 | 58.906 |
| 10.8234 | 58.896 |
| 10.825299999999999 | 58.887 |
| 10.827200000000001 | 58.878 |
| 10.8292 | 58.869 |
| 10.831100000000001 | 58.86 |
| 10.833 | 58.851 |
| 10.8349 | 58.843 |
| 10.8369 | 58.834 |
| 10.838799999999999 | 58.826 |
| 10.8407 | 58.818 |
| 10.8427 | 58.81 |
| 10.8446 | 58.802 |
| 10.8465 | 58.794 |
| 10.8485 | 58.786 |
| 10.8504 | 58.778 |
| 10.8523 | 58.769 |
| 10.8542 | 58.761 |
| 10.856200000000001 | 58.753 |
| 10.8581 | 58.744 |
| 10.86 | 58.736 |
| 10.862 | 58.727 |
| 10.8639 | 58.718 |
| 10.8658 | 58.709 |
| 10.867799999999999 | 58.7 |
| 10.8697 | 58.691 |
| 10.8716 | 58.682 |
| 10.8735 | 58.674 |
| 10.8755 | 58.667 |
| 10.8774 | 58.659 |
| 10.879299999999999 | 58.651 |
| 10.8813 | 58.643 |
| 10.8832 | 58.636 |
| 10.8851 | 58.63 |
| 10.8871 | 58.624 |
| 10.889 | 58.618 |
| 10.8909 | 58.612 |
| 10.8928 | 58.606 |
| 10.8948 | 58.601 |
| 10.896700000000001 | 58.596 |
| 10.8986 | 58.591 |
| 10.9006 | 58.586 |
| 10.9025 | 58.581 |
| 10.904399999999999 | 58.576 |
| 10.9064 | 58.57 |
| 10.908299999999999 | 58.563 |
| 10.910200000000001 | 58.557 |
| 10.9121 | 58.55 |
| 10.914100000000001 | 58.544 |
| 10.916 | 58.538 |
| 10.9179 | 58.53 |
| 10.9199 | 58.521 |
| 10.9218 | 58.512 |
| 10.9237 | 58.504 |
| 10.9257 | 58.495 |
| 10.9276 | 58.486 |
| 10.9295 | 58.477 |
| 10.9314 | 58.467 |
| 10.933399999999999 | 58.457 |
| 10.9353 | 58.447 |
| 10.9372 | 58.437 |
| 10.939200000000001 | 58.427 |
| 10.9411 | 58.417 |
| 10.943 | 58.407 |
| 10.945 | 58.397 |
| 10.9469 | 58.386 |
| 10.948799999999999 | 58.376 |
| 10.950700000000001 | 58.366 |
| 10.9527 | 58.356 |
| 10.954600000000001 | 58.346 |
| 10.9565 | 58.337 |
| 10.9585 | 58.327 |
| 10.9604 | 58.317 |
| 10.962299999999999 | 58.307 |
| 10.9643 | 58.299 |
| 10.9662 | 58.291 |
| 10.9681 | 58.283 |
| 10.97 | 58.275 |
| 10.972 | 58.267 |
| 10.9739 | 58.259 |
| 10.9758 | 58.252 |
| 10.977799999999998 | 58.244 |
| 10.979700000000001 | 58.237 |
| 10.9816 | 58.23 |
| 10.983600000000001 | 58.223 |
| 10.9855 | 58.215 |
| 10.9874 | 58.207 |
| 10.9893 | 58.197 |
| 10.991299999999999 | 58.188 |
| 10.9932 | 58.179 |
| 10.9951 | 58.169 |
| 10.9971 | 58.16 |
| 10.999 | 58.15 |
| 11.0009 | 58.139 |
| 11.0029 | 58.128 |
| 11.0048 | 58.118 |
| 11.0067 | 58.107 |
| 11.0086 | 58.096 |
| 11.0106 | 58.087 |
| 11.0125 | 58.078 |
| 11.0144 | 58.069 |
| 11.016399999999999 | 58.06 |
| 11.0183 | 58.051 |
| 11.0202 | 58.042 |
| 11.022200000000002 | 58.035 |
| 11.0241 | 58.028 |
| 11.026 | 58.021 |
| 11.027899999999999 | 58.015 |
| 11.0299 | 58.008 |
| 11.031799999999999 | 58.002 |
| 11.033700000000001 | 57.995 |
| 11.0357 | 57.989 |
| 11.037600000000001 | 57.983 |
| 11.0395 | 57.977 |
| 11.0415 | 57.971 |
| 11.0434 | 57.964 |
| 11.0453 | 57.958 |
| 11.0472 | 57.952 |
| 11.0492 | 57.945 |
| 11.0511 | 57.939 |
| 11.053 | 57.932 |
| 11.055 | 57.926 |
| 11.056899999999999 | 57.92 |
| 11.0588 | 57.914 |
| 11.0607 | 57.908 |
| 11.062700000000001 | 57.902 |
| 11.0646 | 57.896 |
| 11.0665 | 57.89 |
| 11.0685 | 57.884 |
| 11.0704 | 57.879 |
| 11.072299999999998 | 57.873 |
| 11.0743 | 57.868 |
| 11.0762 | 57.862 |
| 11.078100000000001 | 57.857 |
| 11.08 | 57.851 |
| 11.082 | 57.845 |
| 11.0839 | 57.839 |
| 11.085799999999999 | 57.833 |
| 11.0878 | 57.827 |
| 11.0897 | 57.821 |
| 11.0916 | 57.815 |
| 11.0936 | 57.809 |
| 11.0955 | 57.802 |
| 11.0974 | 57.796 |
| 11.0993 | 57.789 |
| 11.101299999999998 | 57.783 |
| 11.103200000000001 | 57.776 |
| 11.1051 | 57.769 |
| 11.1071 | 57.761 |
| 11.109 | 57.753 |
| 11.110899999999999 | 57.746 |
| 11.1129 | 57.738 |
| 11.114799999999999 | 57.73 |
| 11.116700000000002 | 57.722 |
| 11.1186 | 57.713 |
| 11.1206 | 57.704 |
| 11.1225 | 57.695 |
| 11.1244 | 57.686 |
| 11.1264 | 57.676 |
| 11.1283 | 57.667 |
| 11.1302 | 57.657 |
| 11.132200000000001 | 57.648 |
| 11.1341 | 57.638 |
| 11.136 | 57.628 |
| 11.1379 | 57.618 |
| 11.139899999999999 | 57.609 |
| 11.1418 | 57.6 |
| 11.1437 | 57.591 |
| 11.145700000000001 | 57.582 |
| 11.1476 | 57.573 |
| 11.1495 | 57.564 |
| 11.1515 | 57.555 |
| 11.1534 | 57.547 |
| 11.155299999999999 | 57.539 |
| 11.157200000000001 | 57.531 |
| 11.1592 | 57.523 |
| 11.161100000000001 | 57.515 |
| 11.163 | 57.507 |
| 11.165 | 57.499 |
| 11.1669 | 57.491 |
| 11.1688 | 57.483 |
| 11.1708 | 57.476 |
| 11.1727 | 57.468 |
| 11.1746 | 57.46 |
| 11.1765 | 57.452 |
| 11.1785 | 57.443 |
| 11.180399999999999 | 57.434 |
| 11.1823 | 57.426 |
| 11.184299999999999 | 57.417 |
| 11.186200000000001 | 57.408 |
| 11.1881 | 57.4 |
| 11.190100000000001 | 57.391 |
| 11.192 | 57.382 |
| 11.1939 | 57.373 |
| 11.195799999999998 | 57.364 |
| 11.197799999999999 | 57.355 |
| 11.1997 | 57.347 |
| 11.201600000000001 | 57.339 |
| 11.2036 | 57.331 |
| 11.2055 | 57.323 |
| 11.2074 | 57.315 |
| 11.2094 | 57.307 |
| 11.2113 | 57.3 |
| 11.2132 | 57.293 |
| 11.2151 | 57.286 |
| 11.2171 | 57.28 |
| 11.219 | 57.274 |
| 11.2209 | 57.267 |
| 11.2229 | 57.261 |
| 11.2248 | 57.255 |
| 11.226700000000001 | 57.249 |
| 11.2287 | 57.243 |
| 11.2306 | 57.237 |
| 11.2325 | 57.23 |
| 11.234399999999999 | 57.224 |
| 11.2364 | 57.218 |
| 11.238299999999999 | 57.211 |
| 11.240200000000002 | 57.203 |
| 11.2422 | 57.196 |
| 11.2441 | 57.188 |
| 11.246 | 57.181 |
| 11.248 | 57.174 |
| 11.2499 | 57.165 |
| 11.2518 | 57.157 |
| 11.2537 | 57.148 |
| 11.255700000000001 | 57.14 |
| 11.2576 | 57.131 |
| 11.2595 | 57.123 |
| 11.2615 | 57.114 |
| 11.263399999999999 | 57.106 |
| 11.2653 | 57.097 |
| 11.267299999999999 | 57.088 |
| 11.269200000000001 | 57.08 |
| 11.2711 | 57.071 |
| 11.273 | 57.062 |
| 11.275 | 57.054 |
| 11.2769 | 57.045 |
| 11.278799999999999 | 57.036 |
| 11.2808 | 57.028 |
| 11.2827 | 57.019 |
| 11.284600000000001 | 57.011 |
| 11.2866 | 57.002 |
| 11.2885 | 56.993 |
| 11.2904 | 56.984 |
| 11.2923 | 56.975 |
| 11.2943 | 56.967 |
| 11.2962 | 56.958 |
| 11.2981 | 56.949 |
| 11.3001 | 56.94 |
| 11.302 | 56.93 |
| 11.3039 | 56.921 |
| 11.3059 | 56.912 |
| 11.307799999999999 | 56.902 |
| 11.309700000000001 | 56.893 |
| 11.3116 | 56.883 |
| 11.313600000000001 | 56.874 |
| 11.3155 | 56.864 |
| 11.3174 | 56.854 |
| 11.3194 | 56.845 |
| 11.321299999999999 | 56.835 |
| 11.3232 | 56.825 |
| 11.3252 | 56.815 |
| 11.3271 | 56.806 |
| 11.329 | 56.796 |
| 11.3309 | 56.786 |
| 11.3329 | 56.776 |
| 11.3348 | 56.766 |
| 11.3367 | 56.756 |
| 11.338700000000001 | 56.745 |
| 11.3406 | 56.735 |
| 11.3425 | 56.724 |
| 11.3445 | 56.714 |
| 11.3464 | 56.703 |
| 11.3483 | 56.693 |
| 11.350200000000001 | 56.682 |
| 11.3522 | 56.672 |
| 11.3541 | 56.661 |
| 11.356 | 56.651 |
| 11.358 | 56.64 |
| 11.3599 | 56.63 |
| 11.361799999999999 | 56.622 |
| 11.3638 | 56.613 |
| 11.3657 | 56.604 |
| 11.3676 | 56.595 |
| 11.3695 | 56.586 |
| 11.3715 | 56.577 |
| 11.3734 | 56.569 |
| 11.3753 | 56.561 |
| 11.3773 | 56.553 |
| 11.3792 | 56.544 |
| 11.3811 | 56.536 |
| 11.3831 | 56.528 |
| 11.385 | 56.519 |
| 11.386899999999999 | 56.508 |
| 11.3888 | 56.497 |
| 11.390799999999999 | 56.487 |
| 11.392700000000001 | 56.476 |
| 11.3946 | 56.466 |
| 11.396600000000001 | 56.455 |
| 11.3985 | 56.441 |
| 11.4004 | 56.428 |
| 11.4024 | 56.414 |
| 11.4043 | 56.4 |
| 11.4062 | 56.387 |
| 11.408100000000001 | 56.373 |
| 11.4101 | 56.359 |
| 11.412 | 56.344 |
| 11.4139 | 56.329 |
| 11.415899999999999 | 56.314 |
| 11.4178 | 56.3 |
| 11.4197 | 56.285 |
| 11.421700000000001 | 56.27 |
| 11.4236 | 56.256 |
| 11.4255 | 56.241 |
| 11.4274 | 56.227 |
| 11.4294 | 56.213 |
| 11.431299999999998 | 56.198 |
| 11.433200000000001 | 56.184 |
| 11.4352 | 56.169 |
| 11.437100000000001 | 56.155 |
| 11.439 | 56.14 |
| 11.441 | 56.126 |
| 11.4429 | 56.111 |
| 11.444799999999999 | 56.096 |
| 11.4467 | 56.082 |
| 11.4487 | 56.067 |
| 11.4506 | 56.051 |
| 11.4525 | 56.036 |
| 11.4545 | 56.02 |
| 11.4564 | 56.005 |
| 11.4583 | 55.99 |
| 11.4603 | 55.974 |
| 11.462200000000001 | 55.958 |
| 11.4641 | 55.941 |
| 11.466 | 55.925 |
| 11.468 | 55.908 |
| 11.469899999999999 | 55.892 |
| 11.4718 | 55.875 |
| 11.473799999999999 | 55.858 |
| 11.475700000000002 | 55.841 |
| 11.4776 | 55.824 |
| 11.4796 | 55.807 |
| 11.4815 | 55.79 |
| 11.4834 | 55.773 |
| 11.485299999999999 | 55.755 |
| 11.4873 | 55.737 |
| 11.4892 | 55.719 |
| 11.491100000000001 | 55.701 |
| 11.4931 | 55.684 |
| 11.495 | 55.666 |
| 11.4969 | 55.648 |
| 11.498899999999999 | 55.629 |
| 11.5008 | 55.61 |
| 11.5027 | 55.59 |
| 11.5046 | 55.571 |
| 11.5066 | 55.552 |
| 11.5085 | 55.532 |
| 11.510399999999999 | 55.513 |
| 11.5124 | 55.492 |
| 11.514299999999999 | 55.471 |
| 11.516200000000001 | 55.451 |
| 11.5182 | 55.43 |
| 11.520100000000001 | 55.409 |
| 11.522 | 55.388 |
| 11.5239 | 55.367 |
| 11.5259 | 55.346 |
| 11.5278 | 55.324 |
| 11.5297 | 55.302 |
| 11.5317 | 55.281 |
| 11.5336 | 55.259 |
| 11.5355 | 55.238 |
| 11.5375 | 55.215 |
| 11.539399999999999 | 55.193 |
| 11.5413 | 55.171 |
| 11.5432 | 55.148 |
| 11.545200000000001 | 55.126 |
| 11.5471 | 55.103 |
| 11.549 | 55.081 |
| 11.551 | 55.058 |
| 11.5529 | 55.035 |
| 11.554799999999998 | 55.011 |
| 11.556799999999999 | 54.988 |
| 11.5587 | 54.965 |
| 11.5606 | 54.942 |
| 11.5625 | 54.919 |
| 11.5645 | 54.895 |
| 11.5664 | 54.872 |
| 11.568299999999999 | 54.848 |
| 11.5703 | 54.825 |
| 11.5722 | 54.801 |
| 11.5741 | 54.778 |
| 11.5761 | 54.753 |
| 11.578 | 54.728 |
| 11.5799 | 54.702 |
| 11.5818 | 54.677 |
| 11.5838 | 54.652 |
| 11.585700000000001 | 54.627 |
| 11.5876 | 54.602 |
| 11.5896 | 54.573 |
| 11.5915 | 54.545 |
| 11.593399999999999 | 54.517 |
| 11.5954 | 54.489 |
| 11.597299999999999 | 54.461 |
| 11.599200000000002 | 54.432 |
| 11.6011 | 54.403 |
| 11.6031 | 54.372 |
| 11.605 | 54.341 |
| 11.6069 | 54.311 |
| 11.6089 | 54.28 |
| 11.6108 | 54.249 |
| 11.6127 | 54.218 |
| 11.614700000000001 | 54.186 |
| 11.6166 | 54.153 |
| 11.6185 | 54.12 |
| 11.6204 | 54.087 |
| 11.622399999999999 | 54.054 |
| 11.6243 | 54.021 |
| 11.6262 | 53.989 |
| 11.628200000000001 | 53.955 |
| 11.6301 | 53.92 |
| 11.632 | 53.886 |
| 11.634 | 53.852 |
| 11.6359 | 53.818 |
| 11.637799999999999 | 53.784 |
| 11.639700000000001 | 53.75 |
| 11.6417 | 53.716 |
| 11.643600000000001 | 53.682 |
| 11.6455 | 53.648 |
| 11.6475 | 53.614 |
| 11.6494 | 53.58 |
| 11.651299999999999 | 53.546 |
| 11.6533 | 53.512 |
| 11.6552 | 53.478 |
| 11.6571 | 53.444 |
| 11.659 | 53.41 |
| 11.661 | 53.376 |
| 11.6629 | 53.342 |
| 11.6648 | 53.308 |
| 11.666799999999999 | 53.274 |
| 11.668700000000001 | 53.24 |
| 11.6706 | 53.206 |
| 11.672600000000001 | 53.173 |
| 11.6745 | 53.139 |
| 11.6764 | 53.105 |
| 11.6783 | 53.071 |
| 11.680299999999999 | 53.037 |
| 11.6822 | 53.003 |
| 11.6841 | 52.97 |
| 11.6861 | 52.936 |
| 11.688 | 52.902 |
| 11.6899 | 52.868 |
| 11.6919 | 52.835 |
| 11.6938 | 52.8 |
| 11.6957 | 52.765 |
| 11.6976 | 52.731 |
| 11.6996 | 52.696 |
| 11.7015 | 52.661 |
| 11.7034 | 52.627 |
| 11.7054 | 52.592 |
| 11.7073 | 52.556 |
| 11.709200000000001 | 52.52 |
| 11.711200000000002 | 52.485 |
| 11.7131 | 52.449 |
| 11.715 | 52.413 |
| 11.716899999999999 | 52.377 |
| 11.7189 | 52.342 |
| 11.720799999999999 | 52.307 |
| 11.722700000000001 | 52.271 |
| 11.7247 | 52.236 |
| 11.726600000000001 | 52.201 |
| 11.7285 | 52.166 |
| 11.7305 | 52.131 |
| 11.7324 | 52.096 |
| 11.7343 | 52.062 |
| 11.7362 | 52.029 |
| 11.7382 | 51.995 |
| 11.7401 | 51.961 |
| 11.742 | 51.927 |
| 11.744 | 51.894 |
| 11.745899999999999 | 51.86 |
| 11.7478 | 51.827 |
| 11.749799999999999 | 51.794 |
| 11.751700000000001 | 51.76 |
| 11.7536 | 51.727 |
| 11.7555 | 51.694 |
| 11.7575 | 51.66 |
| 11.7594 | 51.627 |
| 11.761299999999999 | 51.595 |
| 11.7633 | 51.562 |
| 11.7652 | 51.529 |
| 11.767100000000001 | 51.496 |
| 11.7691 | 51.464 |
| 11.771 | 51.431 |
| 11.7729 | 51.399 |
| 11.774799999999999 | 51.368 |
| 11.7768 | 51.337 |
| 11.7787 | 51.306 |
| 11.7806 | 51.275 |
| 11.7826 | 51.244 |
| 11.7845 | 51.213 |
| 11.7864 | 51.182 |
| 11.7884 | 51.153 |
| 11.790299999999998 | 51.123 |
| 11.792200000000001 | 51.093 |
| 11.7941 | 51.063 |
| 11.796100000000001 | 51.033 |
| 11.798 | 51.003 |
| 11.7999 | 50.973 |
| 11.8019 | 50.944 |
| 11.803799999999999 | 50.914 |
| 11.8057 | 50.885 |
| 11.8077 | 50.856 |
| 11.8096 | 50.826 |
| 11.8115 | 50.797 |
| 11.8134 | 50.769 |
| 11.8154 | 50.742 |
| 11.8173 | 50.715 |
| 11.8192 | 50.687 |
| 11.821200000000001 | 50.66 |
| 11.8231 | 50.633 |
| 11.825 | 50.606 |
| 11.827 | 50.582 |
| 11.828899999999999 | 50.559 |
| 11.8308 | 50.536 |
| 11.8327 | 50.513 |
| 11.834700000000002 | 50.49 |
| 11.8366 | 50.467 |
| 11.8385 | 50.443 |
| 11.8405 | 50.424 |
| 11.8424 | 50.405 |
| 11.844299999999999 | 50.387 |
| 11.8463 | 50.368 |
| 11.8482 | 50.35 |
| 11.850100000000001 | 50.331 |
| 11.852 | 50.312 |
| 11.854 | 50.297 |
| 11.8559 | 50.282 |
| 11.8578 | 50.268 |
| 11.8598 | 50.253 |
| 11.8617 | 50.238 |
| 11.8636 | 50.224 |
| 11.8656 | 50.209 |
| 11.8675 | 50.197 |
| 11.869399999999999 | 50.185 |
| 11.8713 | 50.174 |
| 11.873299999999999 | 50.163 |
| 11.875200000000001 | 50.152 |
| 11.8771 | 50.14 |
| 11.879100000000001 | 50.129 |
| 11.881 | 50.12 |
| 11.8829 | 50.112 |
| 11.8849 | 50.103 |
| 11.8868 | 50.095 |
| 11.8887 | 50.087 |
| 11.890600000000001 | 50.079 |
| 11.8926 | 50.071 |
| 11.8945 | 50.064 |
| 11.8964 | 50.059 |
| 11.898399999999999 | 50.054 |
| 11.9003 | 50.049 |
| 11.9022 | 50.044 |
| 11.904200000000001 | 50.039 |
| 11.9061 | 50.034 |
| 11.908 | 50.031 |
| 11.9099 | 50.029 |
| 11.9119 | 50.027 |
| 11.913799999999998 | 50.025 |
| 11.915700000000001 | 50.024 |
| 11.9177 | 50.022 |
| 11.9196 | 50.02 |
| 11.9215 | 50.02 |
| 11.9235 | 50.021 |
| 11.9254 | 50.023 |
| 11.927299999999999 | 50.024 |
| 11.929200000000002 | 50.026 |
| 11.9312 | 50.028 |
| 11.9331 | 50.029 |
| 11.935 | 50.032 |
| 11.937 | 50.036 |
| 11.9389 | 50.04 |
| 11.9408 | 50.044 |
| 11.9428 | 50.048 |
| 11.944700000000001 | 50.052 |
| 11.9466 | 50.056 |
| 11.9485 | 50.061 |
| 11.9505 | 50.066 |
| 11.952399999999999 | 50.071 |
| 11.9543 | 50.077 |
| 11.956299999999999 | 50.082 |
| 11.958200000000001 | 50.087 |
| 11.9601 | 50.093 |
| 11.9621 | 50.098 |
| 11.964 | 50.104 |
| 11.9659 | 50.11 |
| 11.967799999999999 | 50.115 |
| 11.9698 | 50.121 |
| 11.9717 | 50.127 |
| 11.973600000000001 | 50.133 |
| 11.9756 | 50.139 |
| 11.9775 | 50.145 |
| 11.9794 | 50.152 |
| 11.981399999999999 | 50.159 |
| 11.9833 | 50.166 |
| 11.9852 | 50.172 |
| 11.9871 | 50.179 |
| 11.9891 | 50.186 |
| 11.991 | 50.194 |
| 11.992899999999999 | 50.202 |
| 11.9949 | 50.21 |
| 11.996799999999999 | 50.218 |
| 11.998700000000001 | 50.227 |
| 12.0007 | 50.235 |
| 12.002600000000001 | 50.243 |
| 12.0045 | 50.252 |
| 12.0064 | 50.261 |
| 12.0084 | 50.27 |
| 12.010299999999999 | 50.279 |
| 12.0122 | 50.288 |
| 12.0142 | 50.297 |
| 12.0161 | 50.306 |
| 12.018 | 50.315 |
| 12.02 | 50.324 |
| 12.0219 | 50.333 |
| 12.0238 | 50.342 |
| 12.0257 | 50.351 |
| 12.027700000000001 | 50.36 |
| 12.0296 | 50.369 |
| 12.0315 | 50.378 |
| 12.0335 | 50.386 |
| 12.0354 | 50.395 |
| 12.0373 | 50.404 |
| 12.039299999999999 | 50.413 |
| 12.0412 | 50.422 |
| 12.0431 | 50.431 |
| 12.045 | 50.44 |
| 12.047 | 50.45 |
| 12.0489 | 50.459 |
| 12.050799999999999 | 50.469 |
| 12.0528 | 50.479 |
| 12.0547 | 50.489 |
| 12.0566 | 50.498 |
| 12.0586 | 50.508 |
| 12.0605 | 50.519 |
| 12.0624 | 50.529 |
| 12.0643 | 50.54 |
| 12.0663 | 50.551 |
| 12.068200000000001 | 50.562 |
| 12.0701 | 50.572 |
| 12.0721 | 50.583 |
| 12.074 | 50.593 |
| 12.075899999999999 | 50.603 |
| 12.0779 | 50.613 |
| 12.079799999999999 | 50.623 |
| 12.081700000000001 | 50.633 |
| 12.0836 | 50.643 |
| 12.085600000000001 | 50.653 |
| 12.0875 | 50.662 |
| 12.0894 | 50.669 |
| 12.0914 | 50.676 |
| 12.0933 | 50.684 |
| 12.0952 | 50.691 |
| 12.0972 | 50.698 |
| 12.0991 | 50.705 |
| 12.101 | 50.712 |
| 12.1029 | 50.718 |
| 12.104899999999999 | 50.723 |
| 12.1068 | 50.728 |
| 12.1087 | 50.733 |
| 12.110700000000001 | 50.739 |
| 12.1126 | 50.744 |
| 12.1145 | 50.749 |
| 12.1165 | 50.755 |
| 12.1184 | 50.76 |
| 12.120299999999999 | 50.765 |
| 12.122200000000001 | 50.77 |
| 12.1242 | 50.776 |
| 12.126100000000001 | 50.781 |
| 12.128 | 50.786 |
| 12.13 | 50.792 |
| 12.1319 | 50.797 |
| 12.133799999999999 | 50.803 |
| 12.1358 | 50.808 |
| 12.1377 | 50.813 |
| 12.1396 | 50.819 |
| 12.1415 | 50.824 |
| 12.1435 | 50.83 |
| 12.1454 | 50.834 |
| 12.1473 | 50.839 |
| 12.149299999999998 | 50.843 |
| 12.151200000000001 | 50.848 |
| 12.1531 | 50.852 |
| 12.155100000000001 | 50.857 |
| 12.157 | 50.861 |
| 12.1589 | 50.865 |
| 12.1608 | 50.867 |
| 12.162799999999999 | 50.87 |
| 12.1647 | 50.872 |
| 12.1666 | 50.874 |
| 12.1686 | 50.877 |
| 12.1705 | 50.879 |
| 12.1724 | 50.882 |
| 12.1744 | 50.881 |
| 12.1763 | 50.881 |
| 12.1782 | 50.881 |
| 12.1801 | 50.881 |
| 12.1821 | 50.881 |
| 12.184 | 50.88 |
| 12.1859 | 50.88 |
| 12.187899999999999 | 50.879 |
| 12.1898 | 50.877 |
| 12.1917 | 50.875 |
| 12.193700000000002 | 50.873 |
| 12.1956 | 50.87 |
| 12.1975 | 50.868 |
| 12.199399999999999 | 50.866 |
| 12.2014 | 50.864 |
| 12.203299999999999 | 50.862 |
| 12.205200000000001 | 50.86 |
| 12.2072 | 50.857 |
| 12.209100000000001 | 50.855 |
| 12.211 | 50.853 |
| 12.213 | 50.851 |
| 12.2149 | 50.848 |
| 12.2168 | 50.846 |
| 12.2187 | 50.844 |
| 12.2207 | 50.842 |
| 12.2226 | 50.841 |
| 12.2245 | 50.839 |
| 12.2265 | 50.837 |
| 12.228399999999999 | 50.835 |
| 12.2303 | 50.832 |
| 12.232299999999999 | 50.829 |
| 12.234200000000001 | 50.826 |
| 12.2361 | 50.823 |
| 12.238 | 50.82 |
| 12.24 | 50.817 |
| 12.2419 | 50.814 |
| 12.243799999999998 | 50.811 |
| 12.2458 | 50.807 |
| 12.2477 | 50.802 |
| 12.249600000000001 | 50.797 |
| 12.2516 | 50.792 |
| 12.2535 | 50.787 |
| 12.2554 | 50.782 |
| 12.257299999999999 | 50.777 |
| 12.2593 | 50.771 |
| 12.2612 | 50.765 |
| 12.2631 | 50.759 |
| 12.2651 | 50.753 |
| 12.267 | 50.746 |
| 12.2689 | 50.74 |
| 12.2709 | 50.734 |
| 12.2728 | 50.728 |
| 12.274700000000001 | 50.722 |
| 12.2766 | 50.716 |
| 12.2786 | 50.71 |
| 12.2805 | 50.704 |
| 12.282399999999999 | 50.699 |
| 12.2844 | 50.693 |
| 12.286299999999999 | 50.687 |
| 12.288200000000002 | 50.681 |
| 12.2902 | 50.677 |
| 12.2921 | 50.672 |
| 12.294 | 50.668 |
| 12.2959 | 50.663 |
| 12.2979 | 50.659 |
| 12.2998 | 50.654 |
| 12.3017 | 50.65 |
| 12.303700000000001 | 50.646 |
| 12.3056 | 50.642 |
| 12.3075 | 50.639 |
| 12.3095 | 50.635 |
| 12.311399999999999 | 50.632 |
| 12.3133 | 50.628 |
| 12.3152 | 50.625 |
| 12.317200000000001 | 50.621 |
| 12.3191 | 50.616 |
| 12.321 | 50.611 |
| 12.323 | 50.606 |
| 12.3249 | 50.601 |
| 12.326799999999999 | 50.597 |
| 12.3288 | 50.592 |
| 12.3307 | 50.587 |
| 12.332600000000001 | 50.58 |
| 12.3345 | 50.573 |
| 12.3365 | 50.565 |
| 12.3384 | 50.557 |
| 12.3403 | 50.549 |
| 12.3423 | 50.541 |
| 12.3442 | 50.533 |
| 12.3461 | 50.525 |
| 12.3481 | 50.516 |
| 12.35 | 50.506 |
| 12.351899999999999 | 50.497 |
| 12.3538 | 50.487 |
| 12.355799999999999 | 50.478 |
| 12.357700000000001 | 50.468 |
| 12.3596 | 50.459 |
| 12.361600000000001 | 50.45 |
| 12.3635 | 50.442 |
| 12.3654 | 50.434 |
| 12.3674 | 50.426 |
| 12.369299999999999 | 50.419 |
| 12.3712 | 50.411 |
| 12.3731 | 50.403 |
| 12.3751 | 50.395 |
| 12.377 | 50.39 |
| 12.3789 | 50.385 |
| 12.3809 | 50.381 |
| 12.3828 | 50.377 |
| 12.3847 | 50.372 |
| 12.386700000000001 | 50.368 |
| 12.3886 | 50.364 |
| 12.3905 | 50.36 |
| 12.3924 | 50.357 |
| 12.3944 | 50.354 |
| 12.3963 | 50.351 |
| 12.398200000000001 | 50.348 |
| 12.4002 | 50.345 |
| 12.4021 | 50.343 |
| 12.404 | 50.34 |
| 12.406 | 50.337 |
| 12.4079 | 50.333 |
| 12.409799999999999 | 50.329 |
| 12.411700000000002 | 50.326 |
| 12.4137 | 50.322 |
| 12.4156 | 50.318 |
| 12.4175 | 50.315 |
| 12.4195 | 50.311 |
| 12.4214 | 50.307 |
| 12.4233 | 50.302 |
| 12.4253 | 50.297 |
| 12.427200000000001 | 50.292 |
| 12.4291 | 50.287 |
| 12.431 | 50.282 |
| 12.433 | 50.277 |
| 12.434899999999999 | 50.273 |
| 12.4368 | 50.267 |
| 12.438799999999999 | 50.261 |
| 12.440700000000001 | 50.256 |
| 12.4426 | 50.25 |
| 12.4445 | 50.244 |
| 12.4465 | 50.239 |
| 12.4484 | 50.233 |
| 12.450299999999999 | 50.227 |
| 12.4523 | 50.221 |
| 12.4542 | 50.215 |
| 12.456100000000001 | 50.209 |
| 12.4581 | 50.203 |
| 12.46 | 50.197 |
| 12.4619 | 50.19 |
| 12.463799999999999 | 50.184 |
| 12.4658 | 50.179 |
| 12.4677 | 50.174 |
| 12.4696 | 50.169 |
| 12.4716 | 50.163 |
| 12.4735 | 50.158 |
| 12.4754 | 50.153 |
| 12.4774 | 50.148 |
| 12.479299999999999 | 50.143 |
| 12.481200000000001 | 50.139 |
| 12.4831 | 50.136 |
| 12.485100000000001 | 50.133 |
| 12.487 | 50.129 |
| 12.4889 | 50.126 |
| 12.4909 | 50.123 |
| 12.492799999999999 | 50.12 |
| 12.4947 | 50.116 |
| 12.4967 | 50.113 |
| 12.4986 | 50.11 |
| 12.5005 | 50.107 |
| 12.5024 | 50.104 |
| 12.5044 | 50.101 |
| 12.5063 | 50.098 |
| 12.5082 | 50.095 |